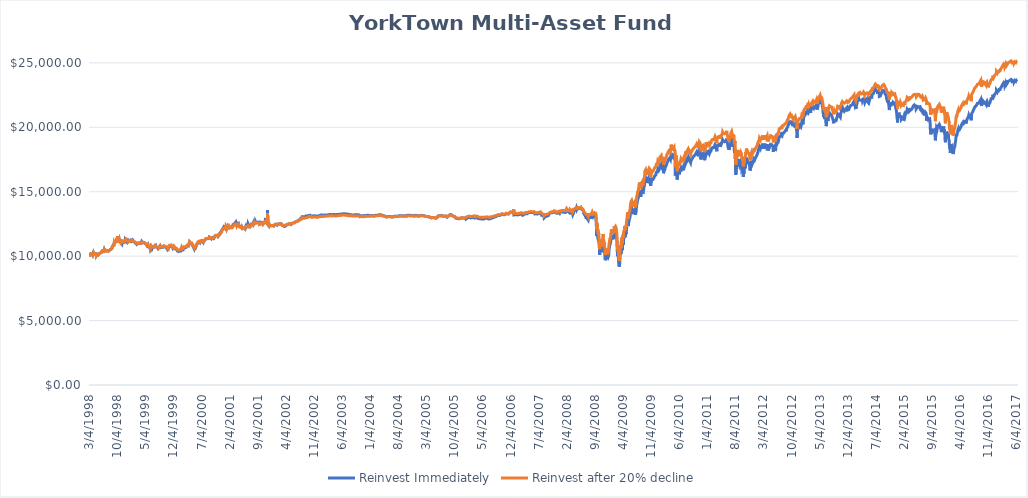
| Category | Reinvest Immediately | Reinvest after 20% decline |
|---|---|---|
| 3/4/98 | 10000 | 10000 |
| 3/5/98 | 10009.625 | 10009.625 |
| 3/6/98 | 9951.877 | 9951.877 |
| 3/9/98 | 10009.625 | 10009.625 |
| 3/10/98 | 10048.123 | 10048.123 |
| 3/11/98 | 10057.748 | 10057.748 |
| 3/12/98 | 10096.246 | 10096.246 |
| 3/13/98 | 10144.37 | 10144.37 |
| 3/16/98 | 10134.745 | 10134.745 |
| 3/17/98 | 10182.868 | 10182.868 |
| 3/18/98 | 10153.994 | 10153.994 |
| 3/19/98 | 10144.37 | 10144.37 |
| 3/20/98 | 10134.745 | 10134.745 |
| 3/23/98 | 10144.37 | 10144.37 |
| 3/24/98 | 10153.994 | 10153.994 |
| 3/25/98 | 10163.619 | 10163.619 |
| 3/26/98 | 10115.496 | 10115.496 |
| 3/27/98 | 10086.622 | 10086.622 |
| 3/30/98 | 10086.622 | 10086.622 |
| 3/31/98 | 10067.262 | 10067.372 |
| 4/1/98 | 10105.982 | 10105.871 |
| 4/2/98 | 10135.022 | 10134.745 |
| 4/3/98 | 10183.422 | 10182.868 |
| 4/6/98 | 10270.543 | 10269.49 |
| 4/7/98 | 10231.823 | 10230.991 |
| 4/8/98 | 10222.143 | 10221.367 |
| 4/9/98 | 10183.422 | 10182.868 |
| 4/13/98 | 10173.742 | 10173.244 |
| 4/14/98 | 10125.342 | 10125.12 |
| 4/15/98 | 10154.382 | 10153.994 |
| 4/16/98 | 10173.742 | 10173.244 |
| 4/17/98 | 10202.782 | 10202.117 |
| 4/20/98 | 10202.782 | 10202.117 |
| 4/21/98 | 10164.062 | 10163.619 |
| 4/22/98 | 10135.022 | 10134.745 |
| 4/23/98 | 10135.022 | 10134.745 |
| 4/24/98 | 10135.022 | 10134.745 |
| 4/27/98 | 10144.702 | 10144.37 |
| 4/28/98 | 10047.902 | 10048.123 |
| 4/29/98 | 10038.221 | 10038.499 |
| 4/30/98 | 10038.221 | 10038.499 |
| 5/1/98 | 10125.342 | 10125.12 |
| 5/4/98 | 10154.382 | 10153.994 |
| 5/5/98 | 10154.382 | 10153.994 |
| 5/6/98 | 10135.022 | 10134.745 |
| 5/7/98 | 10164.062 | 10163.619 |
| 5/8/98 | 10154.382 | 10153.994 |
| 5/11/98 | 10135.022 | 10134.745 |
| 5/12/98 | 10096.302 | 10096.246 |
| 5/13/98 | 10154.382 | 10153.994 |
| 5/14/98 | 10173.742 | 10173.244 |
| 5/15/98 | 10154.382 | 10153.994 |
| 5/18/98 | 10154.382 | 10153.994 |
| 5/19/98 | 10183.422 | 10182.868 |
| 5/20/98 | 10173.742 | 10173.244 |
| 5/21/98 | 10212.463 | 10211.742 |
| 5/22/98 | 10183.422 | 10182.868 |
| 5/26/98 | 10202.782 | 10202.117 |
| 5/27/98 | 10241.503 | 10240.616 |
| 5/28/98 | 10270.543 | 10269.49 |
| 5/29/98 | 10270.543 | 10269.49 |
| 6/1/98 | 10289.903 | 10288.739 |
| 6/2/98 | 10299.583 | 10298.364 |
| 6/3/98 | 10280.223 | 10279.115 |
| 6/4/98 | 10270.543 | 10269.49 |
| 6/5/98 | 10251.183 | 10250.241 |
| 6/8/98 | 10260.863 | 10259.865 |
| 6/9/98 | 10270.543 | 10269.49 |
| 6/10/98 | 10270.543 | 10269.49 |
| 6/11/98 | 10328.623 | 10327.238 |
| 6/12/98 | 10406.064 | 10404.235 |
| 6/15/98 | 10425.424 | 10423.484 |
| 6/16/98 | 10444.784 | 10442.733 |
| 6/17/98 | 10396.384 | 10394.61 |
| 6/18/98 | 10328.623 | 10327.238 |
| 6/19/98 | 10347.983 | 10346.487 |
| 6/22/98 | 10367.343 | 10365.736 |
| 6/23/98 | 10386.704 | 10384.986 |
| 6/24/98 | 10396.384 | 10394.61 |
| 6/25/98 | 10396.384 | 10394.61 |
| 6/26/98 | 10492.63 | 10490.857 |
| 6/29/98 | 10404.703 | 10404.235 |
| 6/30/98 | 10394.933 | 10394.61 |
| 7/1/98 | 10424.242 | 10423.484 |
| 7/2/98 | 10424.242 | 10423.484 |
| 7/6/98 | 10443.782 | 10442.733 |
| 7/7/98 | 10463.321 | 10461.983 |
| 7/8/98 | 10453.551 | 10452.358 |
| 7/9/98 | 10443.782 | 10442.733 |
| 7/10/98 | 10453.551 | 10452.358 |
| 7/13/98 | 10453.551 | 10452.358 |
| 7/14/98 | 10414.473 | 10413.859 |
| 7/15/98 | 10385.164 | 10384.986 |
| 7/16/98 | 10394.933 | 10394.61 |
| 7/17/98 | 10385.164 | 10384.986 |
| 7/20/98 | 10375.394 | 10375.361 |
| 7/21/98 | 10394.933 | 10394.61 |
| 7/22/98 | 10414.473 | 10413.859 |
| 7/23/98 | 10414.473 | 10413.859 |
| 7/24/98 | 10443.782 | 10442.733 |
| 7/27/98 | 10424.242 | 10423.484 |
| 7/28/98 | 10424.242 | 10423.484 |
| 7/29/98 | 10404.703 | 10404.235 |
| 7/30/98 | 10385.164 | 10384.986 |
| 7/31/98 | 10404.703 | 10404.235 |
| 8/3/98 | 10414.473 | 10413.859 |
| 8/4/98 | 10453.551 | 10452.358 |
| 8/5/98 | 10473.091 | 10471.607 |
| 8/6/98 | 10473.091 | 10471.607 |
| 8/7/98 | 10473.091 | 10471.607 |
| 8/10/98 | 10502.4 | 10500.481 |
| 8/11/98 | 10502.4 | 10500.481 |
| 8/12/98 | 10541.478 | 10538.98 |
| 8/13/98 | 10531.709 | 10529.355 |
| 8/14/98 | 10492.63 | 10490.857 |
| 8/17/98 | 10531.709 | 10529.355 |
| 8/18/98 | 10541.478 | 10538.98 |
| 8/19/98 | 10531.709 | 10529.355 |
| 8/20/98 | 10521.939 | 10519.731 |
| 8/21/98 | 10551.248 | 10548.604 |
| 8/24/98 | 10619.636 | 10615.977 |
| 8/25/98 | 10639.175 | 10635.226 |
| 8/26/98 | 10668.484 | 10664.1 |
| 8/27/98 | 10717.333 | 10712.223 |
| 8/28/98 | 10785.72 | 10779.596 |
| 8/31/98 | 10805.26 | 10798.845 |
| 9/1/98 | 10824.799 | 10818.094 |
| 9/2/98 | 10824.799 | 10818.094 |
| 9/3/98 | 10795.49 | 10789.22 |
| 9/4/98 | 10844.338 | 10837.344 |
| 9/8/98 | 10863.878 | 10856.593 |
| 9/9/98 | 10854.108 | 10846.968 |
| 9/10/98 | 10922.496 | 10914.341 |
| 9/11/98 | 11088.58 | 11077.96 |
| 9/14/98 | 11010.423 | 11000.962 |
| 9/15/98 | 10990.883 | 10981.713 |
| 9/16/98 | 10971.344 | 10962.464 |
| 9/17/98 | 10990.883 | 10981.713 |
| 9/18/98 | 11059.271 | 11049.086 |
| 9/21/98 | 11137.429 | 11126.083 |
| 9/22/98 | 11127.659 | 11116.458 |
| 9/23/98 | 11117.889 | 11106.833 |
| 9/24/98 | 11137.429 | 11126.083 |
| 9/25/98 | 11156.968 | 11145.332 |
| 9/28/98 | 11204.366 | 11193.455 |
| 9/29/98 | 11184.657 | 11174.206 |
| 9/30/98 | 11214.22 | 11203.08 |
| 10/1/98 | 11342.326 | 11328.2 |
| 10/2/98 | 11411.307 | 11395.573 |
| 10/5/98 | 11450.724 | 11434.071 |
| 10/6/98 | 11549.267 | 11530.318 |
| 10/7/98 | 11470.433 | 11453.321 |
| 10/8/98 | 11391.598 | 11376.323 |
| 10/9/98 | 11204.366 | 11193.455 |
| 10/12/98 | 11046.697 | 11039.461 |
| 10/13/98 | 11046.697 | 11039.461 |
| 10/14/98 | 11056.551 | 11049.086 |
| 10/15/98 | 11174.803 | 11164.581 |
| 10/16/98 | 11164.949 | 11154.957 |
| 10/19/98 | 11293.055 | 11280.077 |
| 10/20/98 | 11273.346 | 11260.828 |
| 10/21/98 | 11194.512 | 11183.831 |
| 10/22/98 | 11184.657 | 11174.206 |
| 10/23/98 | 11174.803 | 11164.581 |
| 10/26/98 | 11115.677 | 11106.833 |
| 10/27/98 | 11105.823 | 11097.209 |
| 10/28/98 | 11194.512 | 11183.831 |
| 10/29/98 | 11263.492 | 11251.203 |
| 10/30/98 | 11302.909 | 11289.702 |
| 11/2/98 | 11253.638 | 11241.578 |
| 11/3/98 | 11155.094 | 11145.332 |
| 11/4/98 | 11155.094 | 11145.332 |
| 11/5/98 | 11046.697 | 11039.461 |
| 11/6/98 | 11056.551 | 11049.086 |
| 11/9/98 | 10967.862 | 10962.464 |
| 11/10/98 | 11017.134 | 11010.587 |
| 11/11/98 | 11056.551 | 11049.086 |
| 11/12/98 | 11056.551 | 11049.086 |
| 11/13/98 | 11125.531 | 11116.458 |
| 11/16/98 | 11086.114 | 11077.96 |
| 11/17/98 | 11076.26 | 11068.335 |
| 11/18/98 | 11076.26 | 11068.335 |
| 11/19/98 | 11086.114 | 11077.96 |
| 11/20/98 | 11086.114 | 11077.96 |
| 11/23/98 | 11125.531 | 11116.458 |
| 11/24/98 | 11095.968 | 11087.584 |
| 11/25/98 | 11076.26 | 11068.335 |
| 11/27/98 | 11086.114 | 11077.96 |
| 11/30/98 | 11105.823 | 11097.209 |
| 12/1/98 | 11174.803 | 11164.581 |
| 12/2/98 | 11224.075 | 11212.705 |
| 12/3/98 | 11293.055 | 11280.077 |
| 12/4/98 | 11302.909 | 11289.702 |
| 12/7/98 | 11243.783 | 11231.954 |
| 12/8/98 | 11214.22 | 11203.08 |
| 12/9/98 | 11263.492 | 11251.203 |
| 12/10/98 | 11322.618 | 11308.951 |
| 12/11/98 | 11342.326 | 11328.2 |
| 12/14/98 | 11293.055 | 11280.077 |
| 12/15/98 | 11312.763 | 11299.326 |
| 12/16/98 | 11273.346 | 11260.828 |
| 12/17/98 | 11312.763 | 11299.326 |
| 12/18/98 | 11302.909 | 11289.702 |
| 12/21/98 | 11284.786 | 11280.077 |
| 12/22/98 | 11223.787 | 11222.329 |
| 12/23/98 | 11203.454 | 11203.08 |
| 12/24/98 | 11122.123 | 11126.083 |
| 12/28/98 | 11061.124 | 11068.335 |
| 12/29/98 | 11122.123 | 11126.083 |
| 12/30/98 | 11172.955 | 11174.206 |
| 12/31/98 | 11223.787 | 11222.329 |
| 1/4/99 | 11233.954 | 11231.954 |
| 1/5/99 | 11193.288 | 11193.455 |
| 1/6/99 | 11162.788 | 11164.581 |
| 1/7/99 | 11183.121 | 11183.831 |
| 1/8/99 | 11162.788 | 11164.581 |
| 1/11/99 | 11111.956 | 11116.458 |
| 1/12/99 | 11101.79 | 11106.833 |
| 1/13/99 | 11142.456 | 11145.332 |
| 1/14/99 | 11172.955 | 11174.206 |
| 1/15/99 | 11244.12 | 11241.578 |
| 1/19/99 | 11213.621 | 11212.705 |
| 1/20/99 | 11193.288 | 11193.455 |
| 1/21/99 | 11162.788 | 11164.581 |
| 1/22/99 | 11203.454 | 11203.08 |
| 1/25/99 | 11223.787 | 11222.329 |
| 1/26/99 | 11223.787 | 11222.329 |
| 1/27/99 | 11223.787 | 11222.329 |
| 1/28/99 | 11233.954 | 11231.954 |
| 1/29/99 | 11254.287 | 11251.203 |
| 2/1/99 | 11264.453 | 11260.828 |
| 2/2/99 | 11213.621 | 11212.705 |
| 2/3/99 | 11183.121 | 11183.831 |
| 2/4/99 | 11162.788 | 11164.581 |
| 2/5/99 | 11132.289 | 11135.707 |
| 2/8/99 | 11091.623 | 11097.209 |
| 2/9/99 | 11101.79 | 11106.833 |
| 2/10/99 | 11111.956 | 11116.458 |
| 2/11/99 | 11111.956 | 11116.458 |
| 2/12/99 | 11101.79 | 11106.833 |
| 2/16/99 | 11020.458 | 11029.836 |
| 2/17/99 | 11061.124 | 11068.335 |
| 2/18/99 | 11040.791 | 11049.086 |
| 2/19/99 | 11030.624 | 11039.461 |
| 2/22/99 | 11050.957 | 11058.71 |
| 2/23/99 | 11030.624 | 11039.461 |
| 2/24/99 | 11000.125 | 11010.587 |
| 2/25/99 | 10949.293 | 10962.464 |
| 2/26/99 | 10959.459 | 10972.089 |
| 3/1/99 | 10918.793 | 10933.59 |
| 3/2/99 | 10928.96 | 10943.215 |
| 3/3/99 | 10928.96 | 10943.215 |
| 3/4/99 | 10928.96 | 10943.215 |
| 3/5/99 | 10949.293 | 10962.464 |
| 3/8/99 | 10959.459 | 10972.089 |
| 3/9/99 | 10989.958 | 11000.962 |
| 3/10/99 | 10989.958 | 11000.962 |
| 3/11/99 | 10979.792 | 10991.338 |
| 3/12/99 | 11000.125 | 11010.587 |
| 3/15/99 | 11020.458 | 11029.836 |
| 3/16/99 | 11040.791 | 11049.086 |
| 3/17/99 | 11030.624 | 11039.461 |
| 3/18/99 | 11030.624 | 11039.461 |
| 3/19/99 | 11020.458 | 11029.836 |
| 3/22/99 | 11000.125 | 11010.587 |
| 3/23/99 | 11010.291 | 11020.212 |
| 3/24/99 | 11030.624 | 11039.461 |
| 3/25/99 | 10984.54 | 11000.962 |
| 3/26/99 | 10994.796 | 11010.587 |
| 3/29/99 | 10953.771 | 10972.089 |
| 3/30/99 | 10974.284 | 10991.338 |
| 3/31/99 | 10974.284 | 10991.338 |
| 4/1/99 | 10943.515 | 10962.464 |
| 4/5/99 | 11005.053 | 11020.212 |
| 4/6/99 | 11056.334 | 11068.335 |
| 4/7/99 | 11066.591 | 11077.96 |
| 4/8/99 | 11138.385 | 11145.332 |
| 4/9/99 | 11128.129 | 11135.707 |
| 4/12/99 | 11148.642 | 11154.957 |
| 4/13/99 | 11117.872 | 11126.083 |
| 4/14/99 | 11107.616 | 11116.458 |
| 4/15/99 | 11087.103 | 11097.209 |
| 4/16/99 | 11046.078 | 11058.71 |
| 4/19/99 | 11087.103 | 11097.209 |
| 4/20/99 | 11117.872 | 11126.083 |
| 4/21/99 | 11107.616 | 11116.458 |
| 4/22/99 | 11046.078 | 11058.71 |
| 4/23/99 | 11046.078 | 11058.71 |
| 4/26/99 | 11056.334 | 11068.335 |
| 4/27/99 | 11076.847 | 11087.584 |
| 4/28/99 | 11056.334 | 11068.335 |
| 4/29/99 | 11107.616 | 11116.458 |
| 4/30/99 | 11015.309 | 11029.836 |
| 5/3/99 | 11005.053 | 11020.212 |
| 5/4/99 | 10964.027 | 10981.713 |
| 5/5/99 | 10974.284 | 10991.338 |
| 5/6/99 | 10933.258 | 10952.839 |
| 5/7/99 | 10933.258 | 10952.839 |
| 5/10/99 | 10933.258 | 10952.839 |
| 5/11/99 | 10892.233 | 10914.341 |
| 5/12/99 | 10912.746 | 10933.59 |
| 5/13/99 | 10984.54 | 11000.962 |
| 5/14/99 | 10871.72 | 10895.091 |
| 5/17/99 | 10851.208 | 10875.842 |
| 5/18/99 | 10810.182 | 10837.344 |
| 5/19/99 | 10840.951 | 10866.218 |
| 5/20/99 | 10840.951 | 10866.218 |
| 5/21/99 | 10881.977 | 10904.716 |
| 5/24/99 | 10902.489 | 10923.965 |
| 5/25/99 | 10902.489 | 10923.965 |
| 5/26/99 | 10861.464 | 10885.467 |
| 5/27/99 | 10799.926 | 10827.719 |
| 5/28/99 | 10799.926 | 10827.719 |
| 6/1/99 | 10697.363 | 10731.473 |
| 6/2/99 | 10697.363 | 10731.473 |
| 6/3/99 | 10707.619 | 10741.097 |
| 6/4/99 | 10707.619 | 10741.097 |
| 6/7/99 | 10707.619 | 10741.097 |
| 6/8/99 | 10697.363 | 10731.473 |
| 6/9/99 | 10676.85 | 10712.223 |
| 6/10/99 | 10646.081 | 10683.349 |
| 6/11/99 | 10574.286 | 10615.977 |
| 6/14/99 | 10594.799 | 10635.226 |
| 6/15/99 | 10605.055 | 10644.851 |
| 6/16/99 | 10635.825 | 10673.725 |
| 6/17/99 | 10748.644 | 10779.596 |
| 6/18/99 | 10717.875 | 10750.722 |
| 6/21/99 | 10666.594 | 10702.599 |
| 6/22/99 | 10646.081 | 10683.349 |
| 6/23/99 | 10605.055 | 10644.851 |
| 6/24/99 | 10578.226 | 10625.602 |
| 6/25/99 | 10578.226 | 10625.602 |
| 6/28/99 | 10619.628 | 10664.1 |
| 6/29/99 | 10640.329 | 10683.349 |
| 6/30/99 | 10723.133 | 10760.346 |
| 7/1/99 | 10702.432 | 10741.097 |
| 7/2/99 | 10702.432 | 10741.097 |
| 7/6/99 | 10681.731 | 10721.848 |
| 7/7/99 | 10661.03 | 10702.599 |
| 7/8/99 | 10702.432 | 10741.097 |
| 7/9/99 | 10723.133 | 10760.346 |
| 7/12/99 | 10774.886 | 10808.47 |
| 7/13/99 | 10785.236 | 10818.094 |
| 7/14/99 | 10774.886 | 10808.47 |
| 7/15/99 | 10785.236 | 10818.094 |
| 7/16/99 | 10805.937 | 10837.344 |
| 7/19/99 | 10816.288 | 10846.968 |
| 7/20/99 | 10836.989 | 10866.218 |
| 7/21/99 | 10836.989 | 10866.218 |
| 7/22/99 | 10764.535 | 10798.845 |
| 7/23/99 | 10723.133 | 10760.346 |
| 7/26/99 | 10702.432 | 10741.097 |
| 7/27/99 | 10733.484 | 10769.971 |
| 7/28/99 | 10723.133 | 10760.346 |
| 7/29/99 | 10681.731 | 10721.848 |
| 7/30/99 | 10681.731 | 10721.848 |
| 8/2/99 | 10681.731 | 10721.848 |
| 8/3/99 | 10661.03 | 10702.599 |
| 8/4/99 | 10671.38 | 10712.223 |
| 8/5/99 | 10723.133 | 10760.346 |
| 8/6/99 | 10640.329 | 10683.349 |
| 8/9/99 | 10578.226 | 10625.602 |
| 8/10/99 | 10557.525 | 10606.352 |
| 8/11/99 | 10578.226 | 10625.602 |
| 8/12/99 | 10578.226 | 10625.602 |
| 8/13/99 | 10640.329 | 10683.349 |
| 8/16/99 | 10640.329 | 10683.349 |
| 8/17/99 | 10681.731 | 10721.848 |
| 8/18/99 | 10702.432 | 10741.097 |
| 8/19/99 | 10702.432 | 10741.097 |
| 8/20/99 | 10702.432 | 10741.097 |
| 8/23/99 | 10702.432 | 10741.097 |
| 8/24/99 | 10723.133 | 10760.346 |
| 8/25/99 | 10795.587 | 10827.719 |
| 8/26/99 | 10785.236 | 10818.094 |
| 8/27/99 | 10743.834 | 10779.596 |
| 8/30/99 | 10671.38 | 10712.223 |
| 8/31/99 | 10661.03 | 10702.599 |
| 9/1/99 | 10661.03 | 10702.599 |
| 9/2/99 | 10640.329 | 10683.349 |
| 9/3/99 | 10712.782 | 10750.722 |
| 9/7/99 | 10692.081 | 10731.473 |
| 9/8/99 | 10692.081 | 10731.473 |
| 9/9/99 | 10671.38 | 10712.223 |
| 9/10/99 | 10712.782 | 10750.722 |
| 9/13/99 | 10712.782 | 10750.722 |
| 9/14/99 | 10671.38 | 10712.223 |
| 9/15/99 | 10692.081 | 10731.473 |
| 9/16/99 | 10712.782 | 10750.722 |
| 9/17/99 | 10743.834 | 10779.596 |
| 9/20/99 | 10723.133 | 10760.346 |
| 9/21/99 | 10723.133 | 10760.346 |
| 9/22/99 | 10733.484 | 10769.971 |
| 9/23/99 | 10774.886 | 10808.47 |
| 9/24/99 | 10847.339 | 10875.842 |
| 9/27/99 | 10805.937 | 10837.344 |
| 9/28/99 | 10774.886 | 10808.47 |
| 9/29/99 | 10712.782 | 10750.722 |
| 9/30/99 | 10757.276 | 10798.845 |
| 10/1/99 | 10705.057 | 10750.722 |
| 10/4/99 | 10736.388 | 10779.596 |
| 10/5/99 | 10684.169 | 10731.473 |
| 10/6/99 | 10673.725 | 10721.848 |
| 10/7/99 | 10673.725 | 10721.848 |
| 10/8/99 | 10684.169 | 10731.473 |
| 10/11/99 | 10684.169 | 10731.473 |
| 10/12/99 | 10663.281 | 10712.223 |
| 10/13/99 | 10631.949 | 10683.349 |
| 10/14/99 | 10600.617 | 10654.475 |
| 10/15/99 | 10642.393 | 10692.974 |
| 10/18/99 | 10558.841 | 10615.977 |
| 10/19/99 | 10527.509 | 10587.103 |
| 10/20/99 | 10506.621 | 10567.854 |
| 10/21/99 | 10506.621 | 10567.854 |
| 10/22/99 | 10506.621 | 10567.854 |
| 10/25/99 | 10496.177 | 10558.229 |
| 10/26/99 | 10485.733 | 10548.604 |
| 10/27/99 | 10527.509 | 10587.103 |
| 10/28/99 | 10611.061 | 10664.1 |
| 10/29/99 | 10705.057 | 10750.722 |
| 11/1/99 | 10673.725 | 10721.848 |
| 11/2/99 | 10705.057 | 10750.722 |
| 11/3/99 | 10725.944 | 10769.971 |
| 11/4/99 | 10778.164 | 10818.094 |
| 11/5/99 | 10809.496 | 10846.968 |
| 11/8/99 | 10767.72 | 10808.47 |
| 11/9/99 | 10778.164 | 10818.094 |
| 11/10/99 | 10757.276 | 10798.845 |
| 11/11/99 | 10757.276 | 10798.845 |
| 11/12/99 | 10819.94 | 10856.593 |
| 11/15/99 | 10830.384 | 10866.218 |
| 11/16/99 | 10809.496 | 10846.968 |
| 11/17/99 | 10767.72 | 10808.47 |
| 11/18/99 | 10736.388 | 10779.596 |
| 11/19/99 | 10746.832 | 10789.22 |
| 11/22/99 | 10715.5 | 10760.346 |
| 11/23/99 | 10715.5 | 10760.346 |
| 11/24/99 | 10715.5 | 10760.346 |
| 11/26/99 | 10715.5 | 10760.346 |
| 11/29/99 | 10631.949 | 10683.349 |
| 11/30/99 | 10663.281 | 10712.223 |
| 12/1/99 | 10642.393 | 10692.974 |
| 12/2/99 | 10611.061 | 10664.1 |
| 12/3/99 | 10684.169 | 10731.473 |
| 12/6/99 | 10694.613 | 10741.097 |
| 12/7/99 | 10746.832 | 10789.22 |
| 12/8/99 | 10725.944 | 10769.971 |
| 12/9/99 | 10725.944 | 10769.971 |
| 12/10/99 | 10788.608 | 10827.719 |
| 12/13/99 | 10788.608 | 10827.719 |
| 12/14/99 | 10684.169 | 10731.473 |
| 12/15/99 | 10652.837 | 10702.599 |
| 12/16/99 | 10600.617 | 10654.475 |
| 12/17/99 | 10590.173 | 10644.851 |
| 12/20/99 | 10558.841 | 10615.977 |
| 12/21/99 | 10548.397 | 10606.352 |
| 12/22/99 | 10517.065 | 10577.478 |
| 12/23/99 | 10517.065 | 10577.478 |
| 12/27/99 | 10537.953 | 10596.728 |
| 12/28/99 | 10537.953 | 10596.728 |
| 12/29/99 | 10548.397 | 10606.352 |
| 12/30/99 | 10531.804 | 10615.977 |
| 12/31/99 | 10488.729 | 10577.478 |
| 1/3/00 | 10402.579 | 10500.481 |
| 1/4/00 | 10467.191 | 10558.229 |
| 1/5/00 | 10391.81 | 10490.857 |
| 1/6/00 | 10434.885 | 10529.355 |
| 1/7/00 | 10445.654 | 10538.98 |
| 1/10/00 | 10434.885 | 10529.355 |
| 1/11/00 | 10359.504 | 10461.983 |
| 1/12/00 | 10337.967 | 10442.733 |
| 1/13/00 | 10424.116 | 10519.731 |
| 1/14/00 | 10402.579 | 10500.481 |
| 1/18/00 | 10370.273 | 10471.607 |
| 1/19/00 | 10402.579 | 10500.481 |
| 1/20/00 | 10391.81 | 10490.857 |
| 1/21/00 | 10381.042 | 10481.232 |
| 1/24/00 | 10424.116 | 10519.731 |
| 1/25/00 | 10413.348 | 10510.106 |
| 1/26/00 | 10402.579 | 10500.481 |
| 1/27/00 | 10402.579 | 10500.481 |
| 1/28/00 | 10488.729 | 10577.478 |
| 1/31/00 | 10499.497 | 10587.103 |
| 2/1/00 | 10531.804 | 10615.977 |
| 2/2/00 | 10542.572 | 10625.602 |
| 2/3/00 | 10596.416 | 10673.725 |
| 2/4/00 | 10542.572 | 10625.602 |
| 2/7/00 | 10467.191 | 10558.229 |
| 2/8/00 | 10521.035 | 10606.352 |
| 2/9/00 | 10488.729 | 10577.478 |
| 2/10/00 | 10402.579 | 10500.481 |
| 2/11/00 | 10434.885 | 10529.355 |
| 2/14/00 | 10510.266 | 10596.728 |
| 2/15/00 | 10488.729 | 10577.478 |
| 2/16/00 | 10499.497 | 10587.103 |
| 2/17/00 | 10488.729 | 10577.478 |
| 2/18/00 | 10564.11 | 10644.851 |
| 2/22/00 | 10661.028 | 10731.473 |
| 2/23/00 | 10607.185 | 10683.349 |
| 2/24/00 | 10671.797 | 10741.097 |
| 2/25/00 | 10671.797 | 10741.097 |
| 2/28/00 | 10607.185 | 10683.349 |
| 2/29/00 | 10607.185 | 10683.349 |
| 3/1/00 | 10650.259 | 10721.848 |
| 3/2/00 | 10628.722 | 10702.599 |
| 3/3/00 | 10661.028 | 10731.473 |
| 3/6/00 | 10650.259 | 10721.848 |
| 3/7/00 | 10661.028 | 10731.473 |
| 3/8/00 | 10661.028 | 10731.473 |
| 3/9/00 | 10682.566 | 10750.722 |
| 3/10/00 | 10650.259 | 10721.848 |
| 3/13/00 | 10671.797 | 10741.097 |
| 3/14/00 | 10714.872 | 10779.596 |
| 3/15/00 | 10714.872 | 10779.596 |
| 3/16/00 | 10714.872 | 10779.596 |
| 3/17/00 | 10801.021 | 10856.593 |
| 3/20/00 | 10801.021 | 10856.593 |
| 3/21/00 | 10833.328 | 10885.467 |
| 3/22/00 | 10833.328 | 10885.467 |
| 3/23/00 | 10865.634 | 10914.341 |
| 3/24/00 | 10811.79 | 10866.218 |
| 3/27/00 | 10790.253 | 10846.968 |
| 3/28/00 | 10811.79 | 10866.218 |
| 3/29/00 | 10822.559 | 10875.842 |
| 3/30/00 | 10822.559 | 10875.842 |
| 3/31/00 | 10940.343 | 10991.338 |
| 4/3/00 | 10972.936 | 11020.212 |
| 4/4/00 | 11092.443 | 11126.083 |
| 4/5/00 | 11092.443 | 11126.083 |
| 4/6/00 | 11027.257 | 11068.335 |
| 4/7/00 | 11081.579 | 11116.458 |
| 4/10/00 | 11125.036 | 11154.957 |
| 4/11/00 | 11059.85 | 11097.209 |
| 4/12/00 | 10983.8 | 11029.836 |
| 4/13/00 | 11005.529 | 11049.086 |
| 4/14/00 | 11027.257 | 11068.335 |
| 4/17/00 | 10983.8 | 11029.836 |
| 4/18/00 | 10929.478 | 10981.713 |
| 4/19/00 | 10972.936 | 11020.212 |
| 4/20/00 | 10983.8 | 11029.836 |
| 4/24/00 | 10994.664 | 11039.461 |
| 4/25/00 | 10918.614 | 10972.089 |
| 4/26/00 | 10918.614 | 10972.089 |
| 4/27/00 | 10820.836 | 10885.467 |
| 4/28/00 | 10842.564 | 10904.716 |
| 5/1/00 | 10809.971 | 10875.842 |
| 5/2/00 | 10799.107 | 10866.218 |
| 5/3/00 | 10701.328 | 10779.596 |
| 5/4/00 | 10679.6 | 10760.346 |
| 5/5/00 | 10647.007 | 10731.473 |
| 5/8/00 | 10592.685 | 10683.349 |
| 5/9/00 | 10625.278 | 10712.223 |
| 5/10/00 | 10690.464 | 10769.971 |
| 5/11/00 | 10701.328 | 10779.596 |
| 5/12/00 | 10647.007 | 10731.473 |
| 5/15/00 | 10690.464 | 10769.971 |
| 5/16/00 | 10733.921 | 10808.47 |
| 5/17/00 | 10690.464 | 10769.971 |
| 5/18/00 | 10625.278 | 10712.223 |
| 5/19/00 | 10647.007 | 10731.473 |
| 5/22/00 | 10733.921 | 10808.47 |
| 5/23/00 | 10701.328 | 10779.596 |
| 5/24/00 | 10701.328 | 10779.596 |
| 5/25/00 | 10766.514 | 10837.344 |
| 5/26/00 | 10831.7 | 10895.091 |
| 5/30/00 | 10820.836 | 10885.467 |
| 5/31/00 | 10886.021 | 10943.215 |
| 6/1/00 | 10951.207 | 11000.962 |
| 6/2/00 | 10994.664 | 11039.461 |
| 6/5/00 | 11027.257 | 11068.335 |
| 6/6/00 | 11027.257 | 11068.335 |
| 6/7/00 | 11059.85 | 11097.209 |
| 6/8/00 | 11081.579 | 11116.458 |
| 6/9/00 | 11092.443 | 11126.083 |
| 6/12/00 | 11103.307 | 11135.707 |
| 6/13/00 | 11070.714 | 11106.833 |
| 6/14/00 | 11114.171 | 11145.332 |
| 6/15/00 | 11125.036 | 11154.957 |
| 6/16/00 | 11179.357 | 11203.08 |
| 6/19/00 | 11157.629 | 11183.831 |
| 6/20/00 | 11168.493 | 11193.455 |
| 6/21/00 | 11092.443 | 11126.083 |
| 6/22/00 | 11070.714 | 11106.833 |
| 6/23/00 | 11038.121 | 11077.96 |
| 6/26/00 | 11070.714 | 11106.833 |
| 6/27/00 | 11103.307 | 11135.707 |
| 6/28/00 | 11092.443 | 11126.083 |
| 6/29/00 | 11048.986 | 11087.584 |
| 6/30/00 | 11166.961 | 11203.08 |
| 7/3/00 | 11166.961 | 11203.08 |
| 7/5/00 | 11210.796 | 11241.578 |
| 7/6/00 | 11166.961 | 11203.08 |
| 7/7/00 | 11210.796 | 11241.578 |
| 7/10/00 | 11188.878 | 11222.329 |
| 7/11/00 | 11177.919 | 11212.705 |
| 7/12/00 | 11156.002 | 11193.455 |
| 7/13/00 | 11199.837 | 11231.954 |
| 7/14/00 | 11134.084 | 11174.206 |
| 7/17/00 | 11079.291 | 11126.083 |
| 7/18/00 | 11090.249 | 11135.707 |
| 7/19/00 | 11090.249 | 11135.707 |
| 7/20/00 | 11177.919 | 11212.705 |
| 7/21/00 | 11210.796 | 11241.578 |
| 7/24/00 | 11199.837 | 11231.954 |
| 7/25/00 | 11199.837 | 11231.954 |
| 7/26/00 | 11210.796 | 11241.578 |
| 7/27/00 | 11232.713 | 11260.828 |
| 7/28/00 | 11221.754 | 11251.203 |
| 7/31/00 | 11210.796 | 11241.578 |
| 8/1/00 | 11243.672 | 11270.452 |
| 8/2/00 | 11243.672 | 11270.452 |
| 8/3/00 | 11276.548 | 11299.326 |
| 8/4/00 | 11331.342 | 11347.449 |
| 8/7/00 | 11331.342 | 11347.449 |
| 8/8/00 | 11320.383 | 11337.825 |
| 8/9/00 | 11331.342 | 11347.449 |
| 8/10/00 | 11375.177 | 11385.948 |
| 8/11/00 | 11342.301 | 11357.074 |
| 8/14/00 | 11353.259 | 11366.699 |
| 8/15/00 | 11353.259 | 11366.699 |
| 8/16/00 | 11342.301 | 11357.074 |
| 8/17/00 | 11331.342 | 11347.449 |
| 8/18/00 | 11364.218 | 11376.323 |
| 8/21/00 | 11375.177 | 11385.948 |
| 8/22/00 | 11375.177 | 11385.948 |
| 8/23/00 | 11375.177 | 11385.948 |
| 8/24/00 | 11429.971 | 11434.071 |
| 8/25/00 | 11451.888 | 11453.321 |
| 8/28/00 | 11408.053 | 11414.822 |
| 8/29/00 | 11375.177 | 11385.948 |
| 8/30/00 | 11386.136 | 11395.573 |
| 8/31/00 | 11429.971 | 11434.071 |
| 9/1/00 | 11484.764 | 11482.194 |
| 9/5/00 | 11495.723 | 11491.819 |
| 9/6/00 | 11473.805 | 11472.57 |
| 9/7/00 | 11440.929 | 11443.696 |
| 9/8/00 | 11462.847 | 11462.945 |
| 9/11/00 | 11429.971 | 11434.071 |
| 9/12/00 | 11419.012 | 11424.447 |
| 9/13/00 | 11440.929 | 11443.696 |
| 9/14/00 | 11419.012 | 11424.447 |
| 9/15/00 | 11386.136 | 11395.573 |
| 9/18/00 | 11342.301 | 11357.074 |
| 9/19/00 | 11364.218 | 11376.323 |
| 9/20/00 | 11331.342 | 11347.449 |
| 9/21/00 | 11353.259 | 11366.699 |
| 9/22/00 | 11397.094 | 11405.197 |
| 9/25/00 | 11397.094 | 11405.197 |
| 9/26/00 | 11429.971 | 11434.071 |
| 9/27/00 | 11397.094 | 11405.197 |
| 9/28/00 | 11416.629 | 11434.071 |
| 9/29/00 | 11449.785 | 11462.945 |
| 10/2/00 | 11416.629 | 11434.071 |
| 10/3/00 | 11394.526 | 11414.822 |
| 10/4/00 | 11372.422 | 11395.573 |
| 10/5/00 | 11405.578 | 11424.447 |
| 10/6/00 | 11449.785 | 11462.945 |
| 10/9/00 | 11449.785 | 11462.945 |
| 10/10/00 | 11471.889 | 11482.194 |
| 10/11/00 | 11493.993 | 11501.444 |
| 10/12/00 | 11549.252 | 11549.567 |
| 10/13/00 | 11549.252 | 11549.567 |
| 10/16/00 | 11516.097 | 11520.693 |
| 10/17/00 | 11582.408 | 11578.441 |
| 10/18/00 | 11593.46 | 11588.065 |
| 10/19/00 | 11604.512 | 11597.69 |
| 10/20/00 | 11637.668 | 11626.564 |
| 10/23/00 | 11648.72 | 11636.189 |
| 10/24/00 | 11648.72 | 11636.189 |
| 10/25/00 | 11604.512 | 11597.69 |
| 10/26/00 | 11637.668 | 11626.564 |
| 10/27/00 | 11637.668 | 11626.564 |
| 10/30/00 | 11626.616 | 11616.939 |
| 10/31/00 | 11615.564 | 11607.315 |
| 11/1/00 | 11637.668 | 11626.564 |
| 11/2/00 | 11626.616 | 11616.939 |
| 11/3/00 | 11582.408 | 11578.441 |
| 11/6/00 | 11538.201 | 11539.942 |
| 11/7/00 | 11527.149 | 11530.318 |
| 11/8/00 | 11549.252 | 11549.567 |
| 11/9/00 | 11582.408 | 11578.441 |
| 11/10/00 | 11604.512 | 11597.69 |
| 11/13/00 | 11626.616 | 11616.939 |
| 11/14/00 | 11648.72 | 11636.189 |
| 11/15/00 | 11681.875 | 11665.063 |
| 11/16/00 | 11715.031 | 11693.936 |
| 11/17/00 | 11692.927 | 11674.687 |
| 11/20/00 | 11715.031 | 11693.936 |
| 11/21/00 | 11726.083 | 11703.561 |
| 11/22/00 | 11803.447 | 11770.934 |
| 11/24/00 | 11803.447 | 11770.934 |
| 11/27/00 | 11770.291 | 11742.06 |
| 11/28/00 | 11803.447 | 11770.934 |
| 11/29/00 | 11847.654 | 11809.432 |
| 11/30/00 | 11913.966 | 11867.18 |
| 12/1/00 | 11869.758 | 11828.681 |
| 12/4/00 | 11858.706 | 11819.057 |
| 12/5/00 | 11947.121 | 11896.054 |
| 12/6/00 | 12046.589 | 11982.676 |
| 12/7/00 | 12057.641 | 11992.3 |
| 12/8/00 | 11991.329 | 11934.552 |
| 12/11/00 | 12002.381 | 11944.177 |
| 12/12/00 | 12035.537 | 11973.051 |
| 12/13/00 | 12079.744 | 12011.55 |
| 12/14/00 | 12146.056 | 12069.297 |
| 12/15/00 | 12179.212 | 12098.171 |
| 12/18/00 | 12212.367 | 12127.045 |
| 12/19/00 | 12179.212 | 12098.171 |
| 12/20/00 | 12267.627 | 12175.168 |
| 12/21/00 | 12322.887 | 12223.292 |
| 12/22/00 | 12344.99 | 12242.541 |
| 12/26/00 | 12344.99 | 12242.541 |
| 12/27/00 | 12278.679 | 12184.793 |
| 12/28/00 | 12184.15 | 12155.919 |
| 12/29/00 | 12195.591 | 12165.544 |
| 1/2/01 | 12378.639 | 12319.538 |
| 1/3/01 | 12195.591 | 12165.544 |
| 1/4/01 | 12275.674 | 12232.916 |
| 1/5/01 | 12390.08 | 12329.163 |
| 1/8/01 | 12424.401 | 12358.037 |
| 1/9/01 | 12344.317 | 12290.664 |
| 1/10/01 | 12275.674 | 12232.916 |
| 1/11/01 | 12229.912 | 12194.418 |
| 1/12/01 | 12149.829 | 12127.045 |
| 1/16/01 | 12161.269 | 12136.67 |
| 1/17/01 | 12207.031 | 12175.168 |
| 1/18/01 | 12298.555 | 12252.166 |
| 1/19/01 | 12229.912 | 12194.418 |
| 1/22/01 | 12195.591 | 12165.544 |
| 1/23/01 | 12149.829 | 12127.045 |
| 1/24/01 | 12115.507 | 12098.171 |
| 1/25/01 | 12138.388 | 12117.421 |
| 1/26/01 | 12195.591 | 12165.544 |
| 1/29/01 | 12138.388 | 12117.421 |
| 1/30/01 | 12207.031 | 12175.168 |
| 1/31/01 | 12275.674 | 12232.916 |
| 2/1/01 | 12344.317 | 12290.664 |
| 2/2/01 | 12298.555 | 12252.166 |
| 2/5/01 | 12298.555 | 12252.166 |
| 2/6/01 | 12241.353 | 12204.042 |
| 2/7/01 | 12275.674 | 12232.916 |
| 2/8/01 | 12264.234 | 12223.292 |
| 2/9/01 | 12321.436 | 12271.415 |
| 2/12/01 | 12298.555 | 12252.166 |
| 2/13/01 | 12275.674 | 12232.916 |
| 2/14/01 | 12252.793 | 12213.667 |
| 2/15/01 | 12207.031 | 12175.168 |
| 2/16/01 | 12264.234 | 12223.292 |
| 2/20/01 | 12252.793 | 12213.667 |
| 2/21/01 | 12229.912 | 12194.418 |
| 2/22/01 | 12241.353 | 12204.042 |
| 2/23/01 | 12309.996 | 12261.79 |
| 2/26/01 | 12332.877 | 12281.039 |
| 2/27/01 | 12401.52 | 12338.787 |
| 2/28/01 | 12447.282 | 12377.286 |
| 3/1/01 | 12481.604 | 12406.16 |
| 3/2/01 | 12401.52 | 12338.787 |
| 3/5/01 | 12401.52 | 12338.787 |
| 3/6/01 | 12378.639 | 12319.538 |
| 3/7/01 | 12435.842 | 12367.661 |
| 3/8/01 | 12458.723 | 12386.91 |
| 3/9/01 | 12424.401 | 12358.037 |
| 3/12/01 | 12447.282 | 12377.286 |
| 3/13/01 | 12435.842 | 12367.661 |
| 3/14/01 | 12515.925 | 12435.034 |
| 3/15/01 | 12573.128 | 12483.157 |
| 3/16/01 | 12596.009 | 12502.406 |
| 3/19/01 | 12550.247 | 12463.908 |
| 3/20/01 | 12573.128 | 12483.157 |
| 3/21/01 | 12618.89 | 12521.655 |
| 3/22/01 | 12664.652 | 12560.154 |
| 3/23/01 | 12596.009 | 12502.406 |
| 3/26/01 | 12561.687 | 12473.532 |
| 3/27/01 | 12435.842 | 12367.661 |
| 3/28/01 | 12458.723 | 12386.91 |
| 3/29/01 | 12448.373 | 12396.535 |
| 3/30/01 | 12517.659 | 12454.283 |
| 4/2/01 | 12471.468 | 12415.784 |
| 4/3/01 | 12506.111 | 12444.658 |
| 4/4/01 | 12517.659 | 12454.283 |
| 4/5/01 | 12517.659 | 12454.283 |
| 4/6/01 | 12586.945 | 12512.031 |
| 4/9/01 | 12552.302 | 12483.157 |
| 4/10/01 | 12436.825 | 12386.91 |
| 4/11/01 | 12367.539 | 12329.163 |
| 4/12/01 | 12344.444 | 12309.913 |
| 4/16/01 | 12240.515 | 12223.292 |
| 4/17/01 | 12298.253 | 12271.415 |
| 4/18/01 | 12390.634 | 12348.412 |
| 4/19/01 | 12298.253 | 12271.415 |
| 4/20/01 | 12275.158 | 12252.166 |
| 4/23/01 | 12355.991 | 12319.538 |
| 4/24/01 | 12355.991 | 12319.538 |
| 4/25/01 | 12298.253 | 12271.415 |
| 4/26/01 | 12355.991 | 12319.538 |
| 4/27/01 | 12240.515 | 12223.292 |
| 4/30/01 | 12217.42 | 12204.042 |
| 5/1/01 | 12252.063 | 12232.916 |
| 5/2/01 | 12252.063 | 12232.916 |
| 5/3/01 | 12321.348 | 12290.664 |
| 5/4/01 | 12332.896 | 12300.289 |
| 5/7/01 | 12332.896 | 12300.289 |
| 5/8/01 | 12309.801 | 12281.039 |
| 5/9/01 | 12367.539 | 12329.163 |
| 5/10/01 | 12286.705 | 12261.79 |
| 5/11/01 | 12136.586 | 12136.67 |
| 5/14/01 | 12182.777 | 12175.168 |
| 5/15/01 | 12113.491 | 12117.421 |
| 5/16/01 | 12136.586 | 12136.67 |
| 5/17/01 | 12148.134 | 12146.295 |
| 5/18/01 | 12182.777 | 12175.168 |
| 5/21/01 | 12182.777 | 12175.168 |
| 5/22/01 | 12194.324 | 12184.793 |
| 5/23/01 | 12194.324 | 12184.793 |
| 5/24/01 | 12125.038 | 12127.045 |
| 5/25/01 | 12125.038 | 12127.045 |
| 5/29/01 | 12113.491 | 12117.421 |
| 5/30/01 | 12125.038 | 12127.045 |
| 5/31/01 | 12217.42 | 12204.042 |
| 6/1/01 | 12252.063 | 12232.916 |
| 6/4/01 | 12275.158 | 12252.166 |
| 6/5/01 | 12332.896 | 12300.289 |
| 6/6/01 | 12332.896 | 12300.289 |
| 6/7/01 | 12286.705 | 12261.79 |
| 6/8/01 | 12252.063 | 12232.916 |
| 6/11/01 | 12286.705 | 12261.79 |
| 6/12/01 | 12321.348 | 12290.664 |
| 6/13/01 | 12332.896 | 12300.289 |
| 6/14/01 | 12379.087 | 12338.787 |
| 6/15/01 | 12355.991 | 12319.538 |
| 6/18/01 | 12355.991 | 12319.538 |
| 6/19/01 | 12379.087 | 12338.787 |
| 6/20/01 | 12402.182 | 12358.037 |
| 6/21/01 | 12425.277 | 12377.286 |
| 6/22/01 | 12506.111 | 12444.658 |
| 6/25/01 | 12483.016 | 12425.409 |
| 6/26/01 | 12413.73 | 12367.661 |
| 6/27/01 | 12379.087 | 12338.787 |
| 6/28/01 | 12275.177 | 12271.415 |
| 6/29/01 | 12216.89 | 12223.292 |
| 7/2/01 | 12286.834 | 12281.039 |
| 7/3/01 | 12286.834 | 12281.039 |
| 7/5/01 | 12216.89 | 12223.292 |
| 7/6/01 | 12263.52 | 12261.79 |
| 7/9/01 | 12286.834 | 12281.039 |
| 7/10/01 | 12333.464 | 12319.538 |
| 7/11/01 | 12321.806 | 12309.913 |
| 7/12/01 | 12368.436 | 12348.412 |
| 7/13/01 | 12380.093 | 12358.037 |
| 7/16/01 | 12426.722 | 12396.535 |
| 7/17/01 | 12426.722 | 12396.535 |
| 7/18/01 | 12496.666 | 12454.283 |
| 7/19/01 | 12496.666 | 12454.283 |
| 7/20/01 | 12485.009 | 12444.658 |
| 7/23/01 | 12508.324 | 12463.908 |
| 7/24/01 | 12519.981 | 12473.532 |
| 7/25/01 | 12461.694 | 12425.409 |
| 7/26/01 | 12473.352 | 12435.034 |
| 7/27/01 | 12531.638 | 12483.157 |
| 7/30/01 | 12531.638 | 12483.157 |
| 7/31/01 | 12589.925 | 12531.28 |
| 8/1/01 | 12566.61 | 12512.031 |
| 8/2/01 | 12508.324 | 12463.908 |
| 8/3/01 | 12485.009 | 12444.658 |
| 8/6/01 | 12508.324 | 12463.908 |
| 8/7/01 | 12508.324 | 12463.908 |
| 8/8/01 | 12589.925 | 12531.28 |
| 8/9/01 | 12566.61 | 12512.031 |
| 8/10/01 | 12578.268 | 12521.655 |
| 8/13/01 | 12613.24 | 12550.529 |
| 8/14/01 | 12589.925 | 12531.28 |
| 8/15/01 | 12554.953 | 12502.406 |
| 8/16/01 | 12601.582 | 12540.905 |
| 8/17/01 | 12706.498 | 12627.526 |
| 8/20/01 | 12659.869 | 12589.028 |
| 8/21/01 | 12624.897 | 12560.154 |
| 8/22/01 | 12624.897 | 12560.154 |
| 8/23/01 | 12624.897 | 12560.154 |
| 8/24/01 | 12624.897 | 12560.154 |
| 8/27/01 | 12636.554 | 12569.779 |
| 8/28/01 | 12636.554 | 12569.779 |
| 8/29/01 | 12636.554 | 12569.779 |
| 8/30/01 | 12636.554 | 12569.779 |
| 8/31/01 | 12636.554 | 12569.779 |
| 9/4/01 | 12636.554 | 12569.779 |
| 9/5/01 | 12636.554 | 12569.779 |
| 9/6/01 | 12636.554 | 12569.779 |
| 9/7/01 | 12648.212 | 12579.403 |
| 9/10/01 | 12648.212 | 12579.403 |
| 9/17/01 | 12648.212 | 12579.403 |
| 9/18/01 | 12508.324 | 12463.908 |
| 9/19/01 | 12566.61 | 12512.031 |
| 9/20/01 | 12531.638 | 12483.157 |
| 9/21/01 | 12543.296 | 12492.782 |
| 9/24/01 | 12519.981 | 12473.532 |
| 9/25/01 | 12519.981 | 12473.532 |
| 9/26/01 | 12554.953 | 12502.406 |
| 9/27/01 | 12565.533 | 12531.28 |
| 9/28/01 | 12553.767 | 12521.655 |
| 10/1/01 | 12577.298 | 12540.905 |
| 10/2/01 | 12589.064 | 12550.529 |
| 10/3/01 | 12600.829 | 12560.154 |
| 10/4/01 | 12600.829 | 12560.154 |
| 10/5/01 | 12612.595 | 12569.779 |
| 10/8/01 | 12612.595 | 12569.779 |
| 10/9/01 | 12565.533 | 12531.28 |
| 10/10/01 | 12542.002 | 12512.031 |
| 10/11/01 | 12483.174 | 12463.908 |
| 10/12/01 | 12506.705 | 12483.157 |
| 10/15/01 | 12542.002 | 12512.031 |
| 10/16/01 | 12577.298 | 12540.905 |
| 10/17/01 | 12577.298 | 12540.905 |
| 10/18/01 | 12589.064 | 12550.529 |
| 10/19/01 | 12565.533 | 12531.28 |
| 10/22/01 | 12542.002 | 12512.031 |
| 10/23/01 | 12530.236 | 12502.406 |
| 10/24/01 | 12589.064 | 12550.529 |
| 10/25/01 | 12636.126 | 12589.028 |
| 10/26/01 | 12659.657 | 12608.277 |
| 10/29/01 | 12694.953 | 12637.151 |
| 10/30/01 | 12765.546 | 12694.899 |
| 10/31/01 | 12836.139 | 12752.647 |
| 11/1/01 | 12847.904 | 12762.271 |
| 11/2/01 | 12789.077 | 12714.148 |
| 11/5/01 | 12824.373 | 12743.022 |
| 11/6/01 | 12847.904 | 12762.271 |
| 11/7/01 | 12883.201 | 12791.145 |
| 11/8/01 | 12800.842 | 12723.773 |
| 11/9/01 | 12800.842 | 12723.773 |
| 11/12/01 | 12800.842 | 12723.773 |
| 11/13/01 | 12777.311 | 12704.524 |
| 11/14/01 | 12659.657 | 12608.277 |
| 11/15/01 | 12494.94 | 12473.532 |
| 11/16/01 | 13565.598 | 13349.374 |
| 11/19/01 | 12459.643 | 12444.658 |
| 11/20/01 | 12436.112 | 12425.409 |
| 11/21/01 | 12389.05 | 12386.91 |
| 11/23/01 | 12389.05 | 12386.91 |
| 11/26/01 | 12353.754 | 12358.037 |
| 11/27/01 | 12389.05 | 12386.91 |
| 11/28/01 | 12400.816 | 12396.535 |
| 11/29/01 | 12483.174 | 12463.908 |
| 11/30/01 | 12483.174 | 12463.908 |
| 12/3/01 | 12506.705 | 12483.157 |
| 12/4/01 | 12518.471 | 12492.782 |
| 12/5/01 | 12424.347 | 12415.784 |
| 12/6/01 | 12377.285 | 12377.286 |
| 12/7/01 | 12341.989 | 12348.412 |
| 12/10/01 | 12365.52 | 12367.661 |
| 12/11/01 | 12400.816 | 12396.535 |
| 12/12/01 | 12436.112 | 12425.409 |
| 12/13/01 | 12389.05 | 12386.91 |
| 12/14/01 | 12353.754 | 12358.037 |
| 12/17/01 | 12341.989 | 12348.412 |
| 12/18/01 | 12377.285 | 12377.286 |
| 12/19/01 | 12400.816 | 12396.535 |
| 12/20/01 | 12389.05 | 12386.91 |
| 12/21/01 | 12377.285 | 12377.286 |
| 12/24/01 | 12377.285 | 12377.286 |
| 12/26/01 | 12341.989 | 12348.412 |
| 12/27/01 | 12377.285 | 12377.286 |
| 12/28/01 | 12345.172 | 12377.286 |
| 12/31/01 | 12380.886 | 12406.16 |
| 1/2/02 | 12333.268 | 12367.661 |
| 1/3/02 | 12345.172 | 12377.286 |
| 1/4/02 | 12345.172 | 12377.286 |
| 1/7/02 | 12392.791 | 12415.784 |
| 1/8/02 | 12392.791 | 12415.784 |
| 1/9/02 | 12404.696 | 12425.409 |
| 1/10/02 | 12440.41 | 12454.283 |
| 1/11/02 | 12476.124 | 12483.157 |
| 1/14/02 | 12499.933 | 12502.406 |
| 1/15/02 | 12499.933 | 12502.406 |
| 1/16/02 | 12499.933 | 12502.406 |
| 1/17/02 | 12464.219 | 12473.532 |
| 1/18/02 | 12476.124 | 12483.157 |
| 1/22/02 | 12476.124 | 12483.157 |
| 1/23/02 | 12440.41 | 12454.283 |
| 1/24/02 | 12416.601 | 12435.034 |
| 1/25/02 | 12404.696 | 12425.409 |
| 1/28/02 | 12404.696 | 12425.409 |
| 1/29/02 | 12452.315 | 12463.908 |
| 1/30/02 | 12464.219 | 12473.532 |
| 1/31/02 | 12428.505 | 12444.658 |
| 2/1/02 | 12452.315 | 12463.908 |
| 2/4/02 | 12488.029 | 12492.782 |
| 2/5/02 | 12488.029 | 12492.782 |
| 2/6/02 | 12488.029 | 12492.782 |
| 2/7/02 | 12488.029 | 12492.782 |
| 2/8/02 | 12511.838 | 12512.031 |
| 2/11/02 | 12511.838 | 12512.031 |
| 2/12/02 | 12488.029 | 12492.782 |
| 2/13/02 | 12476.124 | 12483.157 |
| 2/14/02 | 12488.029 | 12492.782 |
| 2/15/02 | 12511.838 | 12512.031 |
| 2/19/02 | 12511.838 | 12512.031 |
| 2/20/02 | 12523.743 | 12521.655 |
| 2/21/02 | 12523.743 | 12521.655 |
| 2/22/02 | 12535.648 | 12531.28 |
| 2/25/02 | 12523.743 | 12521.655 |
| 2/26/02 | 12499.933 | 12502.406 |
| 2/27/02 | 12535.648 | 12531.28 |
| 2/28/02 | 12523.743 | 12521.655 |
| 3/1/02 | 12488.029 | 12492.782 |
| 3/4/02 | 12488.029 | 12492.782 |
| 3/5/02 | 12476.124 | 12483.157 |
| 3/6/02 | 12464.219 | 12473.532 |
| 3/7/02 | 12404.696 | 12425.409 |
| 3/8/02 | 12357.077 | 12386.91 |
| 3/11/02 | 12368.982 | 12396.535 |
| 3/12/02 | 12380.886 | 12406.16 |
| 3/13/02 | 12404.696 | 12425.409 |
| 3/14/02 | 12345.172 | 12377.286 |
| 3/15/02 | 12357.077 | 12386.91 |
| 3/18/02 | 12368.982 | 12396.535 |
| 3/19/02 | 12357.077 | 12386.91 |
| 3/20/02 | 12333.268 | 12367.661 |
| 3/21/02 | 12315.027 | 12367.661 |
| 3/22/02 | 12315.027 | 12367.661 |
| 3/25/02 | 12303.048 | 12358.037 |
| 3/26/02 | 12327.007 | 12377.286 |
| 3/27/02 | 12338.986 | 12386.91 |
| 3/28/02 | 12315.027 | 12367.661 |
| 4/1/02 | 12315.027 | 12367.661 |
| 4/2/02 | 12350.966 | 12396.535 |
| 4/3/02 | 12374.925 | 12415.784 |
| 4/4/02 | 12374.925 | 12415.784 |
| 4/5/02 | 12398.884 | 12435.034 |
| 4/8/02 | 12398.884 | 12435.034 |
| 4/9/02 | 12410.864 | 12444.658 |
| 4/10/02 | 12422.844 | 12454.283 |
| 4/11/02 | 12422.844 | 12454.283 |
| 4/12/02 | 12446.803 | 12473.532 |
| 4/15/02 | 12458.782 | 12483.157 |
| 4/16/02 | 12446.803 | 12473.532 |
| 4/17/02 | 12446.803 | 12473.532 |
| 4/18/02 | 12446.803 | 12473.532 |
| 4/19/02 | 12446.803 | 12473.532 |
| 4/22/02 | 12458.782 | 12483.157 |
| 4/23/02 | 12458.782 | 12483.157 |
| 4/24/02 | 12482.742 | 12502.406 |
| 4/25/02 | 12494.721 | 12512.031 |
| 4/26/02 | 12506.701 | 12521.655 |
| 4/29/02 | 12494.721 | 12512.031 |
| 4/30/02 | 12506.701 | 12521.655 |
| 5/1/02 | 12506.701 | 12521.655 |
| 5/2/02 | 12506.701 | 12521.655 |
| 5/3/02 | 12518.68 | 12531.28 |
| 5/6/02 | 12518.68 | 12531.28 |
| 5/7/02 | 12530.66 | 12540.905 |
| 5/8/02 | 12470.762 | 12492.782 |
| 5/9/02 | 12494.721 | 12512.031 |
| 5/10/02 | 12518.68 | 12531.28 |
| 5/13/02 | 12494.721 | 12512.031 |
| 5/14/02 | 12458.782 | 12483.157 |
| 5/15/02 | 12482.742 | 12502.406 |
| 5/16/02 | 12506.701 | 12521.655 |
| 5/17/02 | 12482.742 | 12502.406 |
| 5/20/02 | 12506.701 | 12521.655 |
| 5/21/02 | 12530.66 | 12540.905 |
| 5/22/02 | 12542.64 | 12550.529 |
| 5/23/02 | 12530.66 | 12540.905 |
| 5/24/02 | 12530.66 | 12540.905 |
| 5/28/02 | 12542.64 | 12550.529 |
| 5/29/02 | 12554.619 | 12560.154 |
| 5/30/02 | 12578.578 | 12579.403 |
| 5/31/02 | 12566.599 | 12569.779 |
| 6/3/02 | 12578.578 | 12579.403 |
| 6/4/02 | 12602.538 | 12598.653 |
| 6/5/02 | 12590.558 | 12589.028 |
| 6/6/02 | 12602.538 | 12598.653 |
| 6/7/02 | 12590.558 | 12589.028 |
| 6/10/02 | 12590.558 | 12589.028 |
| 6/11/02 | 12614.517 | 12608.277 |
| 6/12/02 | 12626.497 | 12617.902 |
| 6/13/02 | 12638.476 | 12627.526 |
| 6/14/02 | 12638.476 | 12627.526 |
| 6/17/02 | 12662.436 | 12646.776 |
| 6/18/02 | 12674.415 | 12656.4 |
| 6/19/02 | 12710.354 | 12685.274 |
| 6/20/02 | 12674.415 | 12656.4 |
| 6/21/02 | 12698.374 | 12675.65 |
| 6/24/02 | 12686.395 | 12666.025 |
| 6/25/02 | 12686.395 | 12666.025 |
| 6/26/02 | 12734.313 | 12704.524 |
| 6/27/02 | 12638.476 | 12627.526 |
| 6/28/02 | 12684.245 | 12675.65 |
| 7/1/02 | 12696.279 | 12685.274 |
| 7/2/02 | 12732.382 | 12714.148 |
| 7/3/02 | 12732.382 | 12714.148 |
| 7/5/02 | 12732.382 | 12714.148 |
| 7/8/02 | 12708.313 | 12694.899 |
| 7/9/02 | 12744.417 | 12723.773 |
| 7/10/02 | 12780.52 | 12752.647 |
| 7/11/02 | 12792.554 | 12762.271 |
| 7/12/02 | 12804.588 | 12771.896 |
| 7/15/02 | 12804.588 | 12771.896 |
| 7/16/02 | 12768.485 | 12743.022 |
| 7/17/02 | 12780.52 | 12752.647 |
| 7/18/02 | 12816.623 | 12781.521 |
| 7/19/02 | 12828.657 | 12791.145 |
| 7/22/02 | 12876.795 | 12829.644 |
| 7/23/02 | 12900.864 | 12848.893 |
| 7/24/02 | 12912.898 | 12858.518 |
| 7/25/02 | 12924.932 | 12868.142 |
| 7/26/02 | 12936.967 | 12877.767 |
| 7/29/02 | 12876.795 | 12829.644 |
| 7/30/02 | 12864.76 | 12820.019 |
| 7/31/02 | 12924.932 | 12868.142 |
| 8/1/02 | 12961.036 | 12897.016 |
| 8/2/02 | 13021.207 | 12945.14 |
| 8/5/02 | 13057.311 | 12974.013 |
| 8/6/02 | 12997.139 | 12925.89 |
| 8/7/02 | 13045.276 | 12964.389 |
| 8/8/02 | 13009.173 | 12935.515 |
| 8/9/02 | 13021.207 | 12945.14 |
| 8/12/02 | 13021.207 | 12945.14 |
| 8/13/02 | 13057.311 | 12974.013 |
| 8/14/02 | 13033.242 | 12954.764 |
| 8/15/02 | 12997.139 | 12925.89 |
| 8/16/02 | 12973.07 | 12906.641 |
| 8/19/02 | 12973.07 | 12906.641 |
| 8/20/02 | 13021.207 | 12945.14 |
| 8/21/02 | 13021.207 | 12945.14 |
| 8/22/02 | 12985.104 | 12916.266 |
| 8/23/02 | 13009.173 | 12935.515 |
| 8/26/02 | 13009.173 | 12935.515 |
| 8/27/02 | 12997.139 | 12925.89 |
| 8/28/02 | 13009.173 | 12935.515 |
| 8/29/02 | 13033.242 | 12954.764 |
| 8/30/02 | 13045.276 | 12964.389 |
| 9/3/02 | 13105.448 | 13012.512 |
| 9/4/02 | 13105.448 | 13012.512 |
| 9/5/02 | 13129.517 | 13031.761 |
| 9/6/02 | 13081.379 | 12993.263 |
| 9/9/02 | 13069.345 | 12983.638 |
| 9/10/02 | 13081.379 | 12993.263 |
| 9/11/02 | 13045.276 | 12964.389 |
| 9/12/02 | 13081.379 | 12993.263 |
| 9/13/02 | 13093.414 | 13002.887 |
| 9/16/02 | 13093.414 | 13002.887 |
| 9/17/02 | 13105.448 | 13012.512 |
| 9/18/02 | 13105.448 | 13012.512 |
| 9/19/02 | 13129.517 | 13031.761 |
| 9/20/02 | 13129.517 | 13031.761 |
| 9/23/02 | 13153.586 | 13051.011 |
| 9/24/02 | 13153.586 | 13051.011 |
| 9/25/02 | 13129.517 | 13031.761 |
| 9/26/02 | 13127.093 | 13041.386 |
| 9/27/02 | 13151.268 | 13060.635 |
| 9/30/02 | 13199.618 | 13099.134 |
| 10/1/02 | 13163.356 | 13070.26 |
| 10/2/02 | 13175.443 | 13079.885 |
| 10/3/02 | 13175.443 | 13079.885 |
| 10/4/02 | 13163.356 | 13070.26 |
| 10/7/02 | 13175.443 | 13079.885 |
| 10/8/02 | 13175.443 | 13079.885 |
| 10/9/02 | 13211.706 | 13108.758 |
| 10/10/02 | 13199.618 | 13099.134 |
| 10/11/02 | 13163.356 | 13070.26 |
| 10/14/02 | 13163.356 | 13070.26 |
| 10/15/02 | 13102.918 | 13022.137 |
| 10/16/02 | 13102.918 | 13022.137 |
| 10/17/02 | 13090.83 | 13012.512 |
| 10/18/02 | 13090.83 | 13012.512 |
| 10/21/02 | 13078.743 | 13002.887 |
| 10/22/02 | 13078.743 | 13002.887 |
| 10/23/02 | 13078.743 | 13002.887 |
| 10/24/02 | 13090.83 | 13012.512 |
| 10/25/02 | 13102.918 | 13022.137 |
| 10/28/02 | 13115.005 | 13031.761 |
| 10/29/02 | 13127.093 | 13041.386 |
| 10/30/02 | 13127.093 | 13041.386 |
| 10/31/02 | 13139.18 | 13051.011 |
| 11/1/02 | 13127.093 | 13041.386 |
| 11/4/02 | 13127.093 | 13041.386 |
| 11/5/02 | 13115.005 | 13031.761 |
| 11/6/02 | 13115.005 | 13031.761 |
| 11/7/02 | 13127.093 | 13041.386 |
| 11/8/02 | 13127.093 | 13041.386 |
| 11/11/02 | 13127.093 | 13041.386 |
| 11/12/02 | 13139.18 | 13051.011 |
| 11/13/02 | 13139.18 | 13051.011 |
| 11/14/02 | 13115.005 | 13031.761 |
| 11/15/02 | 13115.005 | 13031.761 |
| 11/18/02 | 13115.005 | 13031.761 |
| 11/19/02 | 13115.005 | 13031.761 |
| 11/20/02 | 13102.918 | 13022.137 |
| 11/21/02 | 13102.918 | 13022.137 |
| 11/22/02 | 13102.918 | 13022.137 |
| 11/25/02 | 13102.918 | 13022.137 |
| 11/26/02 | 13115.005 | 13031.761 |
| 11/27/02 | 13078.743 | 13002.887 |
| 11/29/02 | 13078.743 | 13002.887 |
| 12/2/02 | 13090.83 | 13012.512 |
| 12/3/02 | 13090.83 | 13012.512 |
| 12/4/02 | 13102.918 | 13022.137 |
| 12/5/02 | 13115.005 | 13031.761 |
| 12/6/02 | 13127.093 | 13041.386 |
| 12/9/02 | 13139.18 | 13051.011 |
| 12/10/02 | 13139.18 | 13051.011 |
| 12/11/02 | 13139.18 | 13051.011 |
| 12/12/02 | 13139.18 | 13051.011 |
| 12/13/02 | 13139.18 | 13051.011 |
| 12/16/02 | 13127.093 | 13041.386 |
| 12/17/02 | 13139.18 | 13051.011 |
| 12/18/02 | 13163.356 | 13070.26 |
| 12/19/02 | 13175.443 | 13079.885 |
| 12/20/02 | 13155.853 | 13075.072 |
| 12/23/02 | 13155.853 | 13075.072 |
| 12/24/02 | 13155.853 | 13075.072 |
| 12/26/02 | 13180.126 | 13094.321 |
| 12/27/02 | 13192.262 | 13103.946 |
| 12/30/02 | 13204.399 | 13113.571 |
| 12/31/02 | 13204.399 | 13113.571 |
| 1/2/03 | 13167.99 | 13084.697 |
| 1/3/03 | 13155.853 | 13075.072 |
| 1/6/03 | 13155.853 | 13075.072 |
| 1/7/03 | 13167.99 | 13084.697 |
| 1/8/03 | 13167.99 | 13084.697 |
| 1/9/03 | 13143.717 | 13065.448 |
| 1/10/03 | 13155.853 | 13075.072 |
| 1/13/03 | 13155.853 | 13075.072 |
| 1/14/03 | 13167.99 | 13084.697 |
| 1/15/03 | 13167.99 | 13084.697 |
| 1/16/03 | 13167.99 | 13084.697 |
| 1/17/03 | 13180.126 | 13094.321 |
| 1/21/03 | 13180.126 | 13094.321 |
| 1/22/03 | 13192.262 | 13103.946 |
| 1/23/03 | 13192.262 | 13103.946 |
| 1/24/03 | 13192.262 | 13103.946 |
| 1/27/03 | 13192.262 | 13103.946 |
| 1/28/03 | 13180.126 | 13094.321 |
| 1/29/03 | 13180.126 | 13094.321 |
| 1/30/03 | 13180.126 | 13094.321 |
| 1/31/03 | 13180.126 | 13094.321 |
| 2/3/03 | 13180.126 | 13094.321 |
| 2/4/03 | 13192.262 | 13103.946 |
| 2/5/03 | 13180.126 | 13094.321 |
| 2/6/03 | 13192.262 | 13103.946 |
| 2/7/03 | 13192.262 | 13103.946 |
| 2/10/03 | 13192.262 | 13103.946 |
| 2/11/03 | 13192.262 | 13103.946 |
| 2/12/03 | 13204.399 | 13113.571 |
| 2/13/03 | 13204.399 | 13113.571 |
| 2/14/03 | 13204.399 | 13113.571 |
| 2/18/03 | 13204.399 | 13113.571 |
| 2/19/03 | 13204.399 | 13113.571 |
| 2/20/03 | 13216.535 | 13123.195 |
| 2/21/03 | 13204.399 | 13113.571 |
| 2/24/03 | 13216.535 | 13123.195 |
| 2/25/03 | 13216.535 | 13123.195 |
| 2/26/03 | 13216.535 | 13123.195 |
| 2/27/03 | 13216.535 | 13123.195 |
| 2/28/03 | 13228.672 | 13132.82 |
| 3/3/03 | 13228.672 | 13132.82 |
| 3/4/03 | 13240.808 | 13142.445 |
| 3/5/03 | 13240.808 | 13142.445 |
| 3/6/03 | 13240.808 | 13142.445 |
| 3/7/03 | 13252.944 | 13152.069 |
| 3/10/03 | 13265.081 | 13161.694 |
| 3/11/03 | 13252.944 | 13152.069 |
| 3/12/03 | 13252.944 | 13152.069 |
| 3/13/03 | 13228.672 | 13132.82 |
| 3/14/03 | 13228.672 | 13132.82 |
| 3/17/03 | 13216.535 | 13123.195 |
| 3/18/03 | 13216.535 | 13123.195 |
| 3/19/03 | 13204.399 | 13113.571 |
| 3/20/03 | 13204.399 | 13113.571 |
| 3/21/03 | 13192.262 | 13103.946 |
| 3/24/03 | 13216.535 | 13123.195 |
| 3/25/03 | 13216.535 | 13123.195 |
| 3/26/03 | 13216.535 | 13123.195 |
| 3/27/03 | 13223.648 | 13132.82 |
| 3/28/03 | 13223.648 | 13132.82 |
| 3/31/03 | 13235.802 | 13142.445 |
| 4/1/03 | 13235.802 | 13142.445 |
| 4/2/03 | 13223.648 | 13132.82 |
| 4/3/03 | 13235.802 | 13142.445 |
| 4/4/03 | 13223.648 | 13132.82 |
| 4/7/03 | 13211.494 | 13123.195 |
| 4/8/03 | 13223.648 | 13132.82 |
| 4/9/03 | 13235.802 | 13142.445 |
| 4/10/03 | 13223.648 | 13132.82 |
| 4/11/03 | 13223.648 | 13132.82 |
| 4/14/03 | 13211.494 | 13123.195 |
| 4/15/03 | 13211.494 | 13123.195 |
| 4/16/03 | 13223.648 | 13132.82 |
| 4/17/03 | 13211.494 | 13123.195 |
| 4/21/03 | 13211.494 | 13123.195 |
| 4/22/03 | 13211.494 | 13123.195 |
| 4/23/03 | 13211.494 | 13123.195 |
| 4/24/03 | 13223.648 | 13132.82 |
| 4/25/03 | 13235.802 | 13142.445 |
| 4/28/03 | 13235.802 | 13142.445 |
| 4/29/03 | 13223.648 | 13132.82 |
| 4/30/03 | 13223.648 | 13132.82 |
| 5/1/03 | 13223.648 | 13132.82 |
| 5/2/03 | 13223.648 | 13132.82 |
| 5/5/03 | 13235.802 | 13142.445 |
| 5/6/03 | 13247.956 | 13152.069 |
| 5/7/03 | 13247.956 | 13152.069 |
| 5/8/03 | 13247.956 | 13152.069 |
| 5/9/03 | 13247.956 | 13152.069 |
| 5/12/03 | 13247.956 | 13152.069 |
| 5/13/03 | 13247.956 | 13152.069 |
| 5/14/03 | 13260.11 | 13161.694 |
| 5/15/03 | 13247.956 | 13152.069 |
| 5/16/03 | 13260.11 | 13161.694 |
| 5/19/03 | 13260.11 | 13161.694 |
| 5/20/03 | 13260.11 | 13161.694 |
| 5/21/03 | 13260.11 | 13161.694 |
| 5/22/03 | 13260.11 | 13161.694 |
| 5/23/03 | 13260.11 | 13161.694 |
| 5/27/03 | 13260.11 | 13161.694 |
| 5/28/03 | 13260.11 | 13161.694 |
| 5/29/03 | 13260.11 | 13161.694 |
| 5/30/03 | 13260.11 | 13161.694 |
| 6/2/03 | 13260.11 | 13161.694 |
| 6/3/03 | 13272.264 | 13171.319 |
| 6/4/03 | 13284.419 | 13180.943 |
| 6/5/03 | 13272.264 | 13171.319 |
| 6/6/03 | 13272.264 | 13171.319 |
| 6/9/03 | 13284.419 | 13180.943 |
| 6/10/03 | 13296.573 | 13190.568 |
| 6/11/03 | 13296.573 | 13190.568 |
| 6/12/03 | 13296.573 | 13190.568 |
| 6/13/03 | 13296.573 | 13190.568 |
| 6/16/03 | 13296.573 | 13190.568 |
| 6/17/03 | 13284.419 | 13180.943 |
| 6/18/03 | 13284.419 | 13180.943 |
| 6/19/03 | 13296.573 | 13190.568 |
| 6/20/03 | 13284.419 | 13180.943 |
| 6/23/03 | 13296.573 | 13190.568 |
| 6/24/03 | 13296.573 | 13190.568 |
| 6/25/03 | 13284.419 | 13180.943 |
| 6/26/03 | 13303.668 | 13200.192 |
| 6/27/03 | 13303.668 | 13200.192 |
| 6/30/03 | 13267.153 | 13171.319 |
| 7/1/03 | 13267.153 | 13171.319 |
| 7/2/03 | 13267.153 | 13171.319 |
| 7/3/03 | 13267.153 | 13171.319 |
| 7/7/03 | 13267.153 | 13171.319 |
| 7/8/03 | 13254.981 | 13161.694 |
| 7/9/03 | 13254.981 | 13161.694 |
| 7/10/03 | 13267.153 | 13171.319 |
| 7/11/03 | 13267.153 | 13171.319 |
| 7/14/03 | 13267.153 | 13171.319 |
| 7/15/03 | 13254.981 | 13161.694 |
| 7/16/03 | 13242.809 | 13152.069 |
| 7/17/03 | 13254.981 | 13161.694 |
| 7/18/03 | 13242.809 | 13152.069 |
| 7/21/03 | 13230.638 | 13142.445 |
| 7/22/03 | 13242.809 | 13152.069 |
| 7/23/03 | 13242.809 | 13152.069 |
| 7/24/03 | 13242.809 | 13152.069 |
| 7/25/03 | 13242.809 | 13152.069 |
| 7/28/03 | 13242.809 | 13152.069 |
| 7/29/03 | 13230.638 | 13142.445 |
| 7/30/03 | 13230.638 | 13142.445 |
| 7/31/03 | 13218.466 | 13132.82 |
| 8/1/03 | 13206.294 | 13123.195 |
| 8/4/03 | 13218.466 | 13132.82 |
| 8/5/03 | 13206.294 | 13123.195 |
| 8/6/03 | 13218.466 | 13132.82 |
| 8/7/03 | 13218.466 | 13132.82 |
| 8/8/03 | 13218.466 | 13132.82 |
| 8/11/03 | 13218.466 | 13132.82 |
| 8/12/03 | 13218.466 | 13132.82 |
| 8/13/03 | 13218.466 | 13132.82 |
| 8/14/03 | 13218.466 | 13132.82 |
| 8/15/03 | 13218.466 | 13132.82 |
| 8/18/03 | 13218.466 | 13132.82 |
| 8/19/03 | 13218.466 | 13132.82 |
| 8/20/03 | 13206.294 | 13123.195 |
| 8/21/03 | 13194.123 | 13113.571 |
| 8/22/03 | 13194.123 | 13113.571 |
| 8/25/03 | 13194.123 | 13113.571 |
| 8/26/03 | 13194.123 | 13113.571 |
| 8/27/03 | 13194.123 | 13113.571 |
| 8/28/03 | 13206.294 | 13123.195 |
| 8/29/03 | 13194.123 | 13113.571 |
| 9/2/03 | 13194.123 | 13113.571 |
| 9/3/03 | 13194.123 | 13113.571 |
| 9/4/03 | 13206.294 | 13123.195 |
| 9/5/03 | 13206.294 | 13123.195 |
| 9/8/03 | 13206.294 | 13123.195 |
| 9/9/03 | 13206.294 | 13123.195 |
| 9/10/03 | 13206.294 | 13123.195 |
| 9/11/03 | 13206.294 | 13123.195 |
| 9/12/03 | 13206.294 | 13123.195 |
| 9/15/03 | 13206.294 | 13123.195 |
| 9/16/03 | 13206.294 | 13123.195 |
| 9/17/03 | 13206.294 | 13123.195 |
| 9/18/03 | 13206.294 | 13123.195 |
| 9/19/03 | 13206.294 | 13123.195 |
| 9/22/03 | 13206.294 | 13123.195 |
| 9/23/03 | 13206.294 | 13123.195 |
| 9/24/03 | 13206.294 | 13123.195 |
| 9/25/03 | 13201.2 | 13123.195 |
| 9/26/03 | 13201.2 | 13123.195 |
| 9/29/03 | 13201.2 | 13123.195 |
| 9/30/03 | 13213.39 | 13132.82 |
| 10/1/03 | 13213.39 | 13132.82 |
| 10/2/03 | 13213.39 | 13132.82 |
| 10/3/03 | 13201.2 | 13123.195 |
| 10/6/03 | 13201.2 | 13123.195 |
| 10/7/03 | 13201.2 | 13123.195 |
| 10/8/03 | 13201.2 | 13123.195 |
| 10/9/03 | 13201.2 | 13123.195 |
| 10/10/03 | 13201.2 | 13123.195 |
| 10/13/03 | 13176.821 | 13103.946 |
| 10/14/03 | 13164.632 | 13094.321 |
| 10/15/03 | 13140.253 | 13075.072 |
| 10/16/03 | 13115.874 | 13055.823 |
| 10/17/03 | 13115.874 | 13055.823 |
| 10/20/03 | 13128.063 | 13065.448 |
| 10/21/03 | 13128.063 | 13065.448 |
| 10/22/03 | 13140.253 | 13075.072 |
| 10/23/03 | 13140.253 | 13075.072 |
| 10/24/03 | 13140.253 | 13075.072 |
| 10/27/03 | 13140.253 | 13075.072 |
| 10/28/03 | 13152.442 | 13084.697 |
| 10/29/03 | 13140.253 | 13075.072 |
| 10/30/03 | 13128.063 | 13065.448 |
| 10/31/03 | 13128.063 | 13065.448 |
| 11/3/03 | 13128.063 | 13065.448 |
| 11/4/03 | 13128.063 | 13065.448 |
| 11/5/03 | 13115.874 | 13055.823 |
| 11/6/03 | 13115.874 | 13055.823 |
| 11/7/03 | 13115.874 | 13055.823 |
| 11/10/03 | 13103.684 | 13046.198 |
| 11/11/03 | 13115.874 | 13055.823 |
| 11/12/03 | 13115.874 | 13055.823 |
| 11/13/03 | 13140.253 | 13075.072 |
| 11/14/03 | 13152.442 | 13084.697 |
| 11/17/03 | 13164.632 | 13094.321 |
| 11/18/03 | 13164.632 | 13094.321 |
| 11/19/03 | 13152.442 | 13084.697 |
| 11/20/03 | 13164.632 | 13094.321 |
| 11/21/03 | 13152.442 | 13084.697 |
| 11/24/03 | 13152.442 | 13084.697 |
| 11/25/03 | 13164.632 | 13094.321 |
| 11/26/03 | 13152.442 | 13084.697 |
| 11/28/03 | 13128.063 | 13065.448 |
| 12/1/03 | 13128.063 | 13065.448 |
| 12/2/03 | 13140.253 | 13075.072 |
| 12/3/03 | 13128.063 | 13065.448 |
| 12/4/03 | 13140.253 | 13075.072 |
| 12/5/03 | 13164.632 | 13094.321 |
| 12/8/03 | 13164.632 | 13094.321 |
| 12/9/03 | 13152.442 | 13084.697 |
| 12/10/03 | 13164.632 | 13094.321 |
| 12/11/03 | 13189.011 | 13113.571 |
| 12/12/03 | 13164.632 | 13094.321 |
| 12/15/03 | 13176.821 | 13103.946 |
| 12/16/03 | 13176.821 | 13103.946 |
| 12/17/03 | 13176.821 | 13103.946 |
| 12/18/03 | 13176.821 | 13103.946 |
| 12/19/03 | 13176.821 | 13103.946 |
| 12/22/03 | 13176.821 | 13103.946 |
| 12/23/03 | 13164.632 | 13094.321 |
| 12/24/03 | 13164.632 | 13094.321 |
| 12/26/03 | 13176.821 | 13103.946 |
| 12/29/03 | 13176.821 | 13103.946 |
| 12/30/03 | 13133.536 | 13099.134 |
| 12/31/03 | 13145.857 | 13108.758 |
| 1/2/04 | 13121.216 | 13089.509 |
| 1/5/04 | 13121.216 | 13089.509 |
| 1/6/04 | 13133.536 | 13099.134 |
| 1/7/04 | 13145.857 | 13108.758 |
| 1/8/04 | 13133.536 | 13099.134 |
| 1/9/04 | 13145.857 | 13108.758 |
| 1/12/04 | 13158.177 | 13118.383 |
| 1/13/04 | 13158.177 | 13118.383 |
| 1/14/04 | 13158.177 | 13118.383 |
| 1/15/04 | 13158.177 | 13118.383 |
| 1/16/04 | 13145.857 | 13108.758 |
| 1/20/04 | 13145.857 | 13108.758 |
| 1/21/04 | 13158.177 | 13118.383 |
| 1/22/04 | 13158.177 | 13118.383 |
| 1/23/04 | 13145.857 | 13108.758 |
| 1/26/04 | 13145.857 | 13108.758 |
| 1/27/04 | 13145.857 | 13108.758 |
| 1/28/04 | 13133.536 | 13099.134 |
| 1/29/04 | 13133.536 | 13099.134 |
| 1/30/04 | 13133.536 | 13099.134 |
| 2/2/04 | 13145.857 | 13108.758 |
| 2/3/04 | 13158.177 | 13118.383 |
| 2/4/04 | 13158.177 | 13118.383 |
| 2/5/04 | 13133.536 | 13099.134 |
| 2/6/04 | 13145.857 | 13108.758 |
| 2/9/04 | 13158.177 | 13118.383 |
| 2/10/04 | 13145.857 | 13108.758 |
| 2/11/04 | 13170.497 | 13128.008 |
| 2/12/04 | 13158.177 | 13118.383 |
| 2/13/04 | 13170.497 | 13128.008 |
| 2/17/04 | 13170.497 | 13128.008 |
| 2/18/04 | 13170.497 | 13128.008 |
| 2/19/04 | 13170.497 | 13128.008 |
| 2/20/04 | 13158.177 | 13118.383 |
| 2/23/04 | 13182.818 | 13137.632 |
| 2/24/04 | 13182.818 | 13137.632 |
| 2/25/04 | 13182.818 | 13137.632 |
| 2/26/04 | 13182.818 | 13137.632 |
| 2/27/04 | 13182.818 | 13137.632 |
| 3/1/04 | 13182.818 | 13137.632 |
| 3/2/04 | 13170.497 | 13128.008 |
| 3/3/04 | 13170.497 | 13128.008 |
| 3/4/04 | 13170.497 | 13128.008 |
| 3/5/04 | 13195.138 | 13147.257 |
| 3/8/04 | 13219.779 | 13166.506 |
| 3/9/04 | 13219.779 | 13166.506 |
| 3/10/04 | 13207.459 | 13156.882 |
| 3/11/04 | 13219.779 | 13166.506 |
| 3/12/04 | 13207.459 | 13156.882 |
| 3/15/04 | 13207.459 | 13156.882 |
| 3/16/04 | 13219.779 | 13166.506 |
| 3/17/04 | 13219.779 | 13166.506 |
| 3/18/04 | 13207.459 | 13156.882 |
| 3/19/04 | 13207.459 | 13156.882 |
| 3/22/04 | 13219.779 | 13166.506 |
| 3/23/04 | 13219.779 | 13166.506 |
| 3/24/04 | 13219.779 | 13166.506 |
| 3/25/04 | 13219.779 | 13166.506 |
| 3/26/04 | 13207.459 | 13156.882 |
| 3/29/04 | 13207.459 | 13156.882 |
| 3/30/04 | 13195.138 | 13147.257 |
| 3/31/04 | 13207.459 | 13156.882 |
| 4/1/04 | 13195.138 | 13147.257 |
| 4/2/04 | 13158.177 | 13118.383 |
| 4/5/04 | 13158.177 | 13118.383 |
| 4/6/04 | 13158.177 | 13118.383 |
| 4/7/04 | 13158.177 | 13118.383 |
| 4/8/04 | 13158.177 | 13118.383 |
| 4/12/04 | 13158.177 | 13118.383 |
| 4/13/04 | 13145.857 | 13108.758 |
| 4/14/04 | 13133.536 | 13099.134 |
| 4/15/04 | 13133.536 | 13099.134 |
| 4/16/04 | 13133.536 | 13099.134 |
| 4/19/04 | 13133.536 | 13099.134 |
| 4/20/04 | 13133.536 | 13099.134 |
| 4/21/04 | 13121.216 | 13089.509 |
| 4/22/04 | 13121.216 | 13089.509 |
| 4/23/04 | 13121.216 | 13089.509 |
| 4/26/04 | 13108.896 | 13079.885 |
| 4/27/04 | 13108.896 | 13079.885 |
| 4/28/04 | 13108.896 | 13079.885 |
| 4/29/04 | 13096.575 | 13070.26 |
| 4/30/04 | 13096.575 | 13070.26 |
| 5/3/04 | 13096.575 | 13070.26 |
| 5/4/04 | 13096.575 | 13070.26 |
| 5/5/04 | 13096.575 | 13070.26 |
| 5/6/04 | 13096.575 | 13070.26 |
| 5/7/04 | 13047.294 | 13031.761 |
| 5/10/04 | 13059.614 | 13041.386 |
| 5/11/04 | 13059.614 | 13041.386 |
| 5/12/04 | 13059.614 | 13041.386 |
| 5/13/04 | 13059.614 | 13041.386 |
| 5/14/04 | 13059.614 | 13041.386 |
| 5/17/04 | 13084.255 | 13060.635 |
| 5/18/04 | 13084.255 | 13060.635 |
| 5/19/04 | 13071.934 | 13051.011 |
| 5/20/04 | 13071.934 | 13051.011 |
| 5/21/04 | 13071.934 | 13051.011 |
| 5/24/04 | 13071.934 | 13051.011 |
| 5/25/04 | 13084.255 | 13060.635 |
| 5/26/04 | 13096.575 | 13070.26 |
| 5/27/04 | 13096.575 | 13070.26 |
| 5/28/04 | 13084.255 | 13060.635 |
| 6/1/04 | 13084.255 | 13060.635 |
| 6/2/04 | 13084.255 | 13060.635 |
| 6/3/04 | 13084.255 | 13060.635 |
| 6/4/04 | 13071.934 | 13051.011 |
| 6/7/04 | 13084.255 | 13060.635 |
| 6/8/04 | 13071.934 | 13051.011 |
| 6/9/04 | 13059.614 | 13041.386 |
| 6/10/04 | 13059.614 | 13041.386 |
| 6/14/04 | 13047.294 | 13031.761 |
| 6/15/04 | 13059.614 | 13041.386 |
| 6/16/04 | 13059.614 | 13041.386 |
| 6/17/04 | 13059.614 | 13041.386 |
| 6/18/04 | 13059.614 | 13041.386 |
| 6/21/04 | 13071.934 | 13051.011 |
| 6/22/04 | 13071.934 | 13051.011 |
| 6/23/04 | 13071.934 | 13051.011 |
| 6/24/04 | 13071.934 | 13051.011 |
| 6/25/04 | 13071.934 | 13051.011 |
| 6/28/04 | 13059.614 | 13041.386 |
| 6/29/04 | 13071.934 | 13051.011 |
| 6/30/04 | 13084.255 | 13060.635 |
| 7/1/04 | 13096.575 | 13070.26 |
| 7/2/04 | 13096.575 | 13070.26 |
| 7/6/04 | 13096.575 | 13070.26 |
| 7/7/04 | 13096.575 | 13070.26 |
| 7/8/04 | 13096.575 | 13070.26 |
| 7/9/04 | 13096.575 | 13070.26 |
| 7/12/04 | 13096.575 | 13070.26 |
| 7/13/04 | 13121.216 | 13089.509 |
| 7/14/04 | 13108.896 | 13079.885 |
| 7/15/04 | 13108.896 | 13079.885 |
| 7/16/04 | 13108.896 | 13079.885 |
| 7/19/04 | 13121.216 | 13089.509 |
| 7/20/04 | 13121.216 | 13089.509 |
| 7/21/04 | 13108.896 | 13079.885 |
| 7/22/04 | 13096.575 | 13070.26 |
| 7/23/04 | 13108.896 | 13079.885 |
| 7/26/04 | 13096.575 | 13070.26 |
| 7/27/04 | 13096.575 | 13070.26 |
| 7/28/04 | 13096.575 | 13070.26 |
| 7/29/04 | 13096.575 | 13070.26 |
| 7/30/04 | 13096.575 | 13070.26 |
| 8/2/04 | 13108.896 | 13079.885 |
| 8/3/04 | 13121.216 | 13089.509 |
| 8/4/04 | 13121.216 | 13089.509 |
| 8/5/04 | 13121.216 | 13089.509 |
| 8/6/04 | 13133.536 | 13099.134 |
| 8/9/04 | 13133.536 | 13099.134 |
| 8/10/04 | 13133.536 | 13099.134 |
| 8/11/04 | 13133.536 | 13099.134 |
| 8/12/04 | 13133.536 | 13099.134 |
| 8/13/04 | 13133.536 | 13099.134 |
| 8/16/04 | 13133.536 | 13099.134 |
| 8/17/04 | 13133.536 | 13099.134 |
| 8/18/04 | 13145.857 | 13108.758 |
| 8/19/04 | 13145.857 | 13108.758 |
| 8/20/04 | 13145.857 | 13108.758 |
| 8/23/04 | 13133.536 | 13099.134 |
| 8/24/04 | 13133.536 | 13099.134 |
| 8/25/04 | 13133.536 | 13099.134 |
| 8/26/04 | 13133.536 | 13099.134 |
| 8/27/04 | 13133.536 | 13099.134 |
| 8/30/04 | 13133.536 | 13099.134 |
| 8/31/04 | 13133.536 | 13099.134 |
| 9/1/04 | 13133.536 | 13099.134 |
| 9/2/04 | 13133.536 | 13099.134 |
| 9/3/04 | 13133.536 | 13099.134 |
| 9/7/04 | 13121.216 | 13089.509 |
| 9/8/04 | 13133.536 | 13099.134 |
| 9/9/04 | 13133.536 | 13099.134 |
| 9/10/04 | 13121.216 | 13089.509 |
| 9/13/04 | 13121.216 | 13089.509 |
| 9/14/04 | 13133.536 | 13099.134 |
| 9/15/04 | 13145.857 | 13108.758 |
| 9/16/04 | 13133.536 | 13099.134 |
| 9/17/04 | 13158.177 | 13118.383 |
| 9/20/04 | 13133.536 | 13099.134 |
| 9/21/04 | 13145.857 | 13108.758 |
| 9/22/04 | 13145.857 | 13108.758 |
| 9/23/04 | 13145.857 | 13108.758 |
| 9/24/04 | 13133.536 | 13099.134 |
| 9/27/04 | 13133.536 | 13099.134 |
| 9/28/04 | 13145.857 | 13108.758 |
| 9/29/04 | 13145.857 | 13108.758 |
| 9/30/04 | 13121.216 | 13089.509 |
| 10/1/04 | 13121.216 | 13089.509 |
| 10/4/04 | 13108.896 | 13079.885 |
| 10/5/04 | 13121.216 | 13089.509 |
| 10/6/04 | 13121.216 | 13089.509 |
| 10/7/04 | 13108.896 | 13079.885 |
| 10/8/04 | 13108.896 | 13079.885 |
| 10/11/04 | 13145.857 | 13108.758 |
| 10/12/04 | 13145.857 | 13108.758 |
| 10/13/04 | 13158.177 | 13118.383 |
| 10/14/04 | 13170.497 | 13128.008 |
| 10/15/04 | 13182.818 | 13137.632 |
| 10/18/04 | 13170.497 | 13128.008 |
| 10/19/04 | 13182.818 | 13137.632 |
| 10/20/04 | 13182.818 | 13137.632 |
| 10/21/04 | 13195.138 | 13147.257 |
| 10/22/04 | 13182.818 | 13137.632 |
| 10/25/04 | 13195.138 | 13147.257 |
| 10/26/04 | 13195.138 | 13147.257 |
| 10/27/04 | 13182.818 | 13137.632 |
| 10/28/04 | 13170.497 | 13128.008 |
| 10/29/04 | 13170.497 | 13128.008 |
| 11/1/04 | 13170.497 | 13128.008 |
| 11/2/04 | 13170.497 | 13128.008 |
| 11/3/04 | 13170.497 | 13128.008 |
| 11/4/04 | 13182.818 | 13137.632 |
| 11/5/04 | 13182.818 | 13137.632 |
| 11/8/04 | 13145.857 | 13108.758 |
| 11/9/04 | 13145.857 | 13108.758 |
| 11/10/04 | 13145.857 | 13108.758 |
| 11/11/04 | 13133.536 | 13099.134 |
| 11/12/04 | 13133.536 | 13099.134 |
| 11/15/04 | 13145.857 | 13108.758 |
| 11/16/04 | 13158.177 | 13118.383 |
| 11/17/04 | 13145.857 | 13108.758 |
| 11/18/04 | 13158.177 | 13118.383 |
| 11/19/04 | 13158.177 | 13118.383 |
| 11/22/04 | 13145.857 | 13108.758 |
| 11/23/04 | 13158.177 | 13118.383 |
| 11/24/04 | 13145.857 | 13108.758 |
| 11/26/04 | 13145.857 | 13108.758 |
| 11/29/04 | 13133.536 | 13099.134 |
| 11/30/04 | 13133.536 | 13099.134 |
| 12/1/04 | 13108.896 | 13079.885 |
| 12/2/04 | 13108.896 | 13079.885 |
| 12/3/04 | 13108.896 | 13079.885 |
| 12/6/04 | 13133.536 | 13099.134 |
| 12/7/04 | 13158.177 | 13118.383 |
| 12/8/04 | 13158.177 | 13118.383 |
| 12/9/04 | 13170.497 | 13128.008 |
| 12/10/04 | 13170.497 | 13128.008 |
| 12/13/04 | 13170.497 | 13128.008 |
| 12/14/04 | 13170.497 | 13128.008 |
| 12/15/04 | 13170.497 | 13128.008 |
| 12/16/04 | 13182.818 | 13137.632 |
| 12/17/04 | 13158.177 | 13118.383 |
| 12/20/04 | 13145.857 | 13108.758 |
| 12/21/04 | 13145.857 | 13108.758 |
| 12/22/04 | 13158.177 | 13118.383 |
| 12/23/04 | 13158.177 | 13118.383 |
| 12/27/04 | 13158.177 | 13118.383 |
| 12/28/04 | 13145.857 | 13108.758 |
| 12/29/04 | 13145.857 | 13108.758 |
| 12/30/04 | 13133.536 | 13099.134 |
| 12/31/04 | 13128.332 | 13115.496 |
| 1/3/05 | 13128.332 | 13115.496 |
| 1/4/05 | 13128.332 | 13115.496 |
| 1/5/05 | 13115.924 | 13105.871 |
| 1/6/05 | 13115.924 | 13105.871 |
| 1/7/05 | 13115.924 | 13105.871 |
| 1/10/05 | 13115.924 | 13105.871 |
| 1/11/05 | 13115.924 | 13105.871 |
| 1/12/05 | 13128.332 | 13115.496 |
| 1/13/05 | 13140.741 | 13125.12 |
| 1/14/05 | 13153.149 | 13134.745 |
| 1/18/05 | 13140.741 | 13125.12 |
| 1/19/05 | 13165.558 | 13144.37 |
| 1/20/05 | 13165.558 | 13144.37 |
| 1/21/05 | 13177.967 | 13153.994 |
| 1/24/05 | 13177.967 | 13153.994 |
| 1/25/05 | 13177.967 | 13153.994 |
| 1/26/05 | 13165.558 | 13144.37 |
| 1/27/05 | 13128.332 | 13115.496 |
| 1/28/05 | 13128.332 | 13115.496 |
| 1/31/05 | 13140.741 | 13125.12 |
| 2/1/05 | 13140.741 | 13125.12 |
| 2/2/05 | 13140.741 | 13125.12 |
| 2/3/05 | 13140.741 | 13125.12 |
| 2/4/05 | 13128.332 | 13115.496 |
| 2/7/05 | 13140.741 | 13125.12 |
| 2/8/05 | 13153.149 | 13134.745 |
| 2/9/05 | 13140.741 | 13125.12 |
| 2/10/05 | 13165.558 | 13144.37 |
| 2/11/05 | 13153.149 | 13134.745 |
| 2/14/05 | 13140.741 | 13125.12 |
| 2/15/05 | 13140.741 | 13125.12 |
| 2/16/05 | 13140.741 | 13125.12 |
| 2/17/05 | 13128.332 | 13115.496 |
| 2/18/05 | 13128.332 | 13115.496 |
| 2/22/05 | 13115.924 | 13105.871 |
| 2/23/05 | 13115.924 | 13105.871 |
| 2/24/05 | 13115.924 | 13105.871 |
| 2/25/05 | 13115.924 | 13105.871 |
| 2/28/05 | 13103.515 | 13096.246 |
| 3/1/05 | 13078.698 | 13076.997 |
| 3/2/05 | 13078.698 | 13076.997 |
| 3/3/05 | 13091.106 | 13086.622 |
| 3/4/05 | 13091.106 | 13086.622 |
| 3/7/05 | 13103.515 | 13096.246 |
| 3/8/05 | 13115.924 | 13105.871 |
| 3/9/05 | 13091.106 | 13086.622 |
| 3/10/05 | 13066.289 | 13067.372 |
| 3/11/05 | 13078.698 | 13076.997 |
| 3/14/05 | 13053.88 | 13057.748 |
| 3/15/05 | 13066.289 | 13067.372 |
| 3/16/05 | 13053.88 | 13057.748 |
| 3/17/05 | 13066.289 | 13067.372 |
| 3/18/05 | 13078.698 | 13076.997 |
| 3/21/05 | 13066.289 | 13067.372 |
| 3/22/05 | 13066.289 | 13067.372 |
| 3/23/05 | 13029.063 | 13038.499 |
| 3/24/05 | 13016.654 | 13028.874 |
| 3/28/05 | 13029.063 | 13038.499 |
| 3/29/05 | 13029.063 | 13038.499 |
| 3/30/05 | 13004.246 | 13019.249 |
| 3/31/05 | 13004.246 | 13019.249 |
| 4/1/05 | 13004.246 | 13019.249 |
| 4/4/05 | 13004.246 | 13019.249 |
| 4/5/05 | 13004.246 | 13019.249 |
| 4/6/05 | 12991.837 | 13009.625 |
| 4/7/05 | 12991.837 | 13009.625 |
| 4/8/05 | 12991.837 | 13009.625 |
| 4/11/05 | 12979.429 | 13000 |
| 4/12/05 | 12954.611 | 12980.751 |
| 4/13/05 | 12967.02 | 12990.375 |
| 4/14/05 | 12954.611 | 12980.751 |
| 4/15/05 | 12954.611 | 12980.751 |
| 4/18/05 | 12954.611 | 12980.751 |
| 4/19/05 | 12954.611 | 12980.751 |
| 4/20/05 | 12967.02 | 12990.375 |
| 4/21/05 | 12991.837 | 13009.625 |
| 4/22/05 | 12979.429 | 13000 |
| 4/25/05 | 12991.837 | 13009.625 |
| 4/26/05 | 12979.429 | 13000 |
| 4/27/05 | 12979.429 | 13000 |
| 4/28/05 | 12979.429 | 13000 |
| 4/29/05 | 12991.837 | 13009.625 |
| 5/2/05 | 12967.02 | 12990.375 |
| 5/3/05 | 12979.429 | 13000 |
| 5/4/05 | 12967.02 | 12990.375 |
| 5/5/05 | 12991.837 | 13009.625 |
| 5/6/05 | 12991.837 | 13009.625 |
| 5/9/05 | 12954.611 | 12980.751 |
| 5/10/05 | 12942.203 | 12971.126 |
| 5/11/05 | 12954.611 | 12980.751 |
| 5/12/05 | 12954.611 | 12980.751 |
| 5/13/05 | 12954.611 | 12980.751 |
| 5/16/05 | 12942.203 | 12971.126 |
| 5/17/05 | 12942.203 | 12971.126 |
| 5/18/05 | 12942.203 | 12971.126 |
| 5/19/05 | 12954.611 | 12980.751 |
| 5/20/05 | 12954.611 | 12980.751 |
| 5/23/05 | 12954.611 | 12980.751 |
| 5/24/05 | 12991.837 | 13009.625 |
| 5/25/05 | 12991.837 | 13009.625 |
| 5/26/05 | 13004.246 | 13019.249 |
| 5/27/05 | 13029.063 | 13038.499 |
| 5/31/05 | 13041.472 | 13048.123 |
| 6/1/05 | 13066.289 | 13067.372 |
| 6/2/05 | 13115.924 | 13105.871 |
| 6/3/05 | 13153.149 | 13134.745 |
| 6/6/05 | 13153.149 | 13134.745 |
| 6/7/05 | 13140.741 | 13125.12 |
| 6/8/05 | 13153.149 | 13134.745 |
| 6/9/05 | 13140.741 | 13125.12 |
| 6/10/05 | 13140.741 | 13125.12 |
| 6/13/05 | 13115.924 | 13105.871 |
| 6/14/05 | 13115.924 | 13105.871 |
| 6/15/05 | 13115.924 | 13105.871 |
| 6/16/05 | 13115.924 | 13105.871 |
| 6/17/05 | 13128.332 | 13115.496 |
| 6/20/05 | 13128.332 | 13115.496 |
| 6/21/05 | 13115.924 | 13105.871 |
| 6/22/05 | 13140.741 | 13125.12 |
| 6/23/05 | 13165.558 | 13144.37 |
| 6/24/05 | 13153.149 | 13134.745 |
| 6/27/05 | 13165.558 | 13144.37 |
| 6/28/05 | 13165.558 | 13144.37 |
| 6/29/05 | 13153.149 | 13134.745 |
| 6/30/05 | 13153.149 | 13134.745 |
| 7/1/05 | 13165.558 | 13144.37 |
| 7/5/05 | 13140.741 | 13125.12 |
| 7/6/05 | 13115.924 | 13105.871 |
| 7/7/05 | 13128.332 | 13115.496 |
| 7/8/05 | 13140.741 | 13125.12 |
| 7/11/05 | 13115.924 | 13105.871 |
| 7/12/05 | 13128.332 | 13115.496 |
| 7/13/05 | 13103.515 | 13096.246 |
| 7/14/05 | 13103.515 | 13096.246 |
| 7/15/05 | 13103.515 | 13096.246 |
| 7/18/05 | 13103.515 | 13096.246 |
| 7/19/05 | 13091.106 | 13086.622 |
| 7/20/05 | 13103.515 | 13096.246 |
| 7/21/05 | 13128.332 | 13115.496 |
| 7/22/05 | 13103.515 | 13096.246 |
| 7/25/05 | 13115.924 | 13105.871 |
| 7/26/05 | 13115.924 | 13105.871 |
| 7/27/05 | 13115.924 | 13105.871 |
| 7/28/05 | 13115.924 | 13105.871 |
| 7/29/05 | 13140.741 | 13125.12 |
| 8/1/05 | 13115.924 | 13105.871 |
| 8/2/05 | 13103.515 | 13096.246 |
| 8/3/05 | 13103.515 | 13096.246 |
| 8/4/05 | 13115.924 | 13105.871 |
| 8/5/05 | 13115.924 | 13105.871 |
| 8/8/05 | 13078.698 | 13076.997 |
| 8/9/05 | 13029.063 | 13038.499 |
| 8/10/05 | 13041.472 | 13048.123 |
| 8/11/05 | 13053.88 | 13057.748 |
| 8/12/05 | 13078.698 | 13076.997 |
| 8/15/05 | 13103.515 | 13096.246 |
| 8/16/05 | 13091.106 | 13086.622 |
| 8/17/05 | 13103.515 | 13096.246 |
| 8/18/05 | 13091.106 | 13086.622 |
| 8/19/05 | 13115.924 | 13105.871 |
| 8/22/05 | 13128.332 | 13115.496 |
| 8/23/05 | 13128.332 | 13115.496 |
| 8/24/05 | 13153.149 | 13134.745 |
| 8/25/05 | 13153.149 | 13134.745 |
| 8/26/05 | 13140.741 | 13125.12 |
| 8/29/05 | 13140.741 | 13125.12 |
| 8/30/05 | 13140.741 | 13125.12 |
| 8/31/05 | 13177.967 | 13153.994 |
| 9/1/05 | 13215.193 | 13182.868 |
| 9/2/05 | 13227.601 | 13192.493 |
| 9/6/05 | 13227.601 | 13192.493 |
| 9/7/05 | 13215.193 | 13182.868 |
| 9/8/05 | 13202.784 | 13173.244 |
| 9/9/05 | 13202.784 | 13173.244 |
| 9/12/05 | 13202.784 | 13173.244 |
| 9/13/05 | 13190.375 | 13163.619 |
| 9/14/05 | 13202.784 | 13173.244 |
| 9/15/05 | 13190.375 | 13163.619 |
| 9/16/05 | 13165.558 | 13144.37 |
| 9/19/05 | 13140.741 | 13125.12 |
| 9/20/05 | 13140.741 | 13125.12 |
| 9/21/05 | 13115.924 | 13105.871 |
| 9/22/05 | 13128.332 | 13115.496 |
| 9/23/05 | 13128.332 | 13115.496 |
| 9/26/05 | 13103.515 | 13096.246 |
| 9/27/05 | 13091.106 | 13086.622 |
| 9/28/05 | 13091.106 | 13086.622 |
| 9/29/05 | 13103.515 | 13096.246 |
| 9/30/05 | 13078.698 | 13076.997 |
| 10/3/05 | 13053.88 | 13057.748 |
| 10/4/05 | 13066.289 | 13067.372 |
| 10/5/05 | 13053.88 | 13057.748 |
| 10/6/05 | 13066.289 | 13067.372 |
| 10/7/05 | 13041.472 | 13048.123 |
| 10/10/05 | 13041.472 | 13048.123 |
| 10/11/05 | 13029.063 | 13038.499 |
| 10/12/05 | 12967.02 | 12990.375 |
| 10/13/05 | 12942.203 | 12971.126 |
| 10/14/05 | 12904.977 | 12942.252 |
| 10/17/05 | 12929.794 | 12961.501 |
| 10/18/05 | 12917.385 | 12951.877 |
| 10/19/05 | 12917.385 | 12951.877 |
| 10/20/05 | 12929.794 | 12961.501 |
| 10/21/05 | 12929.794 | 12961.501 |
| 10/24/05 | 12967.02 | 12990.375 |
| 10/25/05 | 12967.02 | 12990.375 |
| 10/26/05 | 12929.794 | 12961.501 |
| 10/27/05 | 12917.385 | 12951.877 |
| 10/28/05 | 12917.385 | 12951.877 |
| 10/31/05 | 12917.385 | 12951.877 |
| 11/1/05 | 12929.794 | 12961.501 |
| 11/2/05 | 12929.794 | 12961.501 |
| 11/3/05 | 12917.385 | 12951.877 |
| 11/4/05 | 12904.977 | 12942.252 |
| 11/7/05 | 12904.977 | 12942.252 |
| 11/8/05 | 12904.977 | 12942.252 |
| 11/9/05 | 12929.794 | 12961.501 |
| 11/10/05 | 12904.977 | 12942.252 |
| 11/11/05 | 12904.977 | 12942.252 |
| 11/14/05 | 12942.203 | 12971.126 |
| 11/15/05 | 12917.385 | 12951.877 |
| 11/16/05 | 12917.385 | 12951.877 |
| 11/17/05 | 12942.203 | 12971.126 |
| 11/18/05 | 12954.611 | 12980.751 |
| 11/21/05 | 12942.203 | 12971.126 |
| 11/22/05 | 12954.611 | 12980.751 |
| 11/23/05 | 12967.02 | 12990.375 |
| 11/25/05 | 12954.611 | 12980.751 |
| 11/28/05 | 12967.02 | 12990.375 |
| 11/29/05 | 12979.429 | 13000 |
| 11/30/05 | 12954.611 | 12980.751 |
| 12/1/05 | 12954.611 | 12980.751 |
| 12/2/05 | 12942.203 | 12971.126 |
| 12/5/05 | 12954.611 | 12980.751 |
| 12/6/05 | 12929.794 | 12961.501 |
| 12/7/05 | 12954.611 | 12980.751 |
| 12/8/05 | 12942.203 | 12971.126 |
| 12/9/05 | 12954.611 | 12980.751 |
| 12/12/05 | 12929.794 | 12961.501 |
| 12/13/05 | 12917.385 | 12951.877 |
| 12/14/05 | 12929.794 | 12961.501 |
| 12/15/05 | 12954.611 | 12980.751 |
| 12/16/05 | 12942.203 | 12971.126 |
| 12/19/05 | 12954.611 | 12980.751 |
| 12/20/05 | 12942.203 | 12971.126 |
| 12/21/05 | 12929.794 | 12961.501 |
| 12/22/05 | 12917.385 | 12951.877 |
| 12/23/05 | 12954.611 | 12980.751 |
| 12/27/05 | 12967.02 | 12990.375 |
| 12/28/05 | 13004.246 | 13019.249 |
| 12/29/05 | 12979.429 | 13000 |
| 12/30/05 | 12879.308 | 13002.887 |
| 1/3/06 | 12892.073 | 13012.512 |
| 1/4/06 | 12930.366 | 13041.386 |
| 1/5/06 | 12955.895 | 13060.635 |
| 1/6/06 | 12955.895 | 13060.635 |
| 1/9/06 | 12955.895 | 13060.635 |
| 1/10/06 | 12968.659 | 13070.26 |
| 1/11/06 | 12955.895 | 13060.635 |
| 1/12/06 | 12955.895 | 13060.635 |
| 1/13/06 | 12968.659 | 13070.26 |
| 1/17/06 | 12994.188 | 13089.509 |
| 1/18/06 | 13006.953 | 13099.134 |
| 1/19/06 | 13019.717 | 13108.758 |
| 1/20/06 | 13006.953 | 13099.134 |
| 1/23/06 | 13006.953 | 13099.134 |
| 1/24/06 | 13019.717 | 13108.758 |
| 1/25/06 | 13019.717 | 13108.758 |
| 1/26/06 | 12981.424 | 13079.885 |
| 1/27/06 | 12968.659 | 13070.26 |
| 1/30/06 | 12981.424 | 13079.885 |
| 1/31/06 | 12968.659 | 13070.26 |
| 2/1/06 | 12981.424 | 13079.885 |
| 2/2/06 | 12968.659 | 13070.26 |
| 2/3/06 | 12968.659 | 13070.26 |
| 2/6/06 | 12981.424 | 13079.885 |
| 2/7/06 | 12981.424 | 13079.885 |
| 2/8/06 | 12981.424 | 13079.885 |
| 2/9/06 | 12981.424 | 13079.885 |
| 2/10/06 | 12981.424 | 13079.885 |
| 2/13/06 | 12981.424 | 13079.885 |
| 2/14/06 | 12981.424 | 13079.885 |
| 2/15/06 | 12955.895 | 13060.635 |
| 2/16/06 | 12955.895 | 13060.635 |
| 2/17/06 | 12968.659 | 13070.26 |
| 2/21/06 | 12994.188 | 13089.509 |
| 2/22/06 | 12994.188 | 13089.509 |
| 2/23/06 | 13019.717 | 13108.758 |
| 2/24/06 | 13019.717 | 13108.758 |
| 2/27/06 | 13019.717 | 13108.758 |
| 2/28/06 | 13019.717 | 13108.758 |
| 3/1/06 | 13045.246 | 13128.008 |
| 3/2/06 | 13045.246 | 13128.008 |
| 3/3/06 | 13032.481 | 13118.383 |
| 3/6/06 | 13006.953 | 13099.134 |
| 3/7/06 | 12968.659 | 13070.26 |
| 3/8/06 | 12955.895 | 13060.635 |
| 3/9/06 | 12943.13 | 13051.011 |
| 3/10/06 | 12955.895 | 13060.635 |
| 3/13/06 | 12955.895 | 13060.635 |
| 3/14/06 | 12955.895 | 13060.635 |
| 3/15/06 | 12981.424 | 13079.885 |
| 3/16/06 | 12981.424 | 13079.885 |
| 3/17/06 | 13019.717 | 13108.758 |
| 3/20/06 | 13019.717 | 13108.758 |
| 3/21/06 | 13006.953 | 13099.134 |
| 3/22/06 | 12994.188 | 13089.509 |
| 3/23/06 | 12994.188 | 13089.509 |
| 3/24/06 | 12981.424 | 13079.885 |
| 3/27/06 | 13006.953 | 13099.134 |
| 3/28/06 | 12994.188 | 13089.509 |
| 3/29/06 | 12968.659 | 13070.26 |
| 3/30/06 | 12943.13 | 13051.011 |
| 3/31/06 | 12930.366 | 13041.386 |
| 4/3/06 | 12917.602 | 13031.761 |
| 4/4/06 | 12930.366 | 13041.386 |
| 4/5/06 | 12930.366 | 13041.386 |
| 4/6/06 | 12943.13 | 13051.011 |
| 4/7/06 | 12930.366 | 13041.386 |
| 4/10/06 | 12904.837 | 13022.137 |
| 4/11/06 | 12904.837 | 13022.137 |
| 4/12/06 | 12904.837 | 13022.137 |
| 4/13/06 | 12892.073 | 13012.512 |
| 4/17/06 | 12879.308 | 13002.887 |
| 4/18/06 | 12866.544 | 12993.263 |
| 4/19/06 | 12904.837 | 13022.137 |
| 4/20/06 | 12892.073 | 13012.512 |
| 4/21/06 | 12892.073 | 13012.512 |
| 4/24/06 | 12904.837 | 13022.137 |
| 4/25/06 | 12917.602 | 13031.761 |
| 4/26/06 | 12892.073 | 13012.512 |
| 4/27/06 | 12879.308 | 13002.887 |
| 4/28/06 | 12904.837 | 13022.137 |
| 5/1/06 | 12917.602 | 13031.761 |
| 5/2/06 | 12904.837 | 13022.137 |
| 5/3/06 | 12904.837 | 13022.137 |
| 5/4/06 | 12892.073 | 13012.512 |
| 5/5/06 | 12892.073 | 13012.512 |
| 5/8/06 | 12904.837 | 13022.137 |
| 5/9/06 | 12904.837 | 13022.137 |
| 5/10/06 | 12904.837 | 13022.137 |
| 5/11/06 | 12904.837 | 13022.137 |
| 5/12/06 | 12892.073 | 13012.512 |
| 5/15/06 | 12879.308 | 13002.887 |
| 5/16/06 | 12892.073 | 13012.512 |
| 5/17/06 | 12904.837 | 13022.137 |
| 5/18/06 | 12892.073 | 13012.512 |
| 5/19/06 | 12917.602 | 13031.761 |
| 5/22/06 | 12917.602 | 13031.761 |
| 5/23/06 | 12917.602 | 13031.761 |
| 5/24/06 | 12917.602 | 13031.761 |
| 5/25/06 | 12930.366 | 13041.386 |
| 5/26/06 | 12930.366 | 13041.386 |
| 5/30/06 | 12955.895 | 13060.635 |
| 5/31/06 | 12943.13 | 13051.011 |
| 6/1/06 | 12930.366 | 13041.386 |
| 6/2/06 | 12943.13 | 13051.011 |
| 6/5/06 | 12981.424 | 13079.885 |
| 6/6/06 | 12955.895 | 13060.635 |
| 6/7/06 | 12955.895 | 13060.635 |
| 6/8/06 | 12943.13 | 13051.011 |
| 6/9/06 | 12943.13 | 13051.011 |
| 6/12/06 | 12955.895 | 13060.635 |
| 6/13/06 | 12943.13 | 13051.011 |
| 6/14/06 | 12943.13 | 13051.011 |
| 6/15/06 | 12904.837 | 13022.137 |
| 6/16/06 | 12904.837 | 13022.137 |
| 6/19/06 | 12904.837 | 13022.137 |
| 6/20/06 | 12904.837 | 13022.137 |
| 6/21/06 | 12892.073 | 13012.512 |
| 6/22/06 | 12904.837 | 13022.137 |
| 6/23/06 | 12892.073 | 13012.512 |
| 6/26/06 | 12879.308 | 13002.887 |
| 6/27/06 | 12866.544 | 12993.263 |
| 6/28/06 | 12879.308 | 13002.887 |
| 6/29/06 | 12879.308 | 13002.887 |
| 6/30/06 | 12904.837 | 13022.137 |
| 7/3/06 | 12917.602 | 13031.761 |
| 7/5/06 | 12943.13 | 13051.011 |
| 7/6/06 | 12917.602 | 13031.761 |
| 7/7/06 | 12930.366 | 13041.386 |
| 7/10/06 | 12930.366 | 13041.386 |
| 7/11/06 | 12943.13 | 13051.011 |
| 7/12/06 | 12943.13 | 13051.011 |
| 7/13/06 | 12943.13 | 13051.011 |
| 7/14/06 | 12955.895 | 13060.635 |
| 7/17/06 | 12943.13 | 13051.011 |
| 7/18/06 | 12955.895 | 13060.635 |
| 7/19/06 | 12943.13 | 13051.011 |
| 7/20/06 | 12968.659 | 13070.26 |
| 7/21/06 | 12981.424 | 13079.885 |
| 7/24/06 | 12981.424 | 13079.885 |
| 7/25/06 | 12981.424 | 13079.885 |
| 7/26/06 | 12981.424 | 13079.885 |
| 7/27/06 | 12994.188 | 13089.509 |
| 7/28/06 | 13006.953 | 13099.134 |
| 7/31/06 | 13019.717 | 13108.758 |
| 8/1/06 | 13019.717 | 13108.758 |
| 8/2/06 | 13032.481 | 13118.383 |
| 8/3/06 | 13032.481 | 13118.383 |
| 8/4/06 | 13058.01 | 13137.632 |
| 8/7/06 | 13045.246 | 13128.008 |
| 8/8/06 | 13058.01 | 13137.632 |
| 8/9/06 | 13058.01 | 13137.632 |
| 8/10/06 | 13058.01 | 13137.632 |
| 8/11/06 | 13045.246 | 13128.008 |
| 8/14/06 | 13032.481 | 13118.383 |
| 8/15/06 | 13058.01 | 13137.632 |
| 8/16/06 | 13083.539 | 13156.882 |
| 8/17/06 | 13083.539 | 13156.882 |
| 8/18/06 | 13109.068 | 13176.131 |
| 8/21/06 | 13109.068 | 13176.131 |
| 8/22/06 | 13121.832 | 13185.756 |
| 8/23/06 | 13121.832 | 13185.756 |
| 8/24/06 | 13121.832 | 13185.756 |
| 8/25/06 | 13134.597 | 13195.38 |
| 8/28/06 | 13134.597 | 13195.38 |
| 8/29/06 | 13134.597 | 13195.38 |
| 8/30/06 | 13147.361 | 13205.005 |
| 8/31/06 | 13172.89 | 13224.254 |
| 9/1/06 | 13172.89 | 13224.254 |
| 9/5/06 | 13160.126 | 13214.629 |
| 9/6/06 | 13160.126 | 13214.629 |
| 9/7/06 | 13160.126 | 13214.629 |
| 9/8/06 | 13172.89 | 13224.254 |
| 9/11/06 | 13160.126 | 13214.629 |
| 9/12/06 | 13172.89 | 13224.254 |
| 9/13/06 | 13185.655 | 13233.879 |
| 9/14/06 | 13172.89 | 13224.254 |
| 9/15/06 | 13172.89 | 13224.254 |
| 9/18/06 | 13172.89 | 13224.254 |
| 9/19/06 | 13185.655 | 13233.879 |
| 9/20/06 | 13198.419 | 13243.503 |
| 9/21/06 | 13223.948 | 13262.753 |
| 9/22/06 | 13249.477 | 13282.002 |
| 9/25/06 | 13262.241 | 13291.627 |
| 9/26/06 | 13249.477 | 13282.002 |
| 9/27/06 | 13249.477 | 13282.002 |
| 9/28/06 | 13236.712 | 13272.377 |
| 9/29/06 | 13236.712 | 13272.377 |
| 10/2/06 | 13262.241 | 13291.627 |
| 10/3/06 | 13249.477 | 13282.002 |
| 10/4/06 | 13275.006 | 13301.251 |
| 10/5/06 | 13249.477 | 13282.002 |
| 10/6/06 | 13223.948 | 13262.753 |
| 10/9/06 | 13236.712 | 13272.377 |
| 10/10/06 | 13223.948 | 13262.753 |
| 10/11/06 | 13211.183 | 13253.128 |
| 10/12/06 | 13211.183 | 13253.128 |
| 10/13/06 | 13211.183 | 13253.128 |
| 10/16/06 | 13211.183 | 13253.128 |
| 10/17/06 | 13211.183 | 13253.128 |
| 10/18/06 | 13236.712 | 13272.377 |
| 10/19/06 | 13236.712 | 13272.377 |
| 10/20/06 | 13236.712 | 13272.377 |
| 10/23/06 | 13223.948 | 13262.753 |
| 10/24/06 | 13236.712 | 13272.377 |
| 10/25/06 | 13249.477 | 13282.002 |
| 10/26/06 | 13275.006 | 13301.251 |
| 10/27/06 | 13287.77 | 13310.876 |
| 10/30/06 | 13287.77 | 13310.876 |
| 10/31/06 | 13313.299 | 13330.125 |
| 11/1/06 | 13338.828 | 13349.374 |
| 11/2/06 | 13313.299 | 13330.125 |
| 11/3/06 | 13262.241 | 13291.627 |
| 11/6/06 | 13275.006 | 13301.251 |
| 11/7/06 | 13300.534 | 13320.5 |
| 11/8/06 | 13300.534 | 13320.5 |
| 11/9/06 | 13300.534 | 13320.5 |
| 11/10/06 | 13313.299 | 13330.125 |
| 11/13/06 | 13300.534 | 13320.5 |
| 11/14/06 | 13313.299 | 13330.125 |
| 11/15/06 | 13287.77 | 13310.876 |
| 11/16/06 | 13262.241 | 13291.627 |
| 11/17/06 | 13300.534 | 13320.5 |
| 11/20/06 | 13300.534 | 13320.5 |
| 11/21/06 | 13313.299 | 13330.125 |
| 11/22/06 | 13326.063 | 13339.75 |
| 11/24/06 | 13338.828 | 13349.374 |
| 11/27/06 | 13351.592 | 13358.999 |
| 11/28/06 | 13364.357 | 13368.624 |
| 11/29/06 | 13364.357 | 13368.624 |
| 11/30/06 | 13389.885 | 13387.873 |
| 12/1/06 | 13415.414 | 13407.122 |
| 12/4/06 | 13428.179 | 13416.747 |
| 12/5/06 | 13428.179 | 13416.747 |
| 12/6/06 | 13415.414 | 13407.122 |
| 12/7/06 | 13415.414 | 13407.122 |
| 12/8/06 | 13389.885 | 13387.873 |
| 12/11/06 | 13402.65 | 13397.498 |
| 12/12/06 | 13415.414 | 13407.122 |
| 12/13/06 | 13389.885 | 13387.873 |
| 12/14/06 | 13377.121 | 13378.248 |
| 12/15/06 | 13377.121 | 13378.248 |
| 12/18/06 | 13389.885 | 13387.873 |
| 12/19/06 | 13389.885 | 13387.873 |
| 12/20/06 | 13389.885 | 13387.873 |
| 12/21/06 | 13402.65 | 13397.498 |
| 12/22/06 | 13389.885 | 13387.873 |
| 12/26/06 | 13389.885 | 13387.873 |
| 12/27/06 | 13364.357 | 13368.624 |
| 12/28/06 | 13603.048 | 13607.315 |
| 12/29/06 | 13200.283 | 13308.951 |
| 1/3/07 | 13226.268 | 13328.2 |
| 1/4/07 | 13226.268 | 13328.2 |
| 1/5/07 | 13226.268 | 13328.2 |
| 1/8/07 | 13226.268 | 13328.2 |
| 1/9/07 | 13226.268 | 13328.2 |
| 1/10/07 | 13226.268 | 13328.2 |
| 1/11/07 | 13213.275 | 13318.576 |
| 1/12/07 | 13213.275 | 13318.576 |
| 1/16/07 | 13213.275 | 13318.576 |
| 1/17/07 | 13200.283 | 13308.951 |
| 1/18/07 | 13213.275 | 13318.576 |
| 1/19/07 | 13200.283 | 13308.951 |
| 1/22/07 | 13213.275 | 13318.576 |
| 1/23/07 | 13200.283 | 13308.951 |
| 1/24/07 | 13200.283 | 13308.951 |
| 1/25/07 | 13187.291 | 13299.326 |
| 1/26/07 | 13200.283 | 13308.951 |
| 1/29/07 | 13200.283 | 13308.951 |
| 1/30/07 | 13213.275 | 13318.576 |
| 1/31/07 | 13226.268 | 13328.2 |
| 2/1/07 | 13213.275 | 13318.576 |
| 2/2/07 | 13226.268 | 13328.2 |
| 2/5/07 | 13239.26 | 13337.825 |
| 2/6/07 | 13252.253 | 13347.449 |
| 2/7/07 | 13252.253 | 13347.449 |
| 2/8/07 | 13252.253 | 13347.449 |
| 2/9/07 | 13226.268 | 13328.2 |
| 2/12/07 | 13213.275 | 13318.576 |
| 2/13/07 | 13239.26 | 13337.825 |
| 2/14/07 | 13265.245 | 13357.074 |
| 2/15/07 | 13278.237 | 13366.699 |
| 2/16/07 | 13278.237 | 13366.699 |
| 2/20/07 | 13291.23 | 13376.323 |
| 2/21/07 | 13278.237 | 13366.699 |
| 2/22/07 | 13265.245 | 13357.074 |
| 2/23/07 | 13278.237 | 13366.699 |
| 2/26/07 | 13291.23 | 13376.323 |
| 2/27/07 | 13252.253 | 13347.449 |
| 2/28/07 | 13252.253 | 13347.449 |
| 3/1/07 | 13239.26 | 13337.825 |
| 3/2/07 | 13226.268 | 13328.2 |
| 3/5/07 | 13174.298 | 13289.702 |
| 3/6/07 | 13200.283 | 13308.951 |
| 3/7/07 | 13213.275 | 13318.576 |
| 3/8/07 | 13226.268 | 13328.2 |
| 3/9/07 | 13213.275 | 13318.576 |
| 3/12/07 | 13239.26 | 13337.825 |
| 3/13/07 | 13213.275 | 13318.576 |
| 3/14/07 | 13200.283 | 13308.951 |
| 3/15/07 | 13213.275 | 13318.576 |
| 3/16/07 | 13200.283 | 13308.951 |
| 3/19/07 | 13226.268 | 13328.2 |
| 3/20/07 | 13239.26 | 13337.825 |
| 3/21/07 | 13291.23 | 13376.323 |
| 3/22/07 | 13291.23 | 13376.323 |
| 3/23/07 | 13291.23 | 13376.323 |
| 3/26/07 | 13304.222 | 13385.948 |
| 3/27/07 | 13291.23 | 13376.323 |
| 3/28/07 | 13278.237 | 13366.699 |
| 3/29/07 | 13291.23 | 13376.323 |
| 3/30/07 | 13291.23 | 13376.323 |
| 4/2/07 | 13304.222 | 13385.948 |
| 4/3/07 | 13317.215 | 13395.573 |
| 4/4/07 | 13304.222 | 13385.948 |
| 4/5/07 | 13304.222 | 13385.948 |
| 4/9/07 | 13291.23 | 13376.323 |
| 4/10/07 | 13304.222 | 13385.948 |
| 4/11/07 | 13291.23 | 13376.323 |
| 4/12/07 | 13304.222 | 13385.948 |
| 4/13/07 | 13317.215 | 13395.573 |
| 4/16/07 | 13343.2 | 13414.822 |
| 4/17/07 | 13369.184 | 13434.071 |
| 4/18/07 | 13382.177 | 13443.696 |
| 4/19/07 | 13369.184 | 13434.071 |
| 4/20/07 | 13382.177 | 13443.696 |
| 4/23/07 | 13382.177 | 13443.696 |
| 4/24/07 | 13382.177 | 13443.696 |
| 4/25/07 | 13395.169 | 13453.321 |
| 4/26/07 | 13382.177 | 13443.696 |
| 4/27/07 | 13382.177 | 13443.696 |
| 4/30/07 | 13382.177 | 13443.696 |
| 5/1/07 | 13382.177 | 13443.696 |
| 5/2/07 | 13395.169 | 13453.321 |
| 5/3/07 | 13395.169 | 13453.321 |
| 5/4/07 | 13395.169 | 13453.321 |
| 5/7/07 | 13408.162 | 13462.945 |
| 5/8/07 | 13395.169 | 13453.321 |
| 5/9/07 | 13395.169 | 13453.321 |
| 5/10/07 | 13382.177 | 13443.696 |
| 5/11/07 | 13395.169 | 13453.321 |
| 5/14/07 | 13395.169 | 13453.321 |
| 5/15/07 | 13395.169 | 13453.321 |
| 5/16/07 | 13395.169 | 13453.321 |
| 5/17/07 | 13369.184 | 13434.071 |
| 5/18/07 | 13369.184 | 13434.071 |
| 5/21/07 | 13382.177 | 13443.696 |
| 5/22/07 | 13369.184 | 13434.071 |
| 5/23/07 | 13369.184 | 13434.071 |
| 5/24/07 | 13330.207 | 13405.197 |
| 5/25/07 | 13356.192 | 13424.447 |
| 5/29/07 | 13369.184 | 13434.071 |
| 5/30/07 | 13382.177 | 13443.696 |
| 5/31/07 | 13395.169 | 13453.321 |
| 6/1/07 | 13382.177 | 13443.696 |
| 6/4/07 | 13395.169 | 13453.321 |
| 6/5/07 | 13382.177 | 13443.696 |
| 6/6/07 | 13356.192 | 13424.447 |
| 6/7/07 | 13278.237 | 13366.699 |
| 6/8/07 | 13291.23 | 13376.323 |
| 6/11/07 | 13291.23 | 13376.323 |
| 6/12/07 | 13239.26 | 13337.825 |
| 6/13/07 | 13278.237 | 13366.699 |
| 6/14/07 | 13278.237 | 13366.699 |
| 6/15/07 | 13291.23 | 13376.323 |
| 6/18/07 | 13291.23 | 13376.323 |
| 6/19/07 | 13304.222 | 13385.948 |
| 6/20/07 | 13291.23 | 13376.323 |
| 6/21/07 | 13278.237 | 13366.699 |
| 6/22/07 | 13252.253 | 13347.449 |
| 6/25/07 | 13265.245 | 13357.074 |
| 6/26/07 | 13252.253 | 13347.449 |
| 6/27/07 | 13265.245 | 13357.074 |
| 6/28/07 | 13265.245 | 13357.074 |
| 6/29/07 | 13291.23 | 13376.323 |
| 7/2/07 | 13317.215 | 13395.573 |
| 7/3/07 | 13330.207 | 13405.197 |
| 7/5/07 | 13330.207 | 13405.197 |
| 7/6/07 | 13330.207 | 13405.197 |
| 7/9/07 | 13330.207 | 13405.197 |
| 7/10/07 | 13317.215 | 13395.573 |
| 7/11/07 | 13317.215 | 13395.573 |
| 7/12/07 | 13330.207 | 13405.197 |
| 7/13/07 | 13356.192 | 13424.447 |
| 7/16/07 | 13356.192 | 13424.447 |
| 7/17/07 | 13356.192 | 13424.447 |
| 7/18/07 | 13356.192 | 13424.447 |
| 7/19/07 | 13369.184 | 13434.071 |
| 7/20/07 | 13356.192 | 13424.447 |
| 7/23/07 | 13343.2 | 13414.822 |
| 7/24/07 | 13291.23 | 13376.323 |
| 7/25/07 | 13304.222 | 13385.948 |
| 7/26/07 | 13226.268 | 13328.2 |
| 7/27/07 | 13174.298 | 13289.702 |
| 7/30/07 | 13174.298 | 13289.702 |
| 7/31/07 | 13187.291 | 13299.326 |
| 8/1/07 | 13187.291 | 13299.326 |
| 8/2/07 | 13213.275 | 13318.576 |
| 8/3/07 | 13161.306 | 13280.077 |
| 8/6/07 | 13161.306 | 13280.077 |
| 8/7/07 | 13174.298 | 13289.702 |
| 8/8/07 | 13213.275 | 13318.576 |
| 8/9/07 | 13161.306 | 13280.077 |
| 8/10/07 | 13135.321 | 13260.828 |
| 8/13/07 | 13122.329 | 13251.203 |
| 8/14/07 | 13057.367 | 13203.08 |
| 8/15/07 | 12979.412 | 13145.332 |
| 8/16/07 | 12940.435 | 13116.458 |
| 8/17/07 | 13018.389 | 13174.206 |
| 8/20/07 | 13031.382 | 13183.831 |
| 8/21/07 | 13044.374 | 13193.455 |
| 8/22/07 | 13057.367 | 13203.08 |
| 8/23/07 | 13083.351 | 13222.329 |
| 8/24/07 | 13109.336 | 13241.578 |
| 8/27/07 | 13109.336 | 13241.578 |
| 8/28/07 | 13044.374 | 13193.455 |
| 8/29/07 | 13083.351 | 13222.329 |
| 8/30/07 | 13083.351 | 13222.329 |
| 8/31/07 | 13109.336 | 13241.578 |
| 9/4/07 | 13135.321 | 13260.828 |
| 9/5/07 | 13122.329 | 13251.203 |
| 9/6/07 | 13122.329 | 13251.203 |
| 9/7/07 | 13109.336 | 13241.578 |
| 9/10/07 | 13122.329 | 13251.203 |
| 9/11/07 | 13148.313 | 13270.452 |
| 9/12/07 | 13161.306 | 13280.077 |
| 9/13/07 | 13161.306 | 13280.077 |
| 9/14/07 | 13161.306 | 13280.077 |
| 9/17/07 | 13161.306 | 13280.077 |
| 9/18/07 | 13213.275 | 13318.576 |
| 9/19/07 | 13252.253 | 13347.449 |
| 9/20/07 | 13226.268 | 13328.2 |
| 9/21/07 | 13252.253 | 13347.449 |
| 9/24/07 | 13252.253 | 13347.449 |
| 9/25/07 | 13239.26 | 13337.825 |
| 9/26/07 | 13265.245 | 13357.074 |
| 9/27/07 | 13317.215 | 13395.573 |
| 9/28/07 | 13317.215 | 13395.573 |
| 10/1/07 | 13330.207 | 13405.197 |
| 10/2/07 | 13330.207 | 13405.197 |
| 10/3/07 | 13330.207 | 13405.197 |
| 10/4/07 | 13356.192 | 13424.447 |
| 10/5/07 | 13369.184 | 13434.071 |
| 10/8/07 | 13343.2 | 13414.822 |
| 10/9/07 | 13356.192 | 13424.447 |
| 10/10/07 | 13369.184 | 13434.071 |
| 10/11/07 | 13382.177 | 13443.696 |
| 10/12/07 | 13382.177 | 13443.696 |
| 10/15/07 | 13369.184 | 13434.071 |
| 10/16/07 | 13343.2 | 13414.822 |
| 10/17/07 | 13369.184 | 13434.071 |
| 10/18/07 | 13395.169 | 13453.321 |
| 10/19/07 | 13369.184 | 13434.071 |
| 10/22/07 | 13356.192 | 13424.447 |
| 10/23/07 | 13382.177 | 13443.696 |
| 10/24/07 | 13395.169 | 13453.321 |
| 10/25/07 | 13395.169 | 13453.321 |
| 10/26/07 | 13395.169 | 13453.321 |
| 10/29/07 | 13473.124 | 13511.068 |
| 10/30/07 | 13408.162 | 13462.945 |
| 10/31/07 | 13460.131 | 13501.444 |
| 11/1/07 | 13408.162 | 13462.945 |
| 11/2/07 | 13434.146 | 13482.194 |
| 11/5/07 | 13421.154 | 13472.57 |
| 11/6/07 | 13460.131 | 13501.444 |
| 11/7/07 | 13408.162 | 13462.945 |
| 11/8/07 | 13395.169 | 13453.321 |
| 11/9/07 | 13369.184 | 13434.071 |
| 11/12/07 | 13304.222 | 13385.948 |
| 11/13/07 | 13343.2 | 13414.822 |
| 11/14/07 | 13356.192 | 13424.447 |
| 11/15/07 | 13330.207 | 13405.197 |
| 11/16/07 | 13330.207 | 13405.197 |
| 11/19/07 | 13330.207 | 13405.197 |
| 11/20/07 | 13343.2 | 13414.822 |
| 11/21/07 | 13317.215 | 13395.573 |
| 11/23/07 | 13356.192 | 13424.447 |
| 11/26/07 | 13343.2 | 13414.822 |
| 11/27/07 | 13343.2 | 13414.822 |
| 11/28/07 | 13382.177 | 13443.696 |
| 11/29/07 | 13395.169 | 13453.321 |
| 11/30/07 | 13421.154 | 13472.57 |
| 12/3/07 | 13434.146 | 13482.194 |
| 12/4/07 | 13408.162 | 13462.945 |
| 12/5/07 | 13421.154 | 13472.57 |
| 12/6/07 | 13447.139 | 13491.819 |
| 12/7/07 | 13434.146 | 13482.194 |
| 12/10/07 | 13460.131 | 13501.444 |
| 12/11/07 | 13434.146 | 13482.194 |
| 12/12/07 | 13447.139 | 13491.819 |
| 12/13/07 | 13421.154 | 13472.57 |
| 12/14/07 | 13356.192 | 13424.447 |
| 12/17/07 | 13330.207 | 13405.197 |
| 12/18/07 | 13343.2 | 13414.822 |
| 12/19/07 | 13356.192 | 13424.447 |
| 12/20/07 | 13356.192 | 13424.447 |
| 12/21/07 | 13473.124 | 13511.068 |
| 12/24/07 | 13499.108 | 13530.318 |
| 12/26/07 | 13499.108 | 13530.318 |
| 12/27/07 | 13415.398 | 13540.905 |
| 12/28/07 | 13428.667 | 13550.529 |
| 12/31/07 | 13428.667 | 13550.529 |
| 1/2/08 | 13468.476 | 13579.403 |
| 1/3/08 | 13481.745 | 13589.028 |
| 1/4/08 | 13441.937 | 13560.154 |
| 1/7/08 | 13428.667 | 13550.529 |
| 1/8/08 | 13428.667 | 13550.529 |
| 1/9/08 | 13428.667 | 13550.529 |
| 1/10/08 | 13428.667 | 13550.529 |
| 1/11/08 | 13428.667 | 13550.529 |
| 1/14/08 | 13468.476 | 13579.403 |
| 1/15/08 | 13428.667 | 13550.529 |
| 1/16/08 | 13402.129 | 13531.28 |
| 1/17/08 | 13375.59 | 13512.031 |
| 1/18/08 | 13362.32 | 13502.406 |
| 1/22/08 | 13349.051 | 13492.782 |
| 1/23/08 | 13349.051 | 13492.782 |
| 1/24/08 | 13388.859 | 13521.655 |
| 1/25/08 | 13388.859 | 13521.655 |
| 1/28/08 | 13441.937 | 13560.154 |
| 1/29/08 | 13481.745 | 13589.028 |
| 1/30/08 | 13468.476 | 13579.403 |
| 1/31/08 | 13468.476 | 13579.403 |
| 2/1/08 | 13587.901 | 13666.025 |
| 2/4/08 | 13574.631 | 13656.4 |
| 2/5/08 | 13495.015 | 13598.653 |
| 2/6/08 | 13428.667 | 13550.529 |
| 2/7/08 | 13428.667 | 13550.529 |
| 2/8/08 | 13468.476 | 13579.403 |
| 2/11/08 | 13468.476 | 13579.403 |
| 2/12/08 | 13468.476 | 13579.403 |
| 2/13/08 | 13468.476 | 13579.403 |
| 2/14/08 | 13468.476 | 13579.403 |
| 2/15/08 | 13455.206 | 13569.779 |
| 2/19/08 | 13468.476 | 13579.403 |
| 2/20/08 | 13468.476 | 13579.403 |
| 2/21/08 | 13388.859 | 13521.655 |
| 2/22/08 | 13388.859 | 13521.655 |
| 2/25/08 | 13468.476 | 13579.403 |
| 2/26/08 | 13534.823 | 13627.526 |
| 2/27/08 | 13574.631 | 13656.4 |
| 2/28/08 | 13548.092 | 13637.151 |
| 2/29/08 | 13441.937 | 13560.154 |
| 3/3/08 | 13428.667 | 13550.529 |
| 3/4/08 | 13402.129 | 13531.28 |
| 3/5/08 | 13441.937 | 13560.154 |
| 3/6/08 | 13362.32 | 13502.406 |
| 3/7/08 | 13335.781 | 13483.157 |
| 3/10/08 | 13322.512 | 13473.532 |
| 3/11/08 | 13415.398 | 13540.905 |
| 3/12/08 | 13455.206 | 13569.779 |
| 3/13/08 | 13455.206 | 13569.779 |
| 3/14/08 | 13388.859 | 13521.655 |
| 3/17/08 | 13269.434 | 13435.034 |
| 3/18/08 | 13349.051 | 13492.782 |
| 3/19/08 | 13282.704 | 13444.658 |
| 3/20/08 | 13242.895 | 13415.784 |
| 3/24/08 | 13335.781 | 13483.157 |
| 3/25/08 | 13521.554 | 13617.902 |
| 3/26/08 | 13521.554 | 13617.902 |
| 3/27/08 | 13521.554 | 13617.902 |
| 3/28/08 | 13455.206 | 13569.779 |
| 3/31/08 | 13481.745 | 13589.028 |
| 4/1/08 | 13561.362 | 13646.776 |
| 4/2/08 | 13614.44 | 13685.274 |
| 4/3/08 | 13614.44 | 13685.274 |
| 4/4/08 | 13667.517 | 13723.773 |
| 4/7/08 | 13667.517 | 13723.773 |
| 4/8/08 | 13667.517 | 13723.773 |
| 4/9/08 | 13667.517 | 13723.773 |
| 4/10/08 | 13667.517 | 13723.773 |
| 4/11/08 | 13627.709 | 13694.899 |
| 4/14/08 | 13587.901 | 13666.025 |
| 4/15/08 | 13601.17 | 13675.65 |
| 4/16/08 | 13667.517 | 13723.773 |
| 4/17/08 | 13694.056 | 13743.022 |
| 4/18/08 | 13760.403 | 13791.145 |
| 4/21/08 | 13720.595 | 13762.271 |
| 4/22/08 | 13694.056 | 13743.022 |
| 4/23/08 | 13640.978 | 13704.524 |
| 4/24/08 | 13640.978 | 13704.524 |
| 4/25/08 | 13680.787 | 13733.397 |
| 4/28/08 | 13707.326 | 13752.647 |
| 4/29/08 | 13667.517 | 13723.773 |
| 4/30/08 | 13667.517 | 13723.773 |
| 5/1/08 | 13733.864 | 13771.896 |
| 5/2/08 | 13747.134 | 13781.521 |
| 5/5/08 | 13733.864 | 13771.896 |
| 5/6/08 | 13733.864 | 13771.896 |
| 5/7/08 | 13720.595 | 13762.271 |
| 5/8/08 | 13707.326 | 13752.647 |
| 5/9/08 | 13707.326 | 13752.647 |
| 5/12/08 | 13747.134 | 13781.521 |
| 5/13/08 | 13733.864 | 13771.896 |
| 5/14/08 | 13733.864 | 13771.896 |
| 5/15/08 | 13760.403 | 13791.145 |
| 5/16/08 | 13773.673 | 13800.77 |
| 5/19/08 | 13773.673 | 13800.77 |
| 5/20/08 | 13733.864 | 13771.896 |
| 5/21/08 | 13667.517 | 13723.773 |
| 5/22/08 | 13654.248 | 13714.148 |
| 5/23/08 | 13627.709 | 13694.899 |
| 5/27/08 | 13614.44 | 13685.274 |
| 5/28/08 | 13601.17 | 13675.65 |
| 5/29/08 | 13627.709 | 13694.899 |
| 5/30/08 | 13640.978 | 13704.524 |
| 6/2/08 | 13587.901 | 13666.025 |
| 6/3/08 | 13601.17 | 13675.65 |
| 6/4/08 | 13574.631 | 13656.4 |
| 6/5/08 | 13614.44 | 13685.274 |
| 6/6/08 | 13521.554 | 13617.902 |
| 6/9/08 | 13468.476 | 13579.403 |
| 6/10/08 | 13415.398 | 13540.905 |
| 6/11/08 | 13295.973 | 13454.283 |
| 6/12/08 | 13256.165 | 13425.409 |
| 6/13/08 | 13269.434 | 13435.034 |
| 6/16/08 | 13269.434 | 13435.034 |
| 6/17/08 | 13269.434 | 13435.034 |
| 6/18/08 | 13216.357 | 13396.535 |
| 6/19/08 | 13189.818 | 13377.286 |
| 6/20/08 | 13203.087 | 13386.91 |
| 6/23/08 | 13150.009 | 13348.412 |
| 6/24/08 | 13070.393 | 13290.664 |
| 6/25/08 | 13110.201 | 13319.538 |
| 6/26/08 | 13017.315 | 13252.166 |
| 6/27/08 | 12990.776 | 13232.916 |
| 6/30/08 | 13004.046 | 13242.541 |
| 7/1/08 | 12964.237 | 13213.667 |
| 7/2/08 | 12964.237 | 13213.667 |
| 7/3/08 | 12990.776 | 13232.916 |
| 7/7/08 | 12911.16 | 13175.168 |
| 7/8/08 | 12964.237 | 13213.667 |
| 7/9/08 | 12924.429 | 13184.793 |
| 7/10/08 | 12937.698 | 13194.418 |
| 7/11/08 | 12884.621 | 13155.919 |
| 7/14/08 | 12805.004 | 13098.171 |
| 7/15/08 | 12751.926 | 13059.673 |
| 7/16/08 | 12871.351 | 13146.295 |
| 7/17/08 | 12990.776 | 13232.916 |
| 7/18/08 | 13004.046 | 13242.541 |
| 7/21/08 | 13057.123 | 13281.039 |
| 7/22/08 | 13017.315 | 13252.166 |
| 7/23/08 | 13057.123 | 13281.039 |
| 7/24/08 | 13030.584 | 13261.79 |
| 7/25/08 | 12977.507 | 13223.292 |
| 7/28/08 | 12911.16 | 13175.168 |
| 7/29/08 | 12977.507 | 13223.292 |
| 7/30/08 | 13043.854 | 13271.415 |
| 7/31/08 | 13043.854 | 13271.415 |
| 8/1/08 | 13030.584 | 13261.79 |
| 8/4/08 | 13004.046 | 13242.541 |
| 8/5/08 | 13110.201 | 13319.538 |
| 8/6/08 | 13110.201 | 13319.538 |
| 8/7/08 | 13043.854 | 13271.415 |
| 8/8/08 | 13110.201 | 13319.538 |
| 8/11/08 | 13176.548 | 13367.661 |
| 8/12/08 | 13123.47 | 13329.163 |
| 8/13/08 | 13043.854 | 13271.415 |
| 8/14/08 | 13096.932 | 13309.913 |
| 8/15/08 | 13163.279 | 13358.037 |
| 8/18/08 | 13110.201 | 13319.538 |
| 8/19/08 | 13017.315 | 13252.166 |
| 8/20/08 | 13030.584 | 13261.79 |
| 8/21/08 | 13004.046 | 13242.541 |
| 8/22/08 | 13070.393 | 13290.664 |
| 8/25/08 | 13017.315 | 13252.166 |
| 8/26/08 | 13017.315 | 13252.166 |
| 8/27/08 | 13057.123 | 13281.039 |
| 8/28/08 | 13150.009 | 13348.412 |
| 8/29/08 | 13163.279 | 13358.037 |
| 9/2/08 | 13176.548 | 13367.661 |
| 9/3/08 | 13203.087 | 13386.91 |
| 9/4/08 | 13110.201 | 13319.538 |
| 9/5/08 | 13096.932 | 13309.913 |
| 9/8/08 | 13242.895 | 13415.784 |
| 9/9/08 | 13163.279 | 13358.037 |
| 9/10/08 | 13110.201 | 13319.538 |
| 9/11/08 | 12950.968 | 13204.042 |
| 9/12/08 | 12977.507 | 13223.292 |
| 9/15/08 | 12154.802 | 12626.564 |
| 9/16/08 | 12035.377 | 12539.942 |
| 9/17/08 | 11584.216 | 12069.867 |
| 9/18/08 | 11650.563 | 12138.996 |
| 9/19/08 | 12075.185 | 12581.419 |
| 9/22/08 | 11610.755 | 12097.519 |
| 9/23/08 | 11504.599 | 11986.913 |
| 9/24/08 | 11464.791 | 11945.436 |
| 9/25/08 | 11570.947 | 12056.042 |
| 9/26/08 | 11584.216 | 12069.867 |
| 9/29/08 | 11252.48 | 11724.224 |
| 9/30/08 | 11305.558 | 11779.527 |
| 10/1/08 | 11358.636 | 11834.83 |
| 10/2/08 | 11186.133 | 11655.095 |
| 10/3/08 | 11172.864 | 11641.269 |
| 10/6/08 | 10814.589 | 11267.975 |
| 10/7/08 | 10615.547 | 11060.589 |
| 10/8/08 | 10416.506 | 10853.203 |
| 10/9/08 | 10111.309 | 10535.211 |
| 10/10/08 | 10044.962 | 10466.082 |
| 10/13/08 | 10615.547 | 11060.589 |
| 10/14/08 | 10774.781 | 11226.497 |
| 10/15/08 | 10350.159 | 10784.074 |
| 10/16/08 | 10535.931 | 10977.634 |
| 10/17/08 | 10628.817 | 11074.414 |
| 10/20/08 | 10788.05 | 11240.323 |
| 10/21/08 | 10801.319 | 11254.149 |
| 10/22/08 | 10575.739 | 11019.111 |
| 10/23/08 | 10589.009 | 11032.937 |
| 10/24/08 | 10469.584 | 10908.505 |
| 10/27/08 | 10310.35 | 10742.597 |
| 10/28/08 | 10535.931 | 10977.634 |
| 10/29/08 | 10695.164 | 11143.543 |
| 10/30/08 | 10734.972 | 11185.02 |
| 10/31/08 | 10867.667 | 11323.278 |
| 11/3/08 | 11000.361 | 11461.535 |
| 11/4/08 | 11252.48 | 11724.224 |
| 11/5/08 | 11079.978 | 11544.489 |
| 11/6/08 | 10880.936 | 11337.103 |
| 11/7/08 | 10920.744 | 11378.58 |
| 11/10/08 | 10841.128 | 11295.626 |
| 11/11/08 | 10721.703 | 11171.194 |
| 11/12/08 | 10509.392 | 10949.983 |
| 11/13/08 | 10628.817 | 11074.414 |
| 11/14/08 | 10350.159 | 10784.074 |
| 11/17/08 | 10204.195 | 10631.991 |
| 11/18/08 | 10244.003 | 10673.468 |
| 11/19/08 | 9978.615 | 10396.953 |
| 11/20/08 | 9686.687 | 10092.787 |
| 11/21/08 | 9660.148 | 10065.136 |
| 11/24/08 | 9845.92 | 10258.696 |
| 11/25/08 | 9978.615 | 10396.953 |
| 11/26/08 | 10098.039 | 10521.385 |
| 11/28/08 | 10190.926 | 10618.165 |
| 12/1/08 | 10031.692 | 10452.256 |
| 12/2/08 | 10098.039 | 10521.385 |
| 12/3/08 | 10124.578 | 10549.036 |
| 12/4/08 | 10005.153 | 10424.605 |
| 12/5/08 | 9965.345 | 10383.127 |
| 12/8/08 | 10005.153 | 10424.605 |
| 12/9/08 | 9965.345 | 10383.127 |
| 12/10/08 | 9978.615 | 10396.953 |
| 12/11/08 | 9885.729 | 10300.173 |
| 12/12/08 | 9845.92 | 10258.696 |
| 12/15/08 | 9819.381 | 10231.044 |
| 12/16/08 | 10018.423 | 10438.43 |
| 12/17/08 | 10164.387 | 10590.514 |
| 12/18/08 | 10350.159 | 10784.074 |
| 12/19/08 | 10522.661 | 10963.808 |
| 12/22/08 | 10615.547 | 11060.589 |
| 12/23/08 | 10681.895 | 11129.717 |
| 12/24/08 | 10814.589 | 11267.975 |
| 12/26/08 | 10894.206 | 11350.929 |
| 12/29/08 | 10827.858 | 11281.8 |
| 12/30/08 | 10907.475 | 11364.755 |
| 12/31/08 | 11063.518 | 11505.777 |
| 1/2/09 | 11327.929 | 11768.466 |
| 1/5/09 | 11439.26 | 11879.072 |
| 1/6/09 | 11634.089 | 12072.632 |
| 1/7/09 | 11508.842 | 11948.201 |
| 1/8/09 | 11578.423 | 12017.329 |
| 1/9/09 | 11620.173 | 12058.807 |
| 1/12/09 | 11550.591 | 11989.678 |
| 1/13/09 | 11592.34 | 12031.155 |
| 1/14/09 | 11397.511 | 11837.595 |
| 1/15/09 | 11341.845 | 11782.292 |
| 1/16/09 | 11508.842 | 11948.201 |
| 1/20/09 | 11314.012 | 11754.64 |
| 1/21/09 | 11550.591 | 11989.678 |
| 1/22/09 | 11494.925 | 11934.375 |
| 1/23/09 | 11578.423 | 12017.329 |
| 1/26/09 | 11634.089 | 12072.632 |
| 1/27/09 | 11689.754 | 12127.935 |
| 1/28/09 | 11870.667 | 12307.67 |
| 1/29/09 | 11749.205 | 12187.386 |
| 1/30/09 | 11735.218 | 12173.56 |
| 2/2/09 | 11707.244 | 12145.909 |
| 2/3/09 | 11791.167 | 12228.863 |
| 2/4/09 | 11791.167 | 12228.863 |
| 2/5/09 | 11735.218 | 12173.56 |
| 2/6/09 | 11875.089 | 12311.818 |
| 2/9/09 | 11931.038 | 12367.121 |
| 2/10/09 | 11791.167 | 12228.863 |
| 2/11/09 | 11777.179 | 12215.037 |
| 2/12/09 | 11735.218 | 12173.56 |
| 2/13/09 | 11637.308 | 12076.78 |
| 2/17/09 | 11175.732 | 11620.531 |
| 2/18/09 | 10854.028 | 11302.539 |
| 2/19/09 | 10630.233 | 11081.327 |
| 2/20/09 | 10336.503 | 10790.987 |
| 2/23/09 | 10000.811 | 10459.169 |
| 2/24/09 | 10378.465 | 10832.464 |
| 2/25/09 | 10378.465 | 10832.464 |
| 2/26/09 | 10455.727 | 10909.888 |
| 2/27/09 | 10441.617 | 10896.062 |
| 3/2/09 | 9679.661 | 10149.473 |
| 3/3/09 | 9580.889 | 10052.692 |
| 3/4/09 | 9736.102 | 10204.775 |
| 3/5/09 | 9341.014 | 9790.669 |
| 3/6/09 | 9185.801 | 9627.984 |
| 3/9/09 | 9185.801 | 9627.984 |
| 3/10/09 | 9425.676 | 9879.406 |
| 3/11/09 | 9566.779 | 10027.301 |
| 3/12/09 | 9947.757 | 10426.618 |
| 3/13/09 | 10032.418 | 10515.356 |
| 3/16/09 | 10074.749 | 10559.724 |
| 3/17/09 | 10201.742 | 10692.83 |
| 3/18/09 | 10342.845 | 10840.725 |
| 3/19/09 | 10286.404 | 10781.567 |
| 3/20/09 | 10173.521 | 10663.251 |
| 3/23/09 | 10667.382 | 11180.884 |
| 3/24/09 | 10639.161 | 11151.305 |
| 3/25/09 | 10766.154 | 11284.411 |
| 3/26/09 | 10921.367 | 11447.096 |
| 3/27/09 | 10794.374 | 11313.99 |
| 3/30/09 | 10470.155 | 10969.394 |
| 3/31/09 | 10669.587 | 11176.448 |
| 4/1/09 | 10797.793 | 11309.553 |
| 4/2/09 | 11054.205 | 11575.765 |
| 4/3/09 | 11139.675 | 11664.502 |
| 4/6/09 | 10997.224 | 11516.607 |
| 4/7/09 | 10897.509 | 11413.08 |
| 4/8/09 | 11025.715 | 11546.186 |
| 4/9/09 | 11367.597 | 11901.135 |
| 4/13/09 | 11424.578 | 11960.293 |
| 4/14/09 | 11339.107 | 11871.555 |
| 4/15/09 | 11495.803 | 12034.24 |
| 4/16/09 | 11695.235 | 12241.294 |
| 4/17/09 | 11780.705 | 12330.031 |
| 4/20/09 | 11467.313 | 12004.661 |
| 4/21/09 | 11638.254 | 12182.136 |
| 4/22/09 | 11581.274 | 12122.978 |
| 4/23/09 | 11709.48 | 12256.083 |
| 4/24/09 | 11794.95 | 12344.82 |
| 4/27/09 | 11709.48 | 12256.083 |
| 4/28/09 | 11723.725 | 12270.873 |
| 4/29/09 | 11867.029 | 12415.81 |
| 4/30/09 | 11938.863 | 12489.758 |
| 5/1/09 | 12125.633 | 12682.022 |
| 5/4/09 | 12369.869 | 12933.444 |
| 5/5/09 | 12341.136 | 12903.865 |
| 5/6/09 | 12527.905 | 13096.129 |
| 5/7/09 | 12470.437 | 13036.97 |
| 5/8/09 | 12829.609 | 13406.709 |
| 5/11/09 | 12700.307 | 13273.603 |
| 5/12/09 | 12714.674 | 13288.392 |
| 5/13/09 | 12341.136 | 12903.865 |
| 5/14/09 | 12398.603 | 12963.023 |
| 5/15/09 | 12341.136 | 12903.865 |
| 5/18/09 | 12657.207 | 13229.234 |
| 5/19/09 | 12743.408 | 13317.972 |
| 5/20/09 | 12786.508 | 13362.34 |
| 5/21/09 | 12700.307 | 13273.603 |
| 5/22/09 | 12815.242 | 13391.919 |
| 5/26/09 | 12973.278 | 13554.604 |
| 5/27/09 | 12930.177 | 13510.235 |
| 5/28/09 | 13102.579 | 13687.71 |
| 5/29/09 | 13217.514 | 13806.026 |
| 6/1/09 | 13476.118 | 14072.238 |
| 6/2/09 | 13550.911 | 14146.185 |
| 6/3/09 | 13449.568 | 14042.658 |
| 6/4/09 | 13637.776 | 14234.922 |
| 6/5/09 | 13695.685 | 14294.08 |
| 6/8/09 | 13623.298 | 14220.133 |
| 6/9/09 | 13724.64 | 14323.66 |
| 6/10/09 | 13666.73 | 14264.501 |
| 6/11/09 | 13782.55 | 14382.818 |
| 6/12/09 | 13797.028 | 14397.607 |
| 6/15/09 | 13507.478 | 14101.817 |
| 6/16/09 | 13478.523 | 14072.238 |
| 6/17/09 | 13420.613 | 14013.079 |
| 6/18/09 | 13464.046 | 14057.448 |
| 6/19/09 | 13536.433 | 14131.396 |
| 6/22/09 | 13261.361 | 13850.395 |
| 6/23/09 | 13203.451 | 13791.236 |
| 6/24/09 | 13362.704 | 13953.921 |
| 6/25/09 | 13536.433 | 14131.396 |
| 6/26/09 | 13594.343 | 14190.554 |
| 6/29/09 | 13550.911 | 14146.185 |
| 6/30/09 | 13550.911 | 14146.185 |
| 7/1/09 | 13623.298 | 14220.133 |
| 7/2/09 | 13550.911 | 14146.185 |
| 7/6/09 | 13449.568 | 14042.658 |
| 7/7/09 | 13333.749 | 13924.342 |
| 7/8/09 | 13203.451 | 13791.236 |
| 7/9/09 | 13290.316 | 13879.974 |
| 7/10/09 | 13348.226 | 13939.132 |
| 7/13/09 | 13507.478 | 14101.817 |
| 7/14/09 | 13623.298 | 14220.133 |
| 7/15/09 | 13840.46 | 14441.976 |
| 7/16/09 | 13927.325 | 14530.713 |
| 7/17/09 | 13956.28 | 14560.292 |
| 7/20/09 | 14130.009 | 14737.766 |
| 7/21/09 | 14130.009 | 14737.766 |
| 7/22/09 | 14144.487 | 14752.556 |
| 7/23/09 | 14332.694 | 14944.82 |
| 7/24/09 | 14390.604 | 15003.978 |
| 7/27/09 | 14462.991 | 15077.926 |
| 7/28/09 | 14462.991 | 15077.926 |
| 7/29/09 | 14419.559 | 15033.557 |
| 7/30/09 | 14434.036 | 15048.346 |
| 7/31/09 | 14578.811 | 15196.242 |
| 8/3/09 | 14839.405 | 15462.453 |
| 8/4/09 | 14940.748 | 15565.98 |
| 8/5/09 | 14955.225 | 15580.77 |
| 8/6/09 | 14882.838 | 15506.822 |
| 8/7/09 | 15085.522 | 15713.875 |
| 8/10/09 | 15114.477 | 15743.454 |
| 8/11/09 | 15013.135 | 15639.928 |
| 8/12/09 | 15071.045 | 15699.086 |
| 8/13/09 | 15128.955 | 15758.244 |
| 8/14/09 | 15027.613 | 15654.717 |
| 8/17/09 | 14607.766 | 15225.821 |
| 8/18/09 | 14795.973 | 15418.085 |
| 8/19/09 | 14795.973 | 15418.085 |
| 8/20/09 | 14897.315 | 15521.611 |
| 8/21/09 | 15027.613 | 15654.717 |
| 8/24/09 | 15042.09 | 15669.507 |
| 8/25/09 | 15100 | 15728.665 |
| 8/26/09 | 15114.477 | 15743.454 |
| 8/27/09 | 15085.522 | 15713.875 |
| 8/28/09 | 14998.658 | 15625.138 |
| 8/31/09 | 14955.225 | 15580.77 |
| 9/1/09 | 14824.928 | 15447.664 |
| 9/2/09 | 14781.496 | 15403.295 |
| 9/3/09 | 14868.36 | 15492.032 |
| 9/4/09 | 15013.135 | 15639.928 |
| 9/8/09 | 15172.387 | 15802.612 |
| 9/9/09 | 15273.729 | 15906.139 |
| 9/10/09 | 15360.594 | 15994.876 |
| 9/11/09 | 15418.504 | 16054.034 |
| 9/14/09 | 15490.892 | 16127.982 |
| 9/15/09 | 15635.666 | 16275.877 |
| 9/16/09 | 15838.351 | 16482.931 |
| 9/17/09 | 15939.693 | 16586.458 |
| 9/18/09 | 15983.125 | 16630.826 |
| 9/21/09 | 15910.738 | 16556.879 |
| 9/22/09 | 16041.035 | 16689.984 |
| 9/23/09 | 16084.468 | 16734.353 |
| 9/24/09 | 15925.216 | 16571.668 |
| 9/25/09 | 15968.648 | 16616.037 |
| 9/28/09 | 16098.945 | 16749.142 |
| 9/29/09 | 15983.125 | 16630.826 |
| 9/30/09 | 15997.603 | 16645.616 |
| 10/1/09 | 15838.351 | 16482.931 |
| 10/2/09 | 15679.099 | 16320.246 |
| 10/5/09 | 15838.351 | 16482.931 |
| 10/6/09 | 15896.261 | 16542.089 |
| 10/7/09 | 15925.216 | 16571.668 |
| 10/8/09 | 16026.558 | 16675.195 |
| 10/9/09 | 16069.99 | 16719.563 |
| 10/12/09 | 16069.99 | 16719.563 |
| 10/13/09 | 16026.558 | 16675.195 |
| 10/14/09 | 16098.945 | 16749.142 |
| 10/15/09 | 16069.99 | 16719.563 |
| 10/16/09 | 16084.468 | 16734.353 |
| 10/19/09 | 16171.333 | 16823.09 |
| 10/20/09 | 16156.855 | 16808.301 |
| 10/21/09 | 16113.423 | 16763.932 |
| 10/22/09 | 16185.81 | 16837.88 |
| 10/23/09 | 16171.333 | 16823.09 |
| 10/26/09 | 16113.423 | 16763.932 |
| 10/27/09 | 16069.99 | 16719.563 |
| 10/28/09 | 15606.711 | 16246.298 |
| 10/29/09 | 15855.013 | 16497.72 |
| 10/30/09 | 15461.552 | 16098.403 |
| 11/2/09 | 15592.705 | 16231.509 |
| 11/3/09 | 15621.851 | 16261.088 |
| 11/4/09 | 15709.286 | 16349.825 |
| 11/5/09 | 15796.722 | 16438.562 |
| 11/6/09 | 15840.44 | 16482.931 |
| 11/9/09 | 15942.448 | 16586.458 |
| 11/10/09 | 15942.448 | 16586.458 |
| 11/11/09 | 15971.594 | 16616.037 |
| 11/12/09 | 15898.731 | 16542.089 |
| 11/13/09 | 15927.876 | 16571.668 |
| 11/16/09 | 15957.021 | 16601.247 |
| 11/17/09 | 15942.448 | 16586.458 |
| 11/18/09 | 16000.739 | 16645.616 |
| 11/19/09 | 15971.594 | 16616.037 |
| 11/20/09 | 15986.166 | 16630.826 |
| 11/23/09 | 16015.312 | 16660.405 |
| 11/24/09 | 16073.602 | 16719.563 |
| 11/25/09 | 16146.465 | 16793.511 |
| 11/27/09 | 16086.735 | 16731.395 |
| 11/30/09 | 16101.399 | 16746.184 |
| 12/1/09 | 16233.378 | 16879.29 |
| 12/2/09 | 16233.378 | 16879.29 |
| 12/3/09 | 16233.378 | 16879.29 |
| 12/4/09 | 16248.042 | 16894.08 |
| 12/7/09 | 16292.035 | 16938.448 |
| 12/8/09 | 16292.035 | 16938.448 |
| 12/9/09 | 16306.7 | 16953.238 |
| 12/10/09 | 16365.357 | 17012.396 |
| 12/11/09 | 16424.014 | 17071.554 |
| 12/14/09 | 16512 | 17160.291 |
| 12/15/09 | 16482.671 | 17130.712 |
| 12/16/09 | 16541.328 | 17189.87 |
| 12/17/09 | 16497.335 | 17145.502 |
| 12/18/09 | 16497.335 | 17145.502 |
| 12/21/09 | 16555.993 | 17204.66 |
| 12/22/09 | 16585.321 | 17234.239 |
| 12/23/09 | 16643.978 | 17293.397 |
| 12/24/09 | 16731.964 | 17382.134 |
| 12/28/09 | 16717.3 | 17367.345 |
| 12/29/09 | 16687.971 | 17337.766 |
| 12/30/09 | 16628.485 | 17275.65 |
| 12/31/09 | 16643.372 | 17290.439 |
| 1/4/10 | 16717.806 | 17364.387 |
| 1/5/10 | 16822.013 | 17467.914 |
| 1/6/10 | 16881.56 | 17527.072 |
| 1/7/10 | 16926.22 | 17571.44 |
| 1/8/10 | 17015.54 | 17660.177 |
| 1/11/10 | 17089.974 | 17734.125 |
| 1/12/10 | 17045.314 | 17689.756 |
| 1/13/10 | 17075.087 | 17719.336 |
| 1/14/10 | 17089.974 | 17734.125 |
| 1/15/10 | 17060.2 | 17704.546 |
| 1/19/10 | 17164.408 | 17808.073 |
| 1/20/10 | 17119.747 | 17763.704 |
| 1/21/10 | 17015.54 | 17660.177 |
| 1/22/10 | 16896.446 | 17541.861 |
| 1/25/10 | 16896.446 | 17541.861 |
| 1/26/10 | 16881.56 | 17527.072 |
| 1/27/10 | 16836.899 | 17482.703 |
| 1/28/10 | 16792.239 | 17438.334 |
| 1/29/10 | 16732.692 | 17379.176 |
| 2/1/10 | 16882.747 | 17528.551 |
| 2/2/10 | 17061.874 | 17706.025 |
| 2/3/10 | 17076.802 | 17720.814 |
| 2/4/10 | 16763.329 | 17410.234 |
| 2/5/10 | 16434.929 | 17084.865 |
| 2/8/10 | 16434.929 | 17084.865 |
| 2/9/10 | 16599.129 | 17247.55 |
| 2/10/10 | 16599.129 | 17247.55 |
| 2/11/10 | 16643.911 | 17291.918 |
| 2/12/10 | 16614.056 | 17262.339 |
| 2/16/10 | 16733.474 | 17380.655 |
| 2/17/10 | 16793.183 | 17439.813 |
| 2/18/10 | 16882.747 | 17528.551 |
| 2/19/10 | 16942.456 | 17587.709 |
| 2/22/10 | 16957.383 | 17602.498 |
| 2/23/10 | 16972.311 | 17617.288 |
| 2/24/10 | 17032.02 | 17676.446 |
| 2/25/10 | 16957.383 | 17602.498 |
| 2/26/10 | 17032.02 | 17676.446 |
| 3/1/10 | 17121.583 | 17765.183 |
| 3/2/10 | 17211.147 | 17853.92 |
| 3/3/10 | 17166.365 | 17809.552 |
| 3/4/10 | 17166.365 | 17809.552 |
| 3/5/10 | 17270.856 | 17913.078 |
| 3/8/10 | 17315.638 | 17957.447 |
| 3/9/10 | 17360.42 | 18001.816 |
| 3/10/10 | 17390.274 | 18031.395 |
| 3/11/10 | 17390.274 | 18031.395 |
| 3/12/10 | 17435.056 | 18075.763 |
| 3/15/10 | 17435.056 | 18075.763 |
| 3/16/10 | 17494.765 | 18134.921 |
| 3/17/10 | 17539.547 | 18179.29 |
| 3/18/10 | 17569.402 | 18208.869 |
| 3/19/10 | 17509.692 | 18149.711 |
| 3/22/10 | 17524.62 | 18164.5 |
| 3/23/10 | 17569.402 | 18208.869 |
| 3/24/10 | 17584.329 | 18223.659 |
| 3/25/10 | 17629.111 | 18268.027 |
| 3/26/10 | 17644.038 | 18282.817 |
| 3/29/10 | 17644.038 | 18282.817 |
| 3/30/10 | 17524.62 | 18164.5 |
| 3/31/10 | 17494.765 | 18134.921 |
| 4/1/10 | 17584.329 | 18223.659 |
| 4/5/10 | 18017.22 | 18652.555 |
| 4/6/10 | 18032.147 | 18667.344 |
| 4/7/10 | 18032.147 | 18667.344 |
| 4/8/10 | 18076.929 | 18711.713 |
| 4/9/10 | 17688.82 | 18327.185 |
| 4/12/10 | 17733.602 | 18371.554 |
| 4/13/10 | 17733.602 | 18371.554 |
| 4/14/10 | 17763.456 | 18401.133 |
| 4/15/10 | 17733.602 | 18371.554 |
| 4/16/10 | 17614.183 | 18253.238 |
| 4/19/10 | 17629.111 | 18268.027 |
| 4/20/10 | 17748.529 | 18386.343 |
| 4/21/10 | 17718.674 | 18356.764 |
| 4/22/10 | 17718.674 | 18356.764 |
| 4/23/10 | 17823.165 | 18460.291 |
| 4/26/10 | 17838.093 | 18475.081 |
| 4/27/10 | 17703.747 | 18341.975 |
| 4/28/10 | 17733.602 | 18371.554 |
| 4/29/10 | 17718.674 | 18356.764 |
| 4/30/10 | 17644.038 | 18282.817 |
| 5/3/10 | 17733.602 | 18371.554 |
| 5/4/10 | 17539.547 | 18179.29 |
| 5/5/10 | 17196.22 | 17839.131 |
| 5/6/10 | 16255.801 | 16907.39 |
| 5/7/10 | 16420.001 | 17070.075 |
| 5/10/10 | 16942.456 | 17587.709 |
| 5/11/10 | 17032.02 | 17676.446 |
| 5/12/10 | 17181.292 | 17824.341 |
| 5/13/10 | 17166.365 | 17809.552 |
| 5/14/10 | 16942.456 | 17587.709 |
| 5/17/10 | 16808.111 | 17454.603 |
| 5/18/10 | 16718.547 | 17365.866 |
| 5/19/10 | 16509.565 | 17158.812 |
| 5/20/10 | 15942.329 | 16596.81 |
| 5/21/10 | 16211.02 | 16863.022 |
| 5/24/10 | 16300.583 | 16951.759 |
| 5/25/10 | 16240.874 | 16892.601 |
| 5/26/10 | 16225.947 | 16877.811 |
| 5/27/10 | 16449.856 | 17099.654 |
| 5/28/10 | 16479.711 | 17129.233 |
| 6/1/10 | 16405.074 | 17055.286 |
| 6/2/10 | 16509.565 | 17158.812 |
| 6/3/10 | 16539.42 | 17188.391 |
| 6/4/10 | 16360.292 | 17010.917 |
| 6/7/10 | 16345.365 | 16996.128 |
| 6/8/10 | 16420.001 | 17070.075 |
| 6/9/10 | 16434.929 | 17084.865 |
| 6/10/10 | 16599.129 | 17247.55 |
| 6/11/10 | 16614.056 | 17262.339 |
| 6/14/10 | 16688.692 | 17336.287 |
| 6/15/10 | 16763.329 | 17410.234 |
| 6/16/10 | 16793.183 | 17439.813 |
| 6/17/10 | 16837.965 | 17484.182 |
| 6/18/10 | 16912.602 | 17558.13 |
| 6/21/10 | 16927.529 | 17572.919 |
| 6/22/10 | 16837.965 | 17484.182 |
| 6/23/10 | 16823.038 | 17469.392 |
| 6/24/10 | 16763.329 | 17410.234 |
| 6/25/10 | 16912.602 | 17558.13 |
| 6/28/10 | 16942.456 | 17587.709 |
| 6/29/10 | 16771.376 | 17419.108 |
| 6/30/10 | 16711.317 | 17359.95 |
| 7/1/10 | 16666.273 | 17315.581 |
| 7/2/10 | 16681.288 | 17330.371 |
| 7/6/10 | 16681.288 | 17330.371 |
| 7/7/10 | 16906.508 | 17552.214 |
| 7/8/10 | 16951.552 | 17596.582 |
| 7/9/10 | 17026.625 | 17670.53 |
| 7/12/10 | 17026.625 | 17670.53 |
| 7/13/10 | 17116.713 | 17759.267 |
| 7/14/10 | 17041.64 | 17685.32 |
| 7/15/10 | 17071.669 | 17714.899 |
| 7/16/10 | 17011.611 | 17655.741 |
| 7/19/10 | 17056.655 | 17700.109 |
| 7/20/10 | 17146.743 | 17788.846 |
| 7/21/10 | 17146.743 | 17788.846 |
| 7/22/10 | 17281.875 | 17921.952 |
| 7/23/10 | 17386.977 | 18025.479 |
| 7/26/10 | 17507.094 | 18143.795 |
| 7/27/10 | 17522.109 | 18158.585 |
| 7/28/10 | 17492.08 | 18129.006 |
| 7/29/10 | 17371.962 | 18010.689 |
| 7/30/10 | 17401.992 | 18040.268 |
| 8/2/10 | 17462.05 | 18099.426 |
| 8/3/10 | 17507.094 | 18143.795 |
| 8/4/10 | 17552.138 | 18188.164 |
| 8/5/10 | 17507.094 | 18143.795 |
| 8/6/10 | 17582.168 | 18217.743 |
| 8/9/10 | 17642.226 | 18276.901 |
| 8/10/10 | 17642.226 | 18276.901 |
| 8/11/10 | 17492.08 | 18129.006 |
| 8/12/10 | 17492.08 | 18129.006 |
| 8/13/10 | 17492.08 | 18129.006 |
| 8/16/10 | 17537.124 | 18173.374 |
| 8/17/10 | 17567.153 | 18202.953 |
| 8/18/10 | 17597.182 | 18232.532 |
| 8/19/10 | 17522.109 | 18158.585 |
| 8/20/10 | 17537.124 | 18173.374 |
| 8/23/10 | 17567.153 | 18202.953 |
| 8/24/10 | 17477.065 | 18114.216 |
| 8/25/10 | 17386.977 | 18025.479 |
| 8/26/10 | 17311.904 | 17951.531 |
| 8/27/10 | 17386.977 | 18025.479 |
| 8/30/10 | 17266.86 | 17907.163 |
| 8/31/10 | 17296.889 | 17936.742 |
| 9/1/10 | 17386.977 | 18025.479 |
| 9/2/10 | 17417.006 | 18055.058 |
| 9/3/10 | 17462.05 | 18099.426 |
| 9/7/10 | 17462.05 | 18099.426 |
| 9/8/10 | 17522.109 | 18158.585 |
| 9/9/10 | 17567.153 | 18202.953 |
| 9/10/10 | 17552.138 | 18188.164 |
| 9/13/10 | 17612.197 | 18247.322 |
| 9/14/10 | 17627.212 | 18262.111 |
| 9/15/10 | 17612.197 | 18247.322 |
| 9/16/10 | 17627.212 | 18262.111 |
| 9/17/10 | 17642.226 | 18276.901 |
| 9/20/10 | 17717.3 | 18350.848 |
| 9/21/10 | 17702.285 | 18336.059 |
| 9/22/10 | 17687.27 | 18321.269 |
| 9/23/10 | 17702.285 | 18336.059 |
| 9/24/10 | 17792.373 | 18424.796 |
| 9/27/10 | 17807.388 | 18439.586 |
| 9/28/10 | 17837.417 | 18469.165 |
| 9/29/10 | 17747.329 | 18380.428 |
| 9/30/10 | 17747.329 | 18380.428 |
| 10/1/10 | 17792.373 | 18424.796 |
| 10/4/10 | 17792.373 | 18424.796 |
| 10/5/10 | 17867.446 | 18498.744 |
| 10/6/10 | 17882.461 | 18513.533 |
| 10/7/10 | 17912.49 | 18543.112 |
| 10/8/10 | 17957.534 | 18587.481 |
| 10/11/10 | 17987.564 | 18617.06 |
| 10/12/10 | 18032.608 | 18661.429 |
| 10/13/10 | 18047.622 | 18676.218 |
| 10/14/10 | 18032.608 | 18661.429 |
| 10/15/10 | 18002.578 | 18631.85 |
| 10/18/10 | 18017.593 | 18646.639 |
| 10/19/10 | 17957.534 | 18587.481 |
| 10/20/10 | 18062.637 | 18691.008 |
| 10/21/10 | 18062.637 | 18691.008 |
| 10/22/10 | 18077.652 | 18705.797 |
| 10/25/10 | 18122.696 | 18750.166 |
| 10/26/10 | 18077.652 | 18705.797 |
| 10/27/10 | 18047.622 | 18676.218 |
| 10/28/10 | 17957.534 | 18587.481 |
| 10/29/10 | 18017.593 | 18646.639 |
| 11/1/10 | 18047.622 | 18676.218 |
| 11/2/10 | 18092.666 | 18720.587 |
| 11/3/10 | 18092.666 | 18720.587 |
| 11/4/10 | 18242.813 | 18868.482 |
| 11/5/10 | 18302.871 | 18927.64 |
| 11/8/10 | 18302.871 | 18927.64 |
| 11/9/10 | 18257.827 | 18883.272 |
| 11/10/10 | 18227.798 | 18853.692 |
| 11/11/10 | 18122.696 | 18750.166 |
| 11/12/10 | 17957.534 | 18587.481 |
| 11/15/10 | 17837.417 | 18469.165 |
| 11/16/10 | 17507.094 | 18143.795 |
| 11/17/10 | 17732.314 | 18365.638 |
| 11/18/10 | 17867.446 | 18498.744 |
| 11/19/10 | 17897.476 | 18528.323 |
| 11/22/10 | 17897.476 | 18528.323 |
| 11/23/10 | 17837.417 | 18469.165 |
| 11/24/10 | 17927.505 | 18557.902 |
| 11/26/10 | 17927.505 | 18557.902 |
| 11/29/10 | 17822.402 | 18454.375 |
| 11/30/10 | 17762.344 | 18395.217 |
| 12/1/10 | 17867.446 | 18498.744 |
| 12/2/10 | 17867.446 | 18498.744 |
| 12/3/10 | 17897.476 | 18528.323 |
| 12/6/10 | 17927.505 | 18557.902 |
| 12/7/10 | 17912.49 | 18543.112 |
| 12/8/10 | 17807.388 | 18439.586 |
| 12/9/10 | 17747.329 | 18380.428 |
| 12/10/10 | 17702.285 | 18336.059 |
| 12/13/10 | 17582.168 | 18217.743 |
| 12/14/10 | 17552.138 | 18188.164 |
| 12/15/10 | 17447.036 | 18084.637 |
| 12/16/10 | 17597.182 | 18232.532 |
| 12/17/10 | 17597.182 | 18232.532 |
| 12/20/10 | 17672.256 | 18306.48 |
| 12/21/10 | 17732.314 | 18365.638 |
| 12/22/10 | 17792.373 | 18424.796 |
| 12/23/10 | 17792.373 | 18424.796 |
| 12/27/10 | 17912.49 | 18543.112 |
| 12/28/10 | 17882.461 | 18513.533 |
| 12/29/10 | 17912.49 | 18543.112 |
| 12/30/10 | 18215.676 | 18846.298 |
| 12/31/10 | 17956.106 | 18594.876 |
| 1/3/11 | 17956.106 | 18594.876 |
| 1/4/11 | 17956.106 | 18594.876 |
| 1/5/11 | 18001.912 | 18639.244 |
| 1/6/11 | 17971.375 | 18609.665 |
| 1/7/11 | 17986.644 | 18624.455 |
| 1/10/11 | 17971.375 | 18609.665 |
| 1/11/11 | 18001.912 | 18639.244 |
| 1/12/11 | 18047.719 | 18683.613 |
| 1/13/11 | 18047.719 | 18683.613 |
| 1/14/11 | 18062.988 | 18698.402 |
| 1/18/11 | 18062.988 | 18698.402 |
| 1/19/11 | 17940.837 | 18580.086 |
| 1/20/11 | 17910.3 | 18550.507 |
| 1/21/11 | 17971.375 | 18609.665 |
| 1/24/11 | 18078.256 | 18713.192 |
| 1/25/11 | 18108.794 | 18742.771 |
| 1/26/11 | 18185.138 | 18816.719 |
| 1/27/11 | 18215.676 | 18846.298 |
| 1/28/11 | 18078.256 | 18713.192 |
| 1/31/11 | 18078.256 | 18713.192 |
| 2/1/11 | 18292.02 | 18920.245 |
| 2/2/11 | 18311.246 | 18939.472 |
| 2/3/11 | 18326.531 | 18954.261 |
| 2/4/11 | 18295.961 | 18924.682 |
| 2/7/11 | 18387.67 | 19013.419 |
| 2/8/11 | 18418.24 | 19042.998 |
| 2/9/11 | 18372.385 | 18998.63 |
| 2/10/11 | 18357.101 | 18983.84 |
| 2/11/11 | 18433.525 | 19057.788 |
| 2/14/11 | 18448.81 | 19072.578 |
| 2/15/11 | 18402.955 | 19028.209 |
| 2/16/11 | 18464.094 | 19087.367 |
| 2/17/11 | 18525.234 | 19146.525 |
| 2/18/11 | 18540.519 | 19161.315 |
| 2/22/11 | 18341.816 | 18969.051 |
| 2/23/11 | 18341.816 | 18969.051 |
| 2/24/11 | 18387.67 | 19013.419 |
| 2/25/11 | 18509.935 | 19134.694 |
| 2/28/11 | 18586.74 | 19208.641 |
| 3/1/11 | 18509.935 | 19134.694 |
| 3/2/11 | 18571.379 | 19193.852 |
| 3/3/11 | 18663.544 | 19282.589 |
| 3/4/11 | 18617.462 | 19238.22 |
| 3/7/11 | 18602.101 | 19223.431 |
| 3/8/11 | 18632.823 | 19253.01 |
| 3/9/11 | 18602.101 | 19223.431 |
| 3/10/11 | 18448.491 | 19075.535 |
| 3/11/11 | 18479.213 | 19105.114 |
| 3/14/11 | 18433.13 | 19060.746 |
| 3/15/11 | 18294.882 | 18927.64 |
| 3/16/11 | 18141.272 | 18779.745 |
| 3/17/11 | 18279.521 | 18912.851 |
| 3/18/11 | 18371.687 | 19001.588 |
| 3/21/11 | 18525.296 | 19149.483 |
| 3/22/11 | 18494.574 | 19119.904 |
| 3/23/11 | 18540.657 | 19164.273 |
| 3/24/11 | 18586.74 | 19208.641 |
| 3/25/11 | 18632.823 | 19253.01 |
| 3/28/11 | 18586.74 | 19208.641 |
| 3/29/11 | 18602.101 | 19223.431 |
| 3/30/11 | 18633.831 | 19257.447 |
| 3/31/11 | 18649.269 | 19272.236 |
| 4/1/11 | 18680.145 | 19301.815 |
| 4/4/11 | 18680.145 | 19301.815 |
| 4/5/11 | 18711.022 | 19331.394 |
| 4/6/11 | 18757.336 | 19375.763 |
| 4/7/11 | 18711.022 | 19331.394 |
| 4/8/11 | 18649.269 | 19272.236 |
| 4/11/11 | 18587.517 | 19213.078 |
| 4/12/11 | 18479.45 | 19109.551 |
| 4/13/11 | 18525.764 | 19153.92 |
| 4/14/11 | 18572.078 | 19198.289 |
| 4/15/11 | 18587.517 | 19213.078 |
| 4/18/11 | 18525.764 | 19153.92 |
| 4/19/11 | 18587.517 | 19213.078 |
| 4/20/11 | 18695.583 | 19316.605 |
| 4/21/11 | 18788.212 | 19405.342 |
| 4/25/11 | 18788.212 | 19405.342 |
| 4/26/11 | 18865.403 | 19479.29 |
| 4/27/11 | 18896.279 | 19508.869 |
| 4/28/11 | 18943.139 | 19557.674 |
| 4/29/11 | 19020.711 | 19631.622 |
| 5/2/11 | 19005.197 | 19616.832 |
| 5/3/11 | 18974.168 | 19587.253 |
| 5/4/11 | 18896.596 | 19513.305 |
| 5/5/11 | 18787.994 | 19409.779 |
| 5/6/11 | 18850.052 | 19468.937 |
| 5/9/11 | 18912.11 | 19528.095 |
| 5/10/11 | 19005.197 | 19616.832 |
| 5/11/11 | 18927.624 | 19542.885 |
| 5/12/11 | 18974.168 | 19587.253 |
| 5/13/11 | 18912.11 | 19528.095 |
| 5/16/11 | 18881.081 | 19498.516 |
| 5/17/11 | 18803.509 | 19424.568 |
| 5/18/11 | 18927.624 | 19542.885 |
| 5/19/11 | 18974.168 | 19587.253 |
| 5/20/11 | 18958.653 | 19572.464 |
| 5/23/11 | 18881.081 | 19498.516 |
| 5/24/11 | 18896.596 | 19513.305 |
| 5/25/11 | 18927.624 | 19542.885 |
| 5/26/11 | 18989.682 | 19602.043 |
| 5/27/11 | 19036.313 | 19650.848 |
| 5/31/11 | 19114.267 | 19724.796 |
| 6/1/11 | 18942.768 | 19562.111 |
| 6/2/11 | 18942.768 | 19562.111 |
| 6/3/11 | 18864.815 | 19488.163 |
| 6/6/11 | 18724.498 | 19355.058 |
| 6/7/11 | 18755.679 | 19384.637 |
| 6/8/11 | 18662.135 | 19295.899 |
| 6/9/11 | 18693.316 | 19325.478 |
| 6/10/11 | 18459.455 | 19103.636 |
| 6/13/11 | 18334.729 | 18985.319 |
| 6/14/11 | 18552.999 | 19192.373 |
| 6/15/11 | 18365.91 | 19014.898 |
| 6/16/11 | 18256.775 | 18911.372 |
| 6/17/11 | 18303.547 | 18955.74 |
| 6/20/11 | 18381.501 | 19029.688 |
| 6/21/11 | 18506.227 | 19148.004 |
| 6/22/11 | 18568.59 | 19207.162 |
| 6/23/11 | 18552.999 | 19192.373 |
| 6/24/11 | 18537.409 | 19177.583 |
| 6/27/11 | 18584.181 | 19221.952 |
| 6/28/11 | 18646.544 | 19281.11 |
| 6/29/11 | 18708.537 | 19344.705 |
| 6/30/11 | 18786.881 | 19418.653 |
| 7/1/11 | 18912.231 | 19536.969 |
| 7/5/11 | 18912.231 | 19536.969 |
| 7/6/11 | 18943.568 | 19566.548 |
| 7/7/11 | 19053.25 | 19670.075 |
| 7/8/11 | 19021.912 | 19640.495 |
| 7/11/11 | 18833.887 | 19463.021 |
| 7/12/11 | 18771.212 | 19403.863 |
| 7/13/11 | 18802.549 | 19433.442 |
| 7/14/11 | 18677.199 | 19315.126 |
| 7/15/11 | 18677.199 | 19315.126 |
| 7/18/11 | 18489.173 | 19137.651 |
| 7/19/11 | 18630.193 | 19270.757 |
| 7/20/11 | 18677.199 | 19315.126 |
| 7/21/11 | 18802.549 | 19433.442 |
| 7/22/11 | 18802.549 | 19433.442 |
| 7/25/11 | 18598.855 | 19241.178 |
| 7/26/11 | 18551.849 | 19196.81 |
| 7/27/11 | 18238.473 | 18901.019 |
| 7/28/11 | 18190.628 | 18861.087 |
| 7/29/11 | 18033.133 | 18713.192 |
| 8/1/11 | 18269.375 | 18935.035 |
| 8/2/11 | 18064.632 | 18742.771 |
| 8/3/11 | 18143.379 | 18816.719 |
| 8/4/11 | 17560.649 | 18269.506 |
| 8/5/11 | 17387.405 | 18106.821 |
| 8/8/11 | 16316.442 | 17101.133 |
| 8/9/11 | 17151.163 | 17884.978 |
| 8/10/11 | 16788.926 | 17544.819 |
| 8/11/11 | 17261.41 | 17988.505 |
| 8/12/11 | 17214.161 | 17944.136 |
| 8/15/11 | 17529.15 | 18239.927 |
| 8/16/11 | 17450.403 | 18165.979 |
| 8/17/11 | 17560.649 | 18269.506 |
| 8/18/11 | 17135.414 | 17870.189 |
| 8/19/11 | 16946.42 | 17692.714 |
| 8/22/11 | 16946.42 | 17692.714 |
| 8/23/11 | 17214.161 | 17944.136 |
| 8/24/11 | 17198.412 | 17929.347 |
| 8/25/11 | 16993.669 | 17737.083 |
| 8/26/11 | 17151.163 | 17884.978 |
| 8/29/11 | 17450.403 | 18165.979 |
| 8/30/11 | 17464.83 | 18185.206 |
| 8/31/11 | 17528.166 | 18244.364 |
| 9/1/11 | 17322.324 | 18052.1 |
| 9/2/11 | 17132.317 | 17874.626 |
| 9/6/11 | 17068.981 | 17815.467 |
| 9/7/11 | 17274.823 | 18007.731 |
| 9/8/11 | 17179.819 | 17918.994 |
| 9/9/11 | 17053.147 | 17800.678 |
| 9/12/11 | 17021.48 | 17771.099 |
| 9/13/11 | 17132.317 | 17874.626 |
| 9/14/11 | 17195.653 | 17933.784 |
| 9/15/11 | 17274.823 | 18007.731 |
| 9/16/11 | 17290.657 | 18022.521 |
| 9/19/11 | 17211.487 | 17948.573 |
| 9/20/11 | 17179.819 | 17918.994 |
| 9/21/11 | 16926.476 | 17682.362 |
| 9/22/11 | 16736.469 | 17504.887 |
| 9/23/11 | 16768.137 | 17534.466 |
| 9/26/11 | 16815.638 | 17578.835 |
| 9/27/11 | 16910.642 | 17667.572 |
| 9/28/11 | 16688.967 | 17460.519 |
| 9/29/11 | 16782.141 | 17553.693 |
| 9/30/11 | 16575.151 | 17361.429 |
| 10/3/11 | 16161.17 | 16976.901 |
| 10/4/11 | 16193.015 | 17006.48 |
| 10/5/11 | 16304.471 | 17110.007 |
| 10/6/11 | 16559.228 | 17346.639 |
| 10/7/11 | 16384.083 | 17183.955 |
| 10/10/11 | 16734.374 | 17509.324 |
| 10/11/11 | 16718.452 | 17494.535 |
| 10/12/11 | 16877.675 | 17642.43 |
| 10/13/11 | 16798.063 | 17568.482 |
| 10/14/11 | 16957.287 | 17716.378 |
| 10/17/11 | 16813.986 | 17583.272 |
| 10/18/11 | 16973.209 | 17731.167 |
| 10/19/11 | 16893.597 | 17657.22 |
| 10/20/11 | 16957.287 | 17716.378 |
| 10/21/11 | 17100.588 | 17849.483 |
| 10/24/11 | 17355.345 | 18086.116 |
| 10/25/11 | 17212.044 | 17953.01 |
| 10/26/11 | 17339.423 | 18071.326 |
| 10/27/11 | 17641.947 | 18352.327 |
| 10/28/11 | 17654.031 | 18370.075 |
| 10/31/11 | 17477.97 | 18207.39 |
| 11/1/11 | 17189.872 | 17941.178 |
| 11/2/11 | 17349.927 | 18089.074 |
| 11/3/11 | 17477.97 | 18207.39 |
| 11/4/11 | 17429.954 | 18163.021 |
| 11/7/11 | 17429.954 | 18163.021 |
| 11/8/11 | 17541.992 | 18266.548 |
| 11/9/11 | 17189.872 | 17941.178 |
| 11/10/11 | 17189.872 | 17941.178 |
| 11/11/11 | 17317.916 | 18059.495 |
| 11/14/11 | 17221.883 | 17970.758 |
| 11/15/11 | 17301.91 | 18044.705 |
| 11/16/11 | 17205.877 | 17955.968 |
| 11/17/11 | 17109.845 | 17867.231 |
| 11/18/11 | 17157.861 | 17911.599 |
| 11/21/11 | 16965.795 | 17734.125 |
| 11/22/11 | 16917.779 | 17689.756 |
| 11/23/11 | 16645.686 | 17438.334 |
| 11/25/11 | 16629.681 | 17423.545 |
| 11/28/11 | 16837.752 | 17615.809 |
| 11/29/11 | 16818.887 | 17605.456 |
| 11/30/11 | 17172.969 | 17930.826 |
| 12/1/11 | 17108.591 | 17871.668 |
| 12/2/11 | 17189.064 | 17945.615 |
| 12/5/11 | 17317.821 | 18063.932 |
| 12/6/11 | 17350.01 | 18093.511 |
| 12/7/11 | 17398.294 | 18137.879 |
| 12/8/11 | 17172.969 | 17930.826 |
| 12/9/11 | 17301.726 | 18049.142 |
| 12/12/11 | 17189.064 | 17945.615 |
| 12/13/11 | 17156.875 | 17916.036 |
| 12/14/11 | 17124.685 | 17886.457 |
| 12/15/11 | 17205.159 | 17960.405 |
| 12/16/11 | 17253.442 | 18004.773 |
| 12/19/11 | 17124.685 | 17886.457 |
| 12/20/11 | 17382.199 | 18123.09 |
| 12/21/11 | 17430.483 | 18167.458 |
| 12/22/11 | 17543.146 | 18270.985 |
| 12/23/11 | 17591.43 | 18315.354 |
| 12/27/11 | 17607.524 | 18330.143 |
| 12/28/11 | 17462.673 | 18197.037 |
| 12/29/11 | 17505.996 | 18254.717 |
| 12/30/11 | 17489.696 | 18239.927 |
| 1/3/12 | 17620.094 | 18358.243 |
| 1/4/12 | 17571.195 | 18313.875 |
| 1/5/12 | 17587.495 | 18328.664 |
| 1/6/12 | 17603.795 | 18343.454 |
| 1/9/12 | 17652.694 | 18387.822 |
| 1/10/12 | 17750.493 | 18476.559 |
| 1/11/12 | 17766.793 | 18491.349 |
| 1/12/12 | 17783.092 | 18506.139 |
| 1/13/12 | 17766.793 | 18491.349 |
| 1/17/12 | 17815.692 | 18535.718 |
| 1/18/12 | 17913.491 | 18624.455 |
| 1/19/12 | 17994.99 | 18698.402 |
| 1/20/12 | 18060.189 | 18757.561 |
| 1/23/12 | 18076.489 | 18772.35 |
| 1/24/12 | 18092.789 | 18787.14 |
| 1/25/12 | 18190.588 | 18875.877 |
| 1/26/12 | 18272.087 | 18949.824 |
| 1/27/12 | 18255.787 | 18935.035 |
| 1/30/12 | 18206.888 | 18890.666 |
| 1/31/12 | 18223.187 | 18905.456 |
| 2/1/12 | 18353.586 | 19023.772 |
| 2/2/12 | 18403.933 | 19071.099 |
| 2/3/12 | 18501.826 | 19159.836 |
| 2/6/12 | 18452.879 | 19115.467 |
| 2/7/12 | 18485.511 | 19145.046 |
| 2/8/12 | 18452.879 | 19115.467 |
| 2/9/12 | 18469.195 | 19130.257 |
| 2/10/12 | 18354.986 | 19026.73 |
| 2/13/12 | 18469.195 | 19130.257 |
| 2/14/12 | 18420.248 | 19085.888 |
| 2/15/12 | 18371.302 | 19041.519 |
| 2/16/12 | 18501.826 | 19159.836 |
| 2/17/12 | 18550.773 | 19204.204 |
| 2/21/12 | 18567.088 | 19218.994 |
| 2/22/12 | 18518.142 | 19174.625 |
| 2/23/12 | 18632.35 | 19278.152 |
| 2/24/12 | 18632.35 | 19278.152 |
| 2/27/12 | 18648.666 | 19292.942 |
| 2/28/12 | 18658.783 | 19310.689 |
| 2/29/12 | 18593.199 | 19251.531 |
| 3/1/12 | 18609.595 | 19266.32 |
| 3/2/12 | 18560.407 | 19221.952 |
| 3/5/12 | 18576.803 | 19236.741 |
| 3/6/12 | 18330.861 | 19014.898 |
| 3/7/12 | 18478.426 | 19148.004 |
| 3/8/12 | 18511.218 | 19177.583 |
| 3/9/12 | 18560.407 | 19221.952 |
| 3/12/12 | 18576.803 | 19236.741 |
| 3/13/12 | 18740.764 | 19384.637 |
| 3/14/12 | 18609.595 | 19266.32 |
| 3/15/12 | 18658.783 | 19310.689 |
| 3/16/12 | 18593.199 | 19251.531 |
| 3/19/12 | 18625.991 | 19281.11 |
| 3/20/12 | 18593.199 | 19251.531 |
| 3/21/12 | 18576.803 | 19236.741 |
| 3/22/12 | 18494.822 | 19162.794 |
| 3/23/12 | 18560.407 | 19221.952 |
| 3/26/12 | 18691.576 | 19340.268 |
| 3/27/12 | 18625.991 | 19281.11 |
| 3/28/12 | 18560.407 | 19221.952 |
| 3/29/12 | 18553.725 | 19224.91 |
| 3/30/12 | 18570.203 | 19239.699 |
| 4/2/12 | 18685.545 | 19343.226 |
| 4/3/12 | 18603.158 | 19269.278 |
| 4/4/12 | 18520.77 | 19195.331 |
| 4/5/12 | 18471.337 | 19150.962 |
| 4/9/12 | 18372.472 | 19062.225 |
| 4/10/12 | 18191.219 | 18899.54 |
| 4/11/12 | 18323.039 | 19017.856 |
| 4/12/12 | 18421.905 | 19106.593 |
| 4/13/12 | 18339.517 | 19032.646 |
| 4/16/12 | 18388.949 | 19077.014 |
| 4/17/12 | 18454.86 | 19136.172 |
| 4/18/12 | 18405.427 | 19091.804 |
| 4/19/12 | 18388.949 | 19077.014 |
| 4/20/12 | 18471.337 | 19150.962 |
| 4/23/12 | 18421.905 | 19106.593 |
| 4/24/12 | 18504.292 | 19180.541 |
| 4/25/12 | 18586.68 | 19254.489 |
| 4/26/12 | 18636.113 | 19298.857 |
| 4/27/12 | 18678.375 | 19346.184 |
| 4/30/12 | 18678.375 | 19346.184 |
| 5/1/12 | 18678.375 | 19346.184 |
| 5/2/12 | 18711.493 | 19375.763 |
| 5/3/12 | 18711.493 | 19375.763 |
| 5/4/12 | 18628.699 | 19301.815 |
| 5/7/12 | 18645.258 | 19316.605 |
| 5/8/12 | 18678.375 | 19346.184 |
| 5/9/12 | 18661.816 | 19331.394 |
| 5/10/12 | 18711.493 | 19375.763 |
| 5/11/12 | 18711.493 | 19375.763 |
| 5/14/12 | 18579.022 | 19257.447 |
| 5/15/12 | 18529.346 | 19213.078 |
| 5/16/12 | 18479.669 | 19168.709 |
| 5/17/12 | 18214.728 | 18932.077 |
| 5/18/12 | 18098.816 | 18828.55 |
| 5/21/12 | 18314.081 | 19020.814 |
| 5/22/12 | 18314.081 | 19020.814 |
| 5/23/12 | 18380.316 | 19079.972 |
| 5/24/12 | 18413.434 | 19109.551 |
| 5/25/12 | 18413.434 | 19109.551 |
| 5/29/12 | 18512.787 | 19198.289 |
| 5/30/12 | 18372.658 | 19082.93 |
| 5/31/12 | 18372.658 | 19082.93 |
| 6/1/12 | 18172.955 | 18905.456 |
| 6/4/12 | 18156.313 | 18890.666 |
| 6/5/12 | 18289.449 | 19008.983 |
| 6/6/12 | 18505.793 | 19201.246 |
| 6/7/12 | 18472.509 | 19171.667 |
| 6/8/12 | 18572.361 | 19260.405 |
| 6/11/12 | 18472.509 | 19171.667 |
| 6/12/12 | 18572.361 | 19260.405 |
| 6/13/12 | 18572.361 | 19260.405 |
| 6/14/12 | 18672.212 | 19349.142 |
| 6/15/12 | 18705.496 | 19378.721 |
| 6/18/12 | 18722.138 | 19393.51 |
| 6/19/12 | 18838.631 | 19497.037 |
| 6/20/12 | 18855.273 | 19511.827 |
| 6/21/12 | 18755.422 | 19423.089 |
| 6/22/12 | 18855.273 | 19511.827 |
| 6/25/12 | 18805.347 | 19467.458 |
| 6/26/12 | 18838.631 | 19497.037 |
| 6/27/12 | 18971.766 | 19615.353 |
| 6/28/12 | 18983.21 | 19636.059 |
| 6/29/12 | 19100.287 | 19739.585 |
| 7/2/12 | 19267.54 | 19887.481 |
| 7/3/12 | 19300.991 | 19917.06 |
| 7/5/12 | 19284.265 | 19902.27 |
| 7/6/12 | 19300.991 | 19917.06 |
| 7/9/12 | 19334.441 | 19946.639 |
| 7/10/12 | 19284.265 | 19902.27 |
| 7/11/12 | 19267.54 | 19887.481 |
| 7/12/12 | 19250.815 | 19872.691 |
| 7/13/12 | 19367.892 | 19976.218 |
| 7/16/12 | 19401.342 | 20005.797 |
| 7/17/12 | 19468.244 | 20064.955 |
| 7/18/12 | 19468.244 | 20064.955 |
| 7/19/12 | 19434.793 | 20035.376 |
| 7/20/12 | 19434.793 | 20035.376 |
| 7/23/12 | 19401.342 | 20005.797 |
| 7/24/12 | 19367.892 | 19976.218 |
| 7/25/12 | 19384.617 | 19991.007 |
| 7/26/12 | 19451.518 | 20050.165 |
| 7/27/12 | 19535.145 | 20124.113 |
| 7/30/12 | 19546.171 | 20144.818 |
| 7/31/12 | 19546.171 | 20144.818 |
| 8/1/12 | 19495.751 | 20100.45 |
| 8/2/12 | 19462.138 | 20070.871 |
| 8/3/12 | 19562.978 | 20159.608 |
| 8/6/12 | 19562.978 | 20159.608 |
| 8/7/12 | 19512.558 | 20115.239 |
| 8/8/12 | 19546.171 | 20144.818 |
| 8/9/12 | 19630.205 | 20218.766 |
| 8/10/12 | 19630.205 | 20218.766 |
| 8/13/12 | 19680.625 | 20263.135 |
| 8/14/12 | 19697.431 | 20277.924 |
| 8/15/12 | 19680.625 | 20263.135 |
| 8/16/12 | 19697.431 | 20277.924 |
| 8/17/12 | 19731.045 | 20307.503 |
| 8/20/12 | 19764.658 | 20337.082 |
| 8/21/12 | 19731.045 | 20307.503 |
| 8/22/12 | 19731.045 | 20307.503 |
| 8/23/12 | 19680.625 | 20263.135 |
| 8/24/12 | 19798.271 | 20366.661 |
| 8/27/12 | 19831.885 | 20396.24 |
| 8/28/12 | 19865.498 | 20425.819 |
| 8/29/12 | 19932.725 | 20484.978 |
| 8/30/12 | 19894.403 | 20462.793 |
| 8/31/12 | 19978.845 | 20536.741 |
| 9/4/12 | 20046.398 | 20595.899 |
| 9/5/12 | 20029.51 | 20581.11 |
| 9/6/12 | 20113.951 | 20655.057 |
| 9/7/12 | 20130.839 | 20669.847 |
| 9/10/12 | 20164.616 | 20699.426 |
| 9/11/12 | 20232.169 | 20758.584 |
| 9/12/12 | 20282.834 | 20802.952 |
| 9/13/12 | 20350.387 | 20862.111 |
| 9/14/12 | 20401.052 | 20906.479 |
| 9/17/12 | 20401.052 | 20906.479 |
| 9/18/12 | 20333.499 | 20847.321 |
| 9/19/12 | 20417.94 | 20921.269 |
| 9/20/12 | 20434.829 | 20936.058 |
| 9/21/12 | 20519.27 | 21010.006 |
| 9/24/12 | 20502.382 | 20995.216 |
| 9/25/12 | 20350.387 | 20862.111 |
| 9/26/12 | 20299.722 | 20817.742 |
| 9/27/12 | 20360.599 | 20882.816 |
| 9/28/12 | 20326.664 | 20853.237 |
| 10/1/12 | 20377.566 | 20897.605 |
| 10/2/12 | 20411.5 | 20927.185 |
| 10/3/12 | 20411.5 | 20927.185 |
| 10/4/12 | 20479.369 | 20986.343 |
| 10/5/12 | 20496.336 | 21001.132 |
| 10/8/12 | 20479.369 | 20986.343 |
| 10/9/12 | 20343.632 | 20868.026 |
| 10/10/12 | 20207.894 | 20749.71 |
| 10/11/12 | 20258.796 | 20794.079 |
| 10/12/12 | 20156.993 | 20705.342 |
| 10/15/12 | 20089.124 | 20646.183 |
| 10/16/12 | 20224.861 | 20764.5 |
| 10/17/12 | 20343.632 | 20868.026 |
| 10/18/12 | 20360.599 | 20882.816 |
| 10/19/12 | 20258.796 | 20794.079 |
| 10/22/12 | 20275.763 | 20808.868 |
| 10/23/12 | 20173.96 | 20720.131 |
| 10/24/12 | 20224.861 | 20764.5 |
| 10/25/12 | 20224.861 | 20764.5 |
| 10/26/12 | 20190.927 | 20734.921 |
| 10/31/12 | 20304.026 | 20845.842 |
| 11/1/12 | 20355.17 | 20890.211 |
| 11/2/12 | 20269.93 | 20816.263 |
| 11/5/12 | 20269.93 | 20816.263 |
| 11/6/12 | 20235.835 | 20786.684 |
| 11/7/12 | 19963.069 | 20550.052 |
| 11/8/12 | 19894.877 | 20490.893 |
| 11/9/12 | 19860.781 | 20461.314 |
| 11/12/12 | 19894.877 | 20490.893 |
| 11/13/12 | 19639.159 | 20269.05 |
| 11/14/12 | 19178.866 | 19869.733 |
| 11/15/12 | 19349.345 | 20017.628 |
| 11/16/12 | 19656.207 | 20283.84 |
| 11/19/12 | 19809.638 | 20416.946 |
| 11/20/12 | 19775.542 | 20387.367 |
| 11/21/12 | 19809.638 | 20416.946 |
| 11/23/12 | 19928.973 | 20520.472 |
| 11/26/12 | 19963.069 | 20550.052 |
| 11/27/12 | 19946.021 | 20535.262 |
| 11/28/12 | 19963.069 | 20550.052 |
| 11/29/12 | 20076.248 | 20660.973 |
| 11/30/12 | 20161.898 | 20734.921 |
| 12/3/12 | 20144.768 | 20720.131 |
| 12/4/12 | 20110.508 | 20690.552 |
| 12/5/12 | 20076.248 | 20660.973 |
| 12/6/12 | 20127.638 | 20705.342 |
| 12/7/12 | 20127.638 | 20705.342 |
| 12/10/12 | 20161.898 | 20734.921 |
| 12/11/12 | 20196.158 | 20764.5 |
| 12/12/12 | 20127.638 | 20705.342 |
| 12/13/12 | 20093.378 | 20675.763 |
| 12/14/12 | 20076.248 | 20660.973 |
| 12/17/12 | 20196.158 | 20764.5 |
| 12/18/12 | 20298.937 | 20853.237 |
| 12/19/12 | 20350.327 | 20897.605 |
| 12/20/12 | 20418.846 | 20956.764 |
| 12/21/12 | 20384.587 | 20927.185 |
| 12/24/12 | 20350.327 | 20897.605 |
| 12/26/12 | 20333.197 | 20882.816 |
| 12/27/12 | 20298.937 | 20853.237 |
| 12/28/12 | 20237.21 | 20826.616 |
| 12/31/12 | 20375.584 | 20944.932 |
| 1/2/13 | 20669.629 | 21196.354 |
| 1/3/13 | 20686.926 | 21211.144 |
| 1/4/13 | 20808.003 | 21314.67 |
| 1/7/13 | 20825.3 | 21329.46 |
| 1/8/13 | 20842.597 | 21344.249 |
| 1/9/13 | 20894.487 | 21388.618 |
| 1/10/13 | 20929.081 | 21418.197 |
| 1/11/13 | 20946.378 | 21432.986 |
| 1/14/13 | 20929.081 | 21418.197 |
| 1/15/13 | 20946.378 | 21432.986 |
| 1/16/13 | 20946.378 | 21432.986 |
| 1/17/13 | 20998.268 | 21477.355 |
| 1/18/13 | 21050.158 | 21521.724 |
| 1/22/13 | 21153.939 | 21610.461 |
| 1/23/13 | 21153.939 | 21610.461 |
| 1/24/13 | 21102.048 | 21566.092 |
| 1/25/13 | 21119.345 | 21580.882 |
| 1/28/13 | 21171.235 | 21625.25 |
| 1/29/13 | 21205.829 | 21654.829 |
| 1/30/13 | 21136.642 | 21595.671 |
| 1/31/13 | 21171.235 | 21625.25 |
| 2/1/13 | 21240.423 | 21684.408 |
| 2/4/13 | 21171.686 | 21628.208 |
| 2/5/13 | 21206.309 | 21657.787 |
| 2/6/13 | 21188.997 | 21642.998 |
| 2/7/13 | 21119.752 | 21583.84 |
| 2/8/13 | 21171.686 | 21628.208 |
| 2/11/13 | 21188.997 | 21642.998 |
| 2/12/13 | 21223.62 | 21672.577 |
| 2/13/13 | 21327.488 | 21761.314 |
| 2/14/13 | 21344.799 | 21776.104 |
| 2/15/13 | 21310.176 | 21746.524 |
| 2/19/13 | 21414.044 | 21835.262 |
| 2/20/13 | 21258.242 | 21702.156 |
| 2/21/13 | 21119.752 | 21583.84 |
| 2/22/13 | 21258.242 | 21702.156 |
| 2/25/13 | 21137.064 | 21598.629 |
| 2/26/13 | 21223.62 | 21672.577 |
| 2/27/13 | 21285.129 | 21739.13 |
| 2/28/13 | 21354.689 | 21798.288 |
| 3/1/13 | 21389.468 | 21827.867 |
| 3/4/13 | 21424.248 | 21857.446 |
| 3/5/13 | 21476.417 | 21901.815 |
| 3/6/13 | 21441.638 | 21872.235 |
| 3/7/13 | 21493.807 | 21916.604 |
| 3/8/13 | 21476.417 | 21901.815 |
| 3/11/13 | 21528.587 | 21946.183 |
| 3/12/13 | 21545.977 | 21960.973 |
| 3/13/13 | 21580.756 | 21990.552 |
| 3/14/13 | 21632.926 | 22034.92 |
| 3/15/13 | 21650.315 | 22049.71 |
| 3/18/13 | 21615.536 | 22020.131 |
| 3/19/13 | 21493.807 | 21916.604 |
| 3/20/13 | 21563.366 | 21975.762 |
| 3/21/13 | 21545.977 | 21960.973 |
| 3/22/13 | 21615.536 | 22020.131 |
| 3/25/13 | 21580.756 | 21990.552 |
| 3/26/13 | 21615.536 | 22020.131 |
| 3/27/13 | 21624.719 | 22042.315 |
| 3/28/13 | 21677.121 | 22086.684 |
| 4/1/13 | 21589.784 | 22012.736 |
| 4/2/13 | 21624.719 | 22042.315 |
| 4/3/13 | 21450.044 | 21894.42 |
| 4/4/13 | 21537.381 | 21968.367 |
| 4/5/13 | 21572.316 | 21997.946 |
| 4/8/13 | 21659.654 | 22071.894 |
| 4/9/13 | 21642.186 | 22057.105 |
| 4/10/13 | 21729.523 | 22131.052 |
| 4/11/13 | 21729.523 | 22131.052 |
| 4/12/13 | 21712.056 | 22116.263 |
| 4/15/13 | 21397.642 | 21850.051 |
| 4/16/13 | 21607.251 | 22027.526 |
| 4/17/13 | 21397.642 | 21850.051 |
| 4/18/13 | 21380.174 | 21835.262 |
| 4/19/13 | 21484.979 | 21923.999 |
| 4/22/13 | 21642.186 | 22057.105 |
| 4/23/13 | 21764.458 | 22160.631 |
| 4/24/13 | 21816.861 | 22205 |
| 4/25/13 | 21834.328 | 22219.789 |
| 4/26/13 | 21886.731 | 22264.158 |
| 4/29/13 | 21982.863 | 22360.29 |
| 4/30/13 | 22053.039 | 22419.448 |
| 5/1/13 | 21842.509 | 22241.974 |
| 5/2/13 | 22000.407 | 22375.079 |
| 5/3/13 | 21965.318 | 22345.5 |
| 5/6/13 | 22017.951 | 22389.869 |
| 5/7/13 | 22070.583 | 22434.238 |
| 5/8/13 | 22140.76 | 22493.396 |
| 5/9/13 | 22053.039 | 22419.448 |
| 5/10/13 | 22017.951 | 22389.869 |
| 5/13/13 | 21930.23 | 22315.921 |
| 5/14/13 | 21930.23 | 22315.921 |
| 5/15/13 | 21877.597 | 22271.553 |
| 5/16/13 | 21947.774 | 22330.711 |
| 5/17/13 | 22000.407 | 22375.079 |
| 5/20/13 | 21982.863 | 22360.29 |
| 5/21/13 | 21912.686 | 22301.132 |
| 5/22/13 | 21772.332 | 22182.816 |
| 5/23/13 | 21719.7 | 22138.447 |
| 5/24/13 | 21702.156 | 22123.657 |
| 5/28/13 | 21491.625 | 21946.183 |
| 5/29/13 | 21368.816 | 21842.656 |
| 5/30/13 | 21324.595 | 21820.472 |
| 5/31/13 | 21095.487 | 21628.208 |
| 6/3/13 | 20989.746 | 21539.471 |
| 6/4/13 | 20972.122 | 21524.682 |
| 6/5/13 | 20795.886 | 21376.786 |
| 6/6/13 | 20919.251 | 21480.313 |
| 6/7/13 | 20972.122 | 21524.682 |
| 6/10/13 | 20989.746 | 21539.471 |
| 6/11/13 | 20813.509 | 21391.576 |
| 6/12/13 | 20637.273 | 21243.68 |
| 6/13/13 | 20884.004 | 21450.734 |
| 6/14/13 | 20901.627 | 21465.523 |
| 6/17/13 | 20954.498 | 21509.892 |
| 6/18/13 | 21024.993 | 21569.05 |
| 6/19/13 | 20831.133 | 21406.365 |
| 6/20/13 | 20425.789 | 21066.206 |
| 6/21/13 | 20372.918 | 21021.838 |
| 6/24/13 | 20090.94 | 20785.205 |
| 6/25/13 | 20267.177 | 20933.1 |
| 6/26/13 | 20425.789 | 21066.206 |
| 6/27/13 | 20610.039 | 21236.286 |
| 6/28/13 | 20680.864 | 21295.444 |
| 7/1/13 | 20716.277 | 21325.023 |
| 7/2/13 | 20680.864 | 21295.444 |
| 7/3/13 | 20627.746 | 21251.075 |
| 7/5/13 | 20503.802 | 21147.549 |
| 7/8/13 | 20574.627 | 21206.707 |
| 7/9/13 | 20645.452 | 21265.865 |
| 7/10/13 | 20680.864 | 21295.444 |
| 7/11/13 | 20911.045 | 21487.708 |
| 7/12/13 | 20928.751 | 21502.497 |
| 7/15/13 | 21017.282 | 21576.445 |
| 7/16/13 | 20981.87 | 21546.866 |
| 7/17/13 | 21052.695 | 21606.024 |
| 7/18/13 | 21123.52 | 21665.182 |
| 7/19/13 | 21158.932 | 21694.761 |
| 7/22/13 | 21176.638 | 21709.551 |
| 7/23/13 | 21194.345 | 21724.34 |
| 7/24/13 | 21034.989 | 21591.234 |
| 7/25/13 | 21034.989 | 21591.234 |
| 7/26/13 | 21034.989 | 21591.234 |
| 7/29/13 | 20999.576 | 21561.655 |
| 7/30/13 | 21042.59 | 21613.419 |
| 7/31/13 | 20989.227 | 21569.05 |
| 8/1/13 | 20989.227 | 21569.05 |
| 8/2/13 | 21042.59 | 21613.419 |
| 8/5/13 | 20989.227 | 21569.05 |
| 8/6/13 | 20918.077 | 21509.892 |
| 8/7/13 | 20793.565 | 21406.365 |
| 8/8/13 | 20829.14 | 21435.944 |
| 8/9/13 | 20811.352 | 21421.155 |
| 8/12/13 | 20829.14 | 21435.944 |
| 8/13/13 | 20793.565 | 21406.365 |
| 8/14/13 | 20740.202 | 21361.997 |
| 8/15/13 | 20562.328 | 21214.101 |
| 8/16/13 | 20508.965 | 21169.733 |
| 8/19/13 | 20313.303 | 21007.048 |
| 8/20/13 | 20455.603 | 21125.364 |
| 8/21/13 | 20402.24 | 21080.996 |
| 8/22/13 | 20508.965 | 21169.733 |
| 8/23/13 | 20597.903 | 21243.68 |
| 8/26/13 | 20580.115 | 21228.891 |
| 8/27/13 | 20420.028 | 21095.785 |
| 8/28/13 | 20437.815 | 21110.575 |
| 8/29/13 | 20498.372 | 21177.128 |
| 8/30/13 | 20426.887 | 21117.969 |
| 9/3/13 | 20426.887 | 21117.969 |
| 9/4/13 | 20516.243 | 21191.917 |
| 9/5/13 | 20480.501 | 21162.338 |
| 9/6/13 | 20516.243 | 21191.917 |
| 9/9/13 | 20641.343 | 21295.444 |
| 9/10/13 | 20694.956 | 21339.812 |
| 9/11/13 | 20730.699 | 21369.391 |
| 9/12/13 | 20730.699 | 21369.391 |
| 9/13/13 | 20784.313 | 21413.76 |
| 9/16/13 | 20855.798 | 21472.918 |
| 9/17/13 | 20891.541 | 21502.497 |
| 9/18/13 | 21052.382 | 21635.603 |
| 9/19/13 | 21034.511 | 21620.813 |
| 9/20/13 | 20980.897 | 21576.445 |
| 9/23/13 | 20980.897 | 21576.445 |
| 9/24/13 | 20998.768 | 21591.234 |
| 9/25/13 | 21034.511 | 21620.813 |
| 9/26/13 | 21016.64 | 21606.024 |
| 9/27/13 | 20987.673 | 21598.629 |
| 9/30/13 | 20915.858 | 21539.471 |
| 10/1/13 | 20987.673 | 21598.629 |
| 10/2/13 | 20933.812 | 21554.261 |
| 10/3/13 | 20861.998 | 21495.102 |
| 10/4/13 | 20915.858 | 21539.471 |
| 10/7/13 | 20861.998 | 21495.102 |
| 10/8/13 | 20790.184 | 21435.944 |
| 10/9/13 | 20772.23 | 21421.155 |
| 10/10/13 | 20951.766 | 21569.05 |
| 10/11/13 | 21059.487 | 21657.787 |
| 10/14/13 | 21077.44 | 21672.577 |
| 10/15/13 | 21005.626 | 21613.419 |
| 10/16/13 | 21095.394 | 21687.366 |
| 10/17/13 | 21239.022 | 21805.683 |
| 10/18/13 | 21346.743 | 21894.42 |
| 10/21/13 | 21364.697 | 21909.209 |
| 10/22/13 | 21436.511 | 21968.367 |
| 10/23/13 | 21472.418 | 21997.946 |
| 10/24/13 | 21490.371 | 22012.736 |
| 10/25/13 | 21526.278 | 22042.315 |
| 10/28/13 | 21508.325 | 22027.526 |
| 10/29/13 | 21508.325 | 22027.526 |
| 10/30/13 | 21371.061 | 21931.394 |
| 10/31/13 | 21334.992 | 21901.815 |
| 11/1/13 | 21316.957 | 21887.025 |
| 11/4/13 | 21371.061 | 21931.394 |
| 11/5/13 | 21334.992 | 21901.815 |
| 11/6/13 | 21371.061 | 21931.394 |
| 11/7/13 | 21244.818 | 21827.867 |
| 11/8/13 | 21298.922 | 21872.235 |
| 11/11/13 | 21280.888 | 21857.446 |
| 11/12/13 | 21226.784 | 21813.077 |
| 11/13/13 | 21280.888 | 21857.446 |
| 11/14/13 | 21353.026 | 21916.604 |
| 11/15/13 | 21389.096 | 21946.183 |
| 11/18/13 | 21407.13 | 21960.973 |
| 11/19/13 | 21353.026 | 21916.604 |
| 11/20/13 | 21334.992 | 21901.815 |
| 11/21/13 | 21425.165 | 21975.762 |
| 11/22/13 | 21479.269 | 22020.131 |
| 11/25/13 | 21515.338 | 22049.71 |
| 11/26/13 | 21479.269 | 22020.131 |
| 11/27/13 | 21522.776 | 22073.373 |
| 11/29/13 | 21559.009 | 22102.952 |
| 12/2/13 | 21432.192 | 21999.425 |
| 12/3/13 | 21341.608 | 21925.478 |
| 12/4/13 | 21341.608 | 21925.478 |
| 12/5/13 | 21269.14 | 21866.32 |
| 12/6/13 | 21377.841 | 21955.057 |
| 12/9/13 | 21414.075 | 21984.636 |
| 12/10/13 | 21377.841 | 21955.057 |
| 12/11/13 | 21377.841 | 21955.057 |
| 12/12/13 | 21305.374 | 21895.899 |
| 12/13/13 | 21305.374 | 21895.899 |
| 12/16/13 | 21377.841 | 21955.057 |
| 12/17/13 | 21450.309 | 22014.215 |
| 12/18/13 | 21559.009 | 22102.952 |
| 12/19/13 | 21504.659 | 22058.584 |
| 12/20/13 | 21595.243 | 22132.531 |
| 12/23/13 | 21667.71 | 22191.689 |
| 12/24/13 | 21703.944 | 22221.268 |
| 12/26/13 | 21703.944 | 22221.268 |
| 12/27/13 | 21722.061 | 22236.058 |
| 12/30/13 | 21656.252 | 22216.832 |
| 12/31/13 | 21711.078 | 22261.2 |
| 1/2/14 | 21656.252 | 22216.832 |
| 1/3/14 | 21711.078 | 22261.2 |
| 1/6/14 | 21747.629 | 22290.779 |
| 1/7/14 | 21784.18 | 22320.358 |
| 1/8/14 | 21784.18 | 22320.358 |
| 1/9/14 | 21784.18 | 22320.358 |
| 1/10/14 | 21839.006 | 22364.727 |
| 1/13/14 | 21802.455 | 22335.148 |
| 1/14/14 | 21839.006 | 22364.727 |
| 1/15/14 | 21930.382 | 22438.674 |
| 1/16/14 | 21912.107 | 22423.885 |
| 1/17/14 | 21948.657 | 22453.464 |
| 1/21/14 | 22040.034 | 22527.412 |
| 1/22/14 | 22058.309 | 22542.201 |
| 1/23/14 | 22003.483 | 22497.833 |
| 1/24/14 | 21784.18 | 22320.358 |
| 1/27/14 | 21674.528 | 22231.621 |
| 1/28/14 | 21747.629 | 22290.779 |
| 1/29/14 | 21637.977 | 22202.042 |
| 1/30/14 | 21765.904 | 22305.569 |
| 1/31/14 | 21692.803 | 22246.411 |
| 2/3/14 | 21455.224 | 22054.147 |
| 2/4/14 | 21509.522 | 22101.473 |
| 2/5/14 | 21472.941 | 22071.894 |
| 2/6/14 | 21582.684 | 22160.631 |
| 2/7/14 | 21692.426 | 22249.368 |
| 2/10/14 | 21747.297 | 22293.737 |
| 2/11/14 | 21820.459 | 22352.895 |
| 2/12/14 | 21857.04 | 22382.474 |
| 2/13/14 | 21948.492 | 22456.422 |
| 2/14/14 | 21985.073 | 22486.001 |
| 2/18/14 | 22076.525 | 22559.949 |
| 2/19/14 | 22003.363 | 22500.79 |
| 2/20/14 | 22076.525 | 22559.949 |
| 2/21/14 | 22113.105 | 22589.528 |
| 2/24/14 | 22186.267 | 22648.686 |
| 2/25/14 | 22094.815 | 22574.738 |
| 2/26/14 | 22094.815 | 22574.738 |
| 2/27/14 | 22172.657 | 22656.081 |
| 2/28/14 | 22227.767 | 22700.449 |
| 3/3/14 | 22172.657 | 22656.081 |
| 3/4/14 | 22227.767 | 22700.449 |
| 3/5/14 | 22209.397 | 22685.66 |
| 3/6/14 | 22209.397 | 22685.66 |
| 3/7/14 | 22117.546 | 22611.712 |
| 3/10/14 | 22117.546 | 22611.712 |
| 3/11/14 | 22062.436 | 22567.343 |
| 3/12/14 | 22099.176 | 22596.922 |
| 3/13/14 | 22044.066 | 22552.554 |
| 3/14/14 | 22044.066 | 22552.554 |
| 3/17/14 | 22080.806 | 22582.133 |
| 3/18/14 | 22154.287 | 22641.291 |
| 3/19/14 | 22099.176 | 22596.922 |
| 3/20/14 | 22135.916 | 22626.501 |
| 3/21/14 | 22154.287 | 22641.291 |
| 3/24/14 | 22154.287 | 22641.291 |
| 3/25/14 | 22154.287 | 22641.291 |
| 3/26/14 | 22062.436 | 22567.343 |
| 3/27/14 | 22062.436 | 22567.343 |
| 3/28/14 | 22104.937 | 22620.586 |
| 3/31/14 | 22178.743 | 22679.744 |
| 4/1/14 | 22252.549 | 22738.902 |
| 4/2/14 | 22271.001 | 22753.691 |
| 4/3/14 | 22252.549 | 22738.902 |
| 4/4/14 | 22160.292 | 22664.954 |
| 4/7/14 | 22068.034 | 22591.007 |
| 4/8/14 | 22068.034 | 22591.007 |
| 4/9/14 | 22141.84 | 22650.165 |
| 4/10/14 | 21994.228 | 22531.849 |
| 4/11/14 | 21920.422 | 22472.69 |
| 4/14/14 | 21975.776 | 22517.059 |
| 4/15/14 | 21975.776 | 22517.059 |
| 4/16/14 | 22068.034 | 22591.007 |
| 4/17/14 | 22086.485 | 22605.796 |
| 4/21/14 | 22104.937 | 22620.586 |
| 4/22/14 | 22160.292 | 22664.954 |
| 4/23/14 | 22141.84 | 22650.165 |
| 4/24/14 | 22160.292 | 22664.954 |
| 4/25/14 | 22104.937 | 22620.586 |
| 4/28/14 | 22086.485 | 22605.796 |
| 4/29/14 | 22054.936 | 22599.88 |
| 4/30/14 | 22129.07 | 22659.038 |
| 5/1/14 | 22129.07 | 22659.038 |
| 5/2/14 | 22147.603 | 22673.828 |
| 5/5/14 | 22166.137 | 22688.618 |
| 5/6/14 | 22073.469 | 22614.67 |
| 5/7/14 | 22073.469 | 22614.67 |
| 5/8/14 | 21999.335 | 22555.512 |
| 5/9/14 | 21980.801 | 22540.722 |
| 5/12/14 | 22110.536 | 22644.249 |
| 5/13/14 | 22092.003 | 22629.459 |
| 5/14/14 | 22054.936 | 22599.88 |
| 5/15/14 | 22017.868 | 22570.301 |
| 5/16/14 | 22073.469 | 22614.67 |
| 5/19/14 | 22166.137 | 22688.618 |
| 5/20/14 | 22092.003 | 22629.459 |
| 5/21/14 | 22129.07 | 22659.038 |
| 5/22/14 | 22184.671 | 22703.407 |
| 5/23/14 | 22258.805 | 22762.565 |
| 5/27/14 | 22351.473 | 22836.513 |
| 5/28/14 | 22351.473 | 22836.513 |
| 5/29/14 | 22336.403 | 22843.908 |
| 5/30/14 | 22373.63 | 22873.487 |
| 6/2/14 | 22336.403 | 22843.908 |
| 6/3/14 | 22317.789 | 22829.118 |
| 6/4/14 | 22336.403 | 22843.908 |
| 6/5/14 | 22448.085 | 22932.645 |
| 6/6/14 | 22522.54 | 22991.803 |
| 6/9/14 | 22578.381 | 23036.171 |
| 6/10/14 | 22541.154 | 23006.592 |
| 6/11/14 | 22522.54 | 22991.803 |
| 6/12/14 | 22559.767 | 23021.382 |
| 6/13/14 | 22578.381 | 23036.171 |
| 6/16/14 | 22578.381 | 23036.171 |
| 6/17/14 | 22634.222 | 23080.54 |
| 6/18/14 | 22671.449 | 23110.119 |
| 6/19/14 | 22708.677 | 23139.698 |
| 6/20/14 | 22727.29 | 23154.488 |
| 6/23/14 | 22745.904 | 23169.277 |
| 6/24/14 | 22708.677 | 23139.698 |
| 6/25/14 | 22745.904 | 23169.277 |
| 6/26/14 | 22876.2 | 23272.804 |
| 6/27/14 | 22916.49 | 23324.567 |
| 6/30/14 | 22935.183 | 23339.357 |
| 7/1/14 | 22953.875 | 23354.146 |
| 7/2/14 | 22953.875 | 23354.146 |
| 7/3/14 | 22935.183 | 23339.357 |
| 7/7/14 | 22897.798 | 23309.778 |
| 7/8/14 | 22841.722 | 23265.409 |
| 7/9/14 | 22879.106 | 23294.988 |
| 7/10/14 | 22841.722 | 23265.409 |
| 7/11/14 | 22841.722 | 23265.409 |
| 7/14/14 | 22897.798 | 23309.778 |
| 7/15/14 | 22860.414 | 23280.199 |
| 7/16/14 | 22823.03 | 23250.62 |
| 7/17/14 | 22710.878 | 23161.882 |
| 7/18/14 | 22766.954 | 23206.251 |
| 7/21/14 | 22748.262 | 23191.462 |
| 7/22/14 | 22748.262 | 23191.462 |
| 7/23/14 | 22766.954 | 23206.251 |
| 7/24/14 | 22766.954 | 23206.251 |
| 7/25/14 | 22729.57 | 23176.672 |
| 7/28/14 | 22729.57 | 23176.672 |
| 7/29/14 | 22692.186 | 23147.093 |
| 7/30/14 | 22620.089 | 23110.119 |
| 7/31/14 | 22394.826 | 22932.645 |
| 8/1/14 | 22338.511 | 22888.276 |
| 8/4/14 | 22376.055 | 22917.855 |
| 8/5/14 | 22319.739 | 22873.487 |
| 8/6/14 | 22357.283 | 22903.066 |
| 8/7/14 | 22357.283 | 22903.066 |
| 8/8/14 | 22432.37 | 22962.224 |
| 8/11/14 | 22526.229 | 23036.171 |
| 8/12/14 | 22488.686 | 23006.592 |
| 8/13/14 | 22526.229 | 23036.171 |
| 8/14/14 | 22563.773 | 23065.751 |
| 8/15/14 | 22601.317 | 23095.33 |
| 8/18/14 | 22695.176 | 23169.277 |
| 8/19/14 | 22695.176 | 23169.277 |
| 8/20/14 | 22751.492 | 23213.646 |
| 8/21/14 | 22789.035 | 23243.225 |
| 8/22/14 | 22770.264 | 23228.435 |
| 8/25/14 | 22826.579 | 23272.804 |
| 8/26/14 | 22845.351 | 23287.593 |
| 8/27/14 | 22845.351 | 23287.593 |
| 8/28/14 | 22810.08 | 23280.199 |
| 8/29/14 | 22866.634 | 23324.567 |
| 9/2/14 | 22866.634 | 23324.567 |
| 9/3/14 | 22847.783 | 23309.778 |
| 9/4/14 | 22810.08 | 23280.199 |
| 9/5/14 | 22828.931 | 23294.988 |
| 9/8/14 | 22810.08 | 23280.199 |
| 9/9/14 | 22734.675 | 23221.041 |
| 9/10/14 | 22696.972 | 23191.462 |
| 9/11/14 | 22696.972 | 23191.462 |
| 9/12/14 | 22602.716 | 23117.514 |
| 9/15/14 | 22527.31 | 23058.356 |
| 9/16/14 | 22527.31 | 23058.356 |
| 9/17/14 | 22565.013 | 23087.935 |
| 9/18/14 | 22565.013 | 23087.935 |
| 9/19/14 | 22508.459 | 23043.566 |
| 9/22/14 | 22395.351 | 22954.829 |
| 9/23/14 | 22319.946 | 22895.671 |
| 9/24/14 | 22338.797 | 22910.46 |
| 9/25/14 | 22206.838 | 22806.934 |
| 9/26/14 | 22244.541 | 22836.513 |
| 9/29/14 | 22133.308 | 22769.96 |
| 9/30/14 | 22019.707 | 22681.223 |
| 10/1/14 | 22000.774 | 22666.433 |
| 10/2/14 | 21981.84 | 22651.644 |
| 10/3/14 | 22057.574 | 22710.802 |
| 10/6/14 | 22076.508 | 22725.591 |
| 10/7/14 | 21981.84 | 22651.644 |
| 10/8/14 | 22019.707 | 22681.223 |
| 10/9/14 | 21849.305 | 22548.117 |
| 10/10/14 | 21849.305 | 22548.117 |
| 10/13/14 | 21527.435 | 22296.695 |
| 10/14/14 | 21489.568 | 22267.116 |
| 10/15/14 | 21338.1 | 22148.8 |
| 10/16/14 | 21451.701 | 22237.537 |
| 10/17/14 | 21603.169 | 22355.853 |
| 10/20/14 | 21659.97 | 22400.222 |
| 10/21/14 | 21792.505 | 22503.748 |
| 10/22/14 | 21754.638 | 22474.169 |
| 10/23/14 | 21754.638 | 22474.169 |
| 10/24/14 | 21773.571 | 22488.959 |
| 10/27/14 | 21735.704 | 22459.38 |
| 10/28/14 | 21830.372 | 22533.327 |
| 10/29/14 | 21830.372 | 22533.327 |
| 10/30/14 | 21850.77 | 22570.301 |
| 10/31/14 | 21945.856 | 22644.249 |
| 11/3/14 | 21926.838 | 22629.459 |
| 11/4/14 | 21831.752 | 22555.512 |
| 11/5/14 | 21850.77 | 22570.301 |
| 11/6/14 | 21812.735 | 22540.722 |
| 11/7/14 | 21907.821 | 22614.67 |
| 11/10/14 | 21945.856 | 22644.249 |
| 11/11/14 | 21926.838 | 22629.459 |
| 11/12/14 | 21907.821 | 22614.67 |
| 11/13/14 | 21869.787 | 22585.091 |
| 11/14/14 | 21869.787 | 22585.091 |
| 11/17/14 | 21831.752 | 22555.512 |
| 11/18/14 | 21831.752 | 22555.512 |
| 11/19/14 | 21755.684 | 22496.354 |
| 11/20/14 | 21774.701 | 22511.143 |
| 11/21/14 | 21793.718 | 22525.933 |
| 11/24/14 | 21850.77 | 22570.301 |
| 11/25/14 | 21888.804 | 22599.88 |
| 11/26/14 | 21889.85 | 22622.065 |
| 11/28/14 | 21889.85 | 22622.065 |
| 12/1/14 | 21565.131 | 22370.643 |
| 12/2/14 | 21584.232 | 22385.432 |
| 12/3/14 | 21584.232 | 22385.432 |
| 12/4/14 | 21565.131 | 22370.643 |
| 12/5/14 | 21507.828 | 22326.274 |
| 12/8/14 | 21259.514 | 22134.01 |
| 12/9/14 | 21278.615 | 22148.8 |
| 12/10/14 | 21049.402 | 21971.325 |
| 12/11/14 | 20972.998 | 21912.167 |
| 12/12/14 | 20743.784 | 21734.693 |
| 12/15/14 | 20590.976 | 21616.377 |
| 12/16/14 | 20380.864 | 21453.692 |
| 12/17/14 | 20590.976 | 21616.377 |
| 12/18/14 | 20896.593 | 21853.009 |
| 12/19/14 | 21030.301 | 21956.536 |
| 12/22/14 | 20992.099 | 21926.957 |
| 12/23/14 | 21011.2 | 21941.746 |
| 12/24/14 | 21011.2 | 21941.746 |
| 12/26/14 | 21049.402 | 21971.325 |
| 12/29/14 | 21049.402 | 21971.325 |
| 12/30/14 | 20965.627 | 21956.536 |
| 12/31/14 | 20907.711 | 21912.167 |
| 1/2/15 | 20984.933 | 21971.325 |
| 1/5/15 | 20888.406 | 21897.378 |
| 1/6/15 | 20753.268 | 21793.851 |
| 1/7/15 | 20811.184 | 21838.22 |
| 1/8/15 | 20907.711 | 21912.167 |
| 1/9/15 | 20869.101 | 21882.588 |
| 1/12/15 | 20830.49 | 21853.009 |
| 1/13/15 | 20733.963 | 21779.061 |
| 1/14/15 | 20598.825 | 21675.535 |
| 1/15/15 | 20560.215 | 21645.956 |
| 1/16/15 | 20618.131 | 21690.324 |
| 1/20/15 | 20579.52 | 21660.745 |
| 1/21/15 | 20618.131 | 21690.324 |
| 1/22/15 | 20695.352 | 21749.482 |
| 1/23/15 | 20714.658 | 21764.272 |
| 1/26/15 | 20772.574 | 21808.641 |
| 1/27/15 | 20753.268 | 21793.851 |
| 1/28/15 | 20676.047 | 21734.693 |
| 1/29/15 | 20714.658 | 21764.272 |
| 1/30/15 | 20637.436 | 21705.114 |
| 2/2/15 | 20656.742 | 21719.903 |
| 2/3/15 | 20867.543 | 21885.546 |
| 2/4/15 | 20809.577 | 21841.177 |
| 2/5/15 | 20944.83 | 21944.704 |
| 2/6/15 | 20964.152 | 21959.494 |
| 2/9/15 | 20886.864 | 21900.336 |
| 2/10/15 | 20848.221 | 21870.757 |
| 2/11/15 | 20828.899 | 21855.967 |
| 2/12/15 | 20944.83 | 21944.704 |
| 2/13/15 | 21022.117 | 22003.862 |
| 2/17/15 | 21060.761 | 22033.441 |
| 2/18/15 | 21060.761 | 22033.441 |
| 2/19/15 | 21099.404 | 22063.02 |
| 2/20/15 | 21138.048 | 22092.599 |
| 2/23/15 | 21196.013 | 22136.968 |
| 2/24/15 | 21273.3 | 22196.126 |
| 2/25/15 | 21311.944 | 22225.705 |
| 2/26/15 | 21330.789 | 22262.679 |
| 2/27/15 | 21408.426 | 22321.837 |
| 3/2/15 | 21447.244 | 22351.416 |
| 3/3/15 | 21447.244 | 22351.416 |
| 3/4/15 | 21427.835 | 22336.627 |
| 3/5/15 | 21408.426 | 22321.837 |
| 3/6/15 | 21311.379 | 22247.89 |
| 3/9/15 | 21291.97 | 22233.1 |
| 3/10/15 | 21194.924 | 22159.152 |
| 3/11/15 | 21175.515 | 22144.363 |
| 3/12/15 | 21233.742 | 22188.731 |
| 3/13/15 | 21175.515 | 22144.363 |
| 3/16/15 | 21214.333 | 22173.942 |
| 3/17/15 | 21194.924 | 22159.152 |
| 3/18/15 | 21272.561 | 22218.31 |
| 3/19/15 | 21253.152 | 22203.521 |
| 3/20/15 | 21389.017 | 22307.048 |
| 3/23/15 | 21427.835 | 22336.627 |
| 3/24/15 | 21389.017 | 22307.048 |
| 3/25/15 | 21389.017 | 22307.048 |
| 3/26/15 | 21350.198 | 22277.469 |
| 3/27/15 | 21350.198 | 22277.469 |
| 3/30/15 | 21368.693 | 22314.442 |
| 3/31/15 | 21329.699 | 22284.863 |
| 4/1/15 | 21349.196 | 22299.653 |
| 4/2/15 | 21388.19 | 22329.232 |
| 4/6/15 | 21466.178 | 22388.39 |
| 4/7/15 | 21485.675 | 22403.18 |
| 4/8/15 | 21466.178 | 22388.39 |
| 4/9/15 | 21505.172 | 22417.969 |
| 4/10/15 | 21563.663 | 22462.338 |
| 4/13/15 | 21563.663 | 22462.338 |
| 4/14/15 | 21622.154 | 22506.706 |
| 4/15/15 | 21661.148 | 22536.285 |
| 4/16/15 | 21680.645 | 22551.075 |
| 4/17/15 | 21622.154 | 22506.706 |
| 4/20/15 | 21661.148 | 22536.285 |
| 4/21/15 | 21641.651 | 22521.496 |
| 4/22/15 | 21680.645 | 22551.075 |
| 4/23/15 | 21739.136 | 22595.443 |
| 4/24/15 | 21758.633 | 22610.233 |
| 4/27/15 | 21719.639 | 22580.654 |
| 4/28/15 | 21778.129 | 22625.023 |
| 4/29/15 | 21698.789 | 22588.049 |
| 4/30/15 | 21659.621 | 22558.47 |
| 5/1/15 | 21640.037 | 22543.68 |
| 5/4/15 | 21640.037 | 22543.68 |
| 5/5/15 | 21522.535 | 22454.943 |
| 5/6/15 | 21424.616 | 22380.995 |
| 5/7/15 | 21405.032 | 22366.206 |
| 5/8/15 | 21483.367 | 22425.364 |
| 5/11/15 | 21502.951 | 22440.153 |
| 5/12/15 | 21463.784 | 22410.574 |
| 5/13/15 | 21483.367 | 22425.364 |
| 5/14/15 | 21542.119 | 22469.732 |
| 5/15/15 | 21620.454 | 22528.891 |
| 5/18/15 | 21640.037 | 22543.68 |
| 5/19/15 | 21640.037 | 22543.68 |
| 5/20/15 | 21659.621 | 22558.47 |
| 5/21/15 | 21659.621 | 22558.47 |
| 5/22/15 | 21659.621 | 22558.47 |
| 5/26/15 | 21581.286 | 22499.312 |
| 5/27/15 | 21640.037 | 22543.68 |
| 5/28/15 | 21618.667 | 22551.075 |
| 5/29/15 | 21579.324 | 22521.496 |
| 6/1/15 | 21559.653 | 22506.706 |
| 6/2/15 | 21598.996 | 22536.285 |
| 6/3/15 | 21598.996 | 22536.285 |
| 6/4/15 | 21500.64 | 22462.338 |
| 6/5/15 | 21441.626 | 22417.969 |
| 6/8/15 | 21362.941 | 22358.811 |
| 6/9/15 | 21323.599 | 22329.232 |
| 6/10/15 | 21343.27 | 22344.021 |
| 6/11/15 | 21382.612 | 22373.601 |
| 6/12/15 | 21323.599 | 22329.232 |
| 6/15/15 | 21284.256 | 22299.653 |
| 6/16/15 | 21284.256 | 22299.653 |
| 6/17/15 | 21323.599 | 22329.232 |
| 6/18/15 | 21382.612 | 22373.601 |
| 6/19/15 | 21382.612 | 22373.601 |
| 6/22/15 | 21421.955 | 22403.18 |
| 6/23/15 | 21441.626 | 22417.969 |
| 6/24/15 | 21402.283 | 22388.39 |
| 6/25/15 | 21323.599 | 22329.232 |
| 6/26/15 | 21264.585 | 22284.863 |
| 6/29/15 | 21006.635 | 22114.784 |
| 6/30/15 | 21006.635 | 22114.784 |
| 7/1/15 | 21065.92 | 22159.152 |
| 7/2/15 | 21105.443 | 22188.731 |
| 7/6/15 | 21046.158 | 22144.363 |
| 7/7/15 | 21065.92 | 22159.152 |
| 7/8/15 | 20927.588 | 22055.626 |
| 7/9/15 | 20927.588 | 22055.626 |
| 7/10/15 | 21085.682 | 22173.942 |
| 7/13/15 | 21144.967 | 22218.31 |
| 7/14/15 | 21184.49 | 22247.89 |
| 7/15/15 | 21184.49 | 22247.89 |
| 7/16/15 | 21243.775 | 22292.258 |
| 7/17/15 | 21204.251 | 22262.679 |
| 7/20/15 | 21105.443 | 22188.731 |
| 7/21/15 | 21065.92 | 22159.152 |
| 7/22/15 | 20947.35 | 22070.415 |
| 7/23/15 | 20809.018 | 21966.888 |
| 7/24/15 | 20631.164 | 21833.783 |
| 7/27/15 | 20512.594 | 21745.046 |
| 7/28/15 | 20611.402 | 21818.993 |
| 7/29/15 | 20789.257 | 21952.099 |
| 7/30/15 | 20806.342 | 21989.073 |
| 7/31/15 | 20806.342 | 21989.073 |
| 8/3/15 | 20746.782 | 21944.704 |
| 8/4/15 | 20726.929 | 21929.915 |
| 8/5/15 | 20687.222 | 21900.336 |
| 8/6/15 | 20627.662 | 21855.967 |
| 8/7/15 | 20587.955 | 21826.388 |
| 8/10/15 | 20647.515 | 21870.757 |
| 8/11/15 | 20568.102 | 21811.598 |
| 8/12/15 | 20568.102 | 21811.598 |
| 8/13/15 | 20548.248 | 21796.809 |
| 8/14/15 | 20587.955 | 21826.388 |
| 8/17/15 | 20647.515 | 21870.757 |
| 8/18/15 | 20587.955 | 21826.388 |
| 8/19/15 | 20508.541 | 21767.23 |
| 8/20/15 | 20329.861 | 21634.124 |
| 8/21/15 | 20012.207 | 21397.492 |
| 8/24/15 | 19456.312 | 20983.385 |
| 8/25/15 | 19416.606 | 20940.562 |
| 8/26/15 | 19654.846 | 21197.501 |
| 8/27/15 | 19893.087 | 21454.44 |
| 8/28/15 | 19950.708 | 21505.828 |
| 8/31/15 | 19910.726 | 21463.005 |
| 9/1/15 | 19670.838 | 21206.066 |
| 9/2/15 | 19750.801 | 21291.712 |
| 9/3/15 | 19810.773 | 21355.947 |
| 9/4/15 | 19670.838 | 21206.066 |
| 9/8/15 | 19830.763 | 21377.359 |
| 9/9/15 | 19710.819 | 21248.889 |
| 9/10/15 | 19710.819 | 21248.889 |
| 9/11/15 | 19750.801 | 21291.712 |
| 9/14/15 | 19710.819 | 21248.889 |
| 9/15/15 | 19790.782 | 21334.535 |
| 9/16/15 | 19890.735 | 21441.593 |
| 9/17/15 | 19930.717 | 21484.417 |
| 9/18/15 | 19830.763 | 21377.359 |
| 9/21/15 | 19870.745 | 21420.182 |
| 9/22/15 | 19710.819 | 21248.889 |
| 9/23/15 | 19670.838 | 21206.066 |
| 9/24/15 | 19610.866 | 21141.831 |
| 9/25/15 | 19570.884 | 21099.007 |
| 9/28/15 | 19171.071 | 20670.775 |
| 9/29/15 | 18988.254 | 20465.224 |
| 9/30/15 | 19209.75 | 20700.751 |
| 10/1/15 | 19270.158 | 20764.986 |
| 10/2/15 | 19350.702 | 20850.633 |
| 10/5/15 | 19612.47 | 21128.984 |
| 10/6/15 | 19672.878 | 21193.219 |
| 10/7/15 | 19833.966 | 21364.512 |
| 10/8/15 | 19974.918 | 21514.393 |
| 10/9/15 | 19974.918 | 21514.393 |
| 10/12/15 | 19974.918 | 21514.393 |
| 10/13/15 | 19874.238 | 21407.335 |
| 10/14/15 | 19833.966 | 21364.512 |
| 10/15/15 | 19974.918 | 21514.393 |
| 10/16/15 | 20055.462 | 21600.039 |
| 10/19/15 | 20055.462 | 21600.039 |
| 10/20/15 | 20075.598 | 21621.451 |
| 10/21/15 | 19995.054 | 21535.804 |
| 10/22/15 | 20136.006 | 21685.686 |
| 10/23/15 | 20176.278 | 21728.509 |
| 10/26/15 | 20095.734 | 21642.863 |
| 10/27/15 | 19934.646 | 21471.57 |
| 10/28/15 | 20075.598 | 21621.451 |
| 10/29/15 | 19991.137 | 21522.957 |
| 10/30/15 | 19991.137 | 21522.957 |
| 11/2/15 | 20133.062 | 21672.839 |
| 11/3/15 | 20153.336 | 21694.25 |
| 11/4/15 | 20112.787 | 21651.427 |
| 11/5/15 | 20072.237 | 21608.604 |
| 11/6/15 | 20031.687 | 21565.781 |
| 11/9/15 | 19910.037 | 21437.311 |
| 11/10/15 | 19910.037 | 21437.311 |
| 11/11/15 | 19930.312 | 21458.723 |
| 11/12/15 | 19727.562 | 21244.606 |
| 11/13/15 | 19626.187 | 21137.548 |
| 11/16/15 | 19768.112 | 21287.43 |
| 11/17/15 | 19727.562 | 21244.606 |
| 11/18/15 | 19849.212 | 21373.076 |
| 11/19/15 | 19869.487 | 21394.488 |
| 11/20/15 | 19869.487 | 21394.488 |
| 11/23/15 | 19869.487 | 21394.488 |
| 11/24/15 | 19910.037 | 21437.311 |
| 11/25/15 | 19930.312 | 21458.723 |
| 11/27/15 | 19986.246 | 21510.111 |
| 11/30/15 | 20006.661 | 21531.522 |
| 12/1/15 | 20067.906 | 21595.757 |
| 12/2/15 | 19904.586 | 21424.464 |
| 12/3/15 | 19761.681 | 21274.583 |
| 12/4/15 | 19843.341 | 21360.229 |
| 12/7/15 | 19659.607 | 21167.525 |
| 12/8/15 | 19516.702 | 21017.643 |
| 12/9/15 | 19455.457 | 20953.408 |
| 12/10/15 | 19414.627 | 20910.585 |
| 12/11/15 | 19108.403 | 20589.411 |
| 12/14/15 | 18843.008 | 20311.06 |
| 12/15/15 | 19087.988 | 20567.999 |
| 12/16/15 | 19373.797 | 20867.762 |
| 12/17/15 | 19353.382 | 20846.35 |
| 12/18/15 | 19230.893 | 20717.881 |
| 12/21/15 | 19312.552 | 20803.527 |
| 12/22/15 | 19435.042 | 20931.997 |
| 12/23/15 | 19659.607 | 21167.525 |
| 12/24/15 | 19659.607 | 21167.525 |
| 12/28/15 | 19557.532 | 21060.467 |
| 12/29/15 | 19618.777 | 21124.701 |
| 12/30/15 | 19534.937 | 21021.926 |
| 12/31/15 | 19493.462 | 20979.102 |
| 1/4/16 | 19431.249 | 20914.868 |
| 1/5/16 | 19534.937 | 21021.926 |
| 1/6/16 | 19472.724 | 20957.691 |
| 1/7/16 | 19203.134 | 20679.34 |
| 1/8/16 | 19057.97 | 20529.458 |
| 1/11/16 | 18995.757 | 20465.224 |
| 1/12/16 | 18954.281 | 20422.4 |
| 1/13/16 | 18663.953 | 20122.638 |
| 1/14/16 | 18643.215 | 20101.226 |
| 1/15/16 | 18415.1 | 19865.698 |
| 1/19/16 | 18249.198 | 19694.405 |
| 1/20/16 | 18021.084 | 19458.878 |
| 1/21/16 | 18124.772 | 19565.936 |
| 1/22/16 | 18435.838 | 19887.11 |
| 1/25/16 | 18269.936 | 19715.817 |
| 1/26/16 | 18456.576 | 19908.522 |
| 1/27/16 | 18435.838 | 19887.11 |
| 1/28/16 | 18518.789 | 19972.756 |
| 1/29/16 | 18705.428 | 20165.461 |
| 2/1/16 | 18684.691 | 20144.049 |
| 2/2/16 | 18588.099 | 20043.415 |
| 2/3/16 | 18650.406 | 20107.65 |
| 2/4/16 | 18608.868 | 20064.826 |
| 2/5/16 | 18546.562 | 20000.592 |
| 2/8/16 | 18318.105 | 19765.064 |
| 2/9/16 | 18151.954 | 19593.771 |
| 2/10/16 | 18131.185 | 19572.359 |
| 2/11/16 | 17923.497 | 19358.243 |
| 2/12/16 | 18048.11 | 19486.713 |
| 2/16/16 | 18214.261 | 19658.006 |
| 2/17/16 | 18401.18 | 19850.71 |
| 2/18/16 | 18421.949 | 19872.122 |
| 2/19/16 | 18380.411 | 19829.299 |
| 2/22/16 | 18463.487 | 19914.945 |
| 2/23/16 | 18484.255 | 19936.357 |
| 2/24/16 | 18546.562 | 20000.592 |
| 2/25/16 | 18691.944 | 20150.473 |
| 2/26/16 | 18766.671 | 20223.272 |
| 2/29/16 | 18934.044 | 20394.565 |
| 3/1/16 | 18996.809 | 20458.8 |
| 3/2/16 | 19080.495 | 20544.447 |
| 3/3/16 | 19206.025 | 20672.916 |
| 3/4/16 | 19310.633 | 20779.974 |
| 3/7/16 | 19394.319 | 20865.621 |
| 3/8/16 | 19310.633 | 20779.974 |
| 3/9/16 | 19331.555 | 20801.386 |
| 3/10/16 | 19331.555 | 20801.386 |
| 3/11/16 | 19519.849 | 20994.091 |
| 3/14/16 | 19540.771 | 21015.502 |
| 3/15/16 | 19498.927 | 20972.679 |
| 3/16/16 | 19624.457 | 21101.149 |
| 3/17/16 | 19770.908 | 21251.03 |
| 3/18/16 | 19812.751 | 21293.853 |
| 3/21/16 | 19875.516 | 21358.088 |
| 3/22/16 | 19875.516 | 21358.088 |
| 3/23/16 | 19770.908 | 21251.03 |
| 3/24/16 | 19749.986 | 21229.618 |
| 3/28/16 | 19749.986 | 21229.618 |
| 3/29/16 | 19896.438 | 21379.5 |
| 3/30/16 | 19949.786 | 21430.888 |
| 3/31/16 | 20034.051 | 21516.534 |
| 4/1/16 | 20012.985 | 21495.122 |
| 4/4/16 | 19928.719 | 21409.476 |
| 4/5/16 | 19886.587 | 21366.653 |
| 4/6/16 | 19949.786 | 21430.888 |
| 4/7/16 | 19907.653 | 21388.064 |
| 4/8/16 | 19928.719 | 21409.476 |
| 4/11/16 | 19991.918 | 21473.711 |
| 4/12/16 | 20076.183 | 21559.357 |
| 4/13/16 | 20160.449 | 21645.004 |
| 4/14/16 | 20139.382 | 21623.592 |
| 4/15/16 | 20160.449 | 21645.004 |
| 4/18/16 | 20202.581 | 21687.827 |
| 4/19/16 | 20286.846 | 21773.473 |
| 4/20/16 | 20286.846 | 21773.473 |
| 4/21/16 | 20265.78 | 21752.062 |
| 4/22/16 | 20307.913 | 21794.885 |
| 4/25/16 | 20307.913 | 21794.885 |
| 4/26/16 | 20350.045 | 21837.708 |
| 4/27/16 | 20413.244 | 21901.943 |
| 4/28/16 | 20362.823 | 21848.414 |
| 4/29/16 | 20362.823 | 21848.414 |
| 5/2/16 | 20320.4 | 21805.591 |
| 5/3/16 | 20256.767 | 21741.356 |
| 5/4/16 | 20299.189 | 21784.179 |
| 5/5/16 | 20277.978 | 21762.768 |
| 5/6/16 | 20320.4 | 21805.591 |
| 5/9/16 | 20362.823 | 21848.414 |
| 5/10/16 | 20447.668 | 21934.061 |
| 5/11/16 | 20447.668 | 21934.061 |
| 5/12/16 | 20468.879 | 21955.472 |
| 5/13/16 | 20447.668 | 21934.061 |
| 5/16/16 | 20511.302 | 21998.295 |
| 5/17/16 | 20468.879 | 21955.472 |
| 5/18/16 | 20405.246 | 21891.237 |
| 5/19/16 | 20299.189 | 21784.179 |
| 5/20/16 | 20426.457 | 21912.649 |
| 5/23/16 | 20468.879 | 21955.472 |
| 5/24/16 | 20532.513 | 22019.707 |
| 5/25/16 | 20617.358 | 22105.353 |
| 5/26/16 | 20680.992 | 22169.588 |
| 5/27/16 | 20692.9 | 22180.294 |
| 5/31/16 | 20671.545 | 22158.883 |
| 6/1/16 | 20735.61 | 22223.117 |
| 6/2/16 | 20756.965 | 22244.529 |
| 6/3/16 | 20799.675 | 22287.352 |
| 6/6/16 | 20842.384 | 22330.175 |
| 6/7/16 | 20885.094 | 22372.999 |
| 6/8/16 | 20927.804 | 22415.822 |
| 6/9/16 | 20949.159 | 22437.234 |
| 6/10/16 | 20885.094 | 22372.999 |
| 6/13/16 | 20778.32 | 22265.941 |
| 6/14/16 | 20692.9 | 22180.294 |
| 6/15/16 | 20714.255 | 22201.706 |
| 6/16/16 | 20735.61 | 22223.117 |
| 6/17/16 | 20756.965 | 22244.529 |
| 6/20/16 | 20842.384 | 22330.175 |
| 6/21/16 | 20885.094 | 22372.999 |
| 6/22/16 | 20885.094 | 22372.999 |
| 6/23/16 | 20991.869 | 22480.057 |
| 6/24/16 | 20821.029 | 22308.764 |
| 6/27/16 | 20543.416 | 22030.413 |
| 6/28/16 | 20756.965 | 22244.529 |
| 6/29/16 | 20917.495 | 22405.116 |
| 6/30/16 | 21067.981 | 22554.997 |
| 7/1/16 | 21110.977 | 22597.821 |
| 7/5/16 | 21024.985 | 22512.174 |
| 7/6/16 | 21110.977 | 22597.821 |
| 7/7/16 | 21089.479 | 22576.409 |
| 7/8/16 | 21196.968 | 22683.467 |
| 7/11/16 | 21282.96 | 22769.114 |
| 7/12/16 | 21325.956 | 22811.937 |
| 7/13/16 | 21325.956 | 22811.937 |
| 7/14/16 | 21325.956 | 22811.937 |
| 7/15/16 | 21347.454 | 22833.348 |
| 7/18/16 | 21433.446 | 22918.995 |
| 7/19/16 | 21454.944 | 22940.407 |
| 7/20/16 | 21497.939 | 22983.23 |
| 7/21/16 | 21519.437 | 23004.641 |
| 7/22/16 | 21583.931 | 23068.876 |
| 7/25/16 | 21562.433 | 23047.465 |
| 7/26/16 | 21583.931 | 23068.876 |
| 7/27/16 | 21605.429 | 23090.288 |
| 7/28/16 | 21591.978 | 23077.441 |
| 7/29/16 | 21678.519 | 23163.087 |
| 8/1/16 | 21678.519 | 23163.087 |
| 8/2/16 | 21570.343 | 23056.029 |
| 8/3/16 | 21678.519 | 23163.087 |
| 8/4/16 | 21678.519 | 23163.087 |
| 8/5/16 | 21743.425 | 23227.322 |
| 8/8/16 | 21765.06 | 23248.734 |
| 8/9/16 | 21829.966 | 23312.969 |
| 8/10/16 | 21829.966 | 23312.969 |
| 8/11/16 | 21829.966 | 23312.969 |
| 8/12/16 | 21851.601 | 23334.38 |
| 8/15/16 | 21873.236 | 23355.792 |
| 8/16/16 | 21829.966 | 23312.969 |
| 8/17/16 | 21808.33 | 23291.557 |
| 8/18/16 | 21873.236 | 23355.792 |
| 8/19/16 | 21851.601 | 23334.38 |
| 8/22/16 | 21873.236 | 23355.792 |
| 8/23/16 | 21938.142 | 23420.027 |
| 8/24/16 | 21894.871 | 23377.204 |
| 8/25/16 | 21916.507 | 23398.615 |
| 8/26/16 | 21894.871 | 23377.204 |
| 8/29/16 | 21981.412 | 23462.85 |
| 8/30/16 | 22010.271 | 23492.826 |
| 8/31/16 | 21988.5 | 23471.415 |
| 9/1/16 | 21944.958 | 23428.591 |
| 9/2/16 | 22075.583 | 23557.061 |
| 9/6/16 | 22119.124 | 23599.884 |
| 9/7/16 | 22162.666 | 23642.708 |
| 9/8/16 | 22140.895 | 23621.296 |
| 9/9/16 | 21814.333 | 23300.122 |
| 9/12/16 | 21857.875 | 23342.945 |
| 9/13/16 | 21661.938 | 23150.24 |
| 9/14/16 | 21683.709 | 23171.652 |
| 9/15/16 | 21770.792 | 23257.298 |
| 9/16/16 | 21727.25 | 23214.475 |
| 9/19/16 | 21836.104 | 23321.533 |
| 9/20/16 | 21879.646 | 23364.357 |
| 9/21/16 | 21966.729 | 23450.003 |
| 9/22/16 | 22075.583 | 23557.061 |
| 9/23/16 | 22053.812 | 23535.65 |
| 9/26/16 | 22010.271 | 23492.826 |
| 9/27/16 | 22032.041 | 23514.238 |
| 9/28/16 | 22053.812 | 23535.65 |
| 9/29/16 | 21997.051 | 23482.12 |
| 9/30/16 | 22040.869 | 23524.944 |
| 10/3/16 | 21997.051 | 23482.12 |
| 10/4/16 | 21865.594 | 23353.651 |
| 10/5/16 | 21865.594 | 23353.651 |
| 10/6/16 | 21821.775 | 23310.828 |
| 10/7/16 | 21821.775 | 23310.828 |
| 10/10/16 | 21887.503 | 23375.062 |
| 10/11/16 | 21843.685 | 23332.239 |
| 10/12/16 | 21865.594 | 23353.651 |
| 10/13/16 | 21865.594 | 23353.651 |
| 10/14/16 | 21821.775 | 23310.828 |
| 10/17/16 | 21777.956 | 23268.004 |
| 10/18/16 | 21843.685 | 23332.239 |
| 10/19/16 | 21931.322 | 23417.886 |
| 10/20/16 | 21909.413 | 23396.474 |
| 10/21/16 | 21953.232 | 23439.297 |
| 10/24/16 | 22018.96 | 23503.532 |
| 10/25/16 | 22040.869 | 23524.944 |
| 10/26/16 | 21997.051 | 23482.12 |
| 10/27/16 | 21909.413 | 23396.474 |
| 10/28/16 | 21895.222 | 23385.768 |
| 10/31/16 | 21851.123 | 23342.945 |
| 11/1/16 | 21718.826 | 23214.475 |
| 11/2/16 | 21608.578 | 23107.417 |
| 11/3/16 | 21586.529 | 23086.006 |
| 11/4/16 | 21586.529 | 23086.006 |
| 11/7/16 | 21740.875 | 23235.887 |
| 11/8/16 | 21784.975 | 23278.71 |
| 11/9/16 | 21829.074 | 23321.533 |
| 11/10/16 | 21807.024 | 23300.122 |
| 11/11/16 | 21851.123 | 23342.945 |
| 11/14/16 | 21784.975 | 23278.71 |
| 11/15/16 | 21895.222 | 23385.768 |
| 11/16/16 | 21917.272 | 23407.18 |
| 11/17/16 | 21961.371 | 23450.003 |
| 11/18/16 | 22005.47 | 23492.826 |
| 11/21/16 | 22049.569 | 23535.65 |
| 11/22/16 | 22137.768 | 23621.296 |
| 11/23/16 | 22137.768 | 23621.296 |
| 11/25/16 | 22225.966 | 23706.942 |
| 11/28/16 | 22203.916 | 23685.531 |
| 11/29/16 | 22205.009 | 23689.813 |
| 11/30/16 | 22160.688 | 23646.99 |
| 12/1/16 | 22160.688 | 23646.99 |
| 12/2/16 | 22160.688 | 23646.99 |
| 12/5/16 | 22249.33 | 23732.636 |
| 12/6/16 | 22337.973 | 23818.283 |
| 12/7/16 | 22426.616 | 23903.929 |
| 12/8/16 | 22493.098 | 23968.164 |
| 12/9/16 | 22537.419 | 24010.987 |
| 12/12/16 | 22515.259 | 23989.576 |
| 12/13/16 | 22493.098 | 23968.164 |
| 12/14/16 | 22382.295 | 23861.106 |
| 12/15/16 | 22360.134 | 23839.694 |
| 12/16/16 | 22404.455 | 23882.518 |
| 12/19/16 | 22493.098 | 23968.164 |
| 12/20/16 | 22537.419 | 24010.987 |
| 12/21/16 | 22559.58 | 24032.399 |
| 12/22/16 | 22559.58 | 24032.399 |
| 12/23/16 | 22581.741 | 24053.811 |
| 12/27/16 | 22581.741 | 24053.811 |
| 12/28/16 | 22537.419 | 24010.987 |
| 12/29/16 | 22615.144 | 24090.21 |
| 12/30/16 | 22615.144 | 24090.21 |
| 1/3/17 | 22704.268 | 24175.857 |
| 1/4/17 | 22860.234 | 24325.738 |
| 1/5/17 | 22837.953 | 24304.327 |
| 1/6/17 | 22837.953 | 24304.327 |
| 1/9/17 | 22771.111 | 24240.092 |
| 1/10/17 | 22837.953 | 24304.327 |
| 1/11/17 | 22860.234 | 24325.738 |
| 1/12/17 | 22837.953 | 24304.327 |
| 1/13/17 | 22882.515 | 24347.15 |
| 1/17/17 | 22860.234 | 24325.738 |
| 1/18/17 | 22882.515 | 24347.15 |
| 1/19/17 | 22815.673 | 24282.915 |
| 1/20/17 | 22860.234 | 24325.738 |
| 1/23/17 | 22882.515 | 24347.15 |
| 1/24/17 | 22927.077 | 24389.973 |
| 1/25/17 | 22971.639 | 24432.796 |
| 1/26/17 | 22993.92 | 24454.208 |
| 1/27/17 | 22993.92 | 24454.208 |
| 1/30/17 | 22927.077 | 24389.973 |
| 1/31/17 | 22860.234 | 24325.738 |
| 2/1/17 | 22927.077 | 24389.973 |
| 2/2/17 | 22922.731 | 24389.973 |
| 2/3/17 | 23034.658 | 24497.031 |
| 2/6/17 | 23057.044 | 24518.443 |
| 2/7/17 | 23079.429 | 24539.854 |
| 2/8/17 | 23057.044 | 24518.443 |
| 2/9/17 | 23079.429 | 24539.854 |
| 2/10/17 | 23124.2 | 24582.678 |
| 2/13/17 | 23168.971 | 24625.501 |
| 2/14/17 | 23213.742 | 24668.324 |
| 2/15/17 | 23236.127 | 24689.736 |
| 2/16/17 | 23258.513 | 24711.147 |
| 2/17/17 | 23258.513 | 24711.147 |
| 2/21/17 | 23348.055 | 24796.794 |
| 2/22/17 | 23370.44 | 24818.205 |
| 2/23/17 | 23392.826 | 24839.617 |
| 2/24/17 | 23392.826 | 24839.617 |
| 2/27/17 | 23410.342 | 24861.029 |
| 2/28/17 | 23410.342 | 24861.029 |
| 3/1/17 | 23477.807 | 24925.263 |
| 3/2/17 | 23432.83 | 24882.44 |
| 3/3/17 | 23432.83 | 24882.44 |
| 3/6/17 | 23432.83 | 24882.44 |
| 3/7/17 | 23387.854 | 24839.617 |
| 3/8/17 | 23297.9 | 24753.971 |
| 3/9/17 | 23207.947 | 24668.324 |
| 3/10/17 | 23275.412 | 24732.559 |
| 3/13/17 | 23252.924 | 24711.147 |
| 3/14/17 | 23185.459 | 24646.912 |
| 3/15/17 | 23342.877 | 24796.794 |
| 3/16/17 | 23365.365 | 24818.205 |
| 3/17/17 | 23432.83 | 24882.44 |
| 3/20/17 | 23432.83 | 24882.44 |
| 3/21/17 | 23320.389 | 24775.382 |
| 3/22/17 | 23320.389 | 24775.382 |
| 3/23/17 | 23320.389 | 24775.382 |
| 3/24/17 | 23365.365 | 24818.205 |
| 3/27/17 | 23365.365 | 24818.205 |
| 3/28/17 | 23432.83 | 24882.44 |
| 3/29/17 | 23477.807 | 24925.263 |
| 3/30/17 | 23558.094 | 25006.628 |
| 3/31/17 | 23558.094 | 25006.628 |
| 4/3/17 | 23580.681 | 25028.039 |
| 4/4/17 | 23580.681 | 25028.039 |
| 4/5/17 | 23558.094 | 25006.628 |
| 4/6/17 | 23603.268 | 25049.451 |
| 4/7/17 | 23580.681 | 25028.039 |
| 4/10/17 | 23603.268 | 25049.451 |
| 4/11/17 | 23648.442 | 25092.274 |
| 4/12/17 | 23603.268 | 25049.451 |
| 4/13/17 | 23580.681 | 25028.039 |
| 4/17/17 | 23648.442 | 25092.274 |
| 4/18/17 | 23648.442 | 25092.274 |
| 4/19/17 | 23625.855 | 25070.862 |
| 4/20/17 | 23603.268 | 25049.451 |
| 4/21/17 | 23580.681 | 25028.039 |
| 4/24/17 | 23671.029 | 25113.686 |
| 4/25/17 | 23716.202 | 25156.509 |
| 4/26/17 | 23761.376 | 25199.332 |
| 4/27/17 | 23751.217 | 25195.05 |
| 4/28/17 | 23751.217 | 25195.05 |
| 5/1/17 | 23751.217 | 25195.05 |
| 5/2/17 | 23751.217 | 25195.05 |
| 5/3/17 | 23637.792 | 25087.992 |
| 5/4/17 | 23547.052 | 25002.345 |
| 5/5/17 | 23592.422 | 25045.169 |
| 5/8/17 | 23592.422 | 25045.169 |
| 5/9/17 | 23547.052 | 25002.345 |
| 5/10/17 | 23592.422 | 25045.169 |
| 5/11/17 | 23592.422 | 25045.169 |
| 5/12/17 | 23569.737 | 25023.757 |
| 5/15/17 | 23660.477 | 25109.403 |
| 5/16/17 | 23660.477 | 25109.403 |
| 5/17/17 | 23524.367 | 24980.934 |
| 5/18/17 | 23524.367 | 24980.934 |
| 5/19/17 | 23569.737 | 25023.757 |
| 5/22/17 | 23637.792 | 25087.992 |
| 5/23/17 | 23683.162 | 25130.815 |
| 5/24/17 | 23705.847 | 25152.227 |
| 5/25/17 | 23705.847 | 25152.227 |
| 5/26/17 | 23705.847 | 25152.227 |
| 5/30/17 | 23569.737 | 25023.757 |
| 5/31/17 | 23547.052 | 25002.345 |
| 6/1/17 | 23637.792 | 25087.992 |
| 6/2/17 | 23660.477 | 25109.403 |
| 6/5/17 | 23637.792 | 25087.992 |
| 6/6/17 | 23615.107 | 25066.58 |
| 6/7/17 | 23592.422 | 25045.169 |
| 6/8/17 | 23615.107 | 25066.58 |
| 6/9/17 | 23683.162 | 25130.815 |
| 6/12/17 | 23705.847 | 25152.227 |
| 6/13/17 | 23705.847 | 25152.227 |
| 6/14/17 | 23705.847 | 25152.227 |
| 6/15/17 | 23683.162 | 25130.815 |
| 6/16/17 | 23683.162 | 25130.815 |